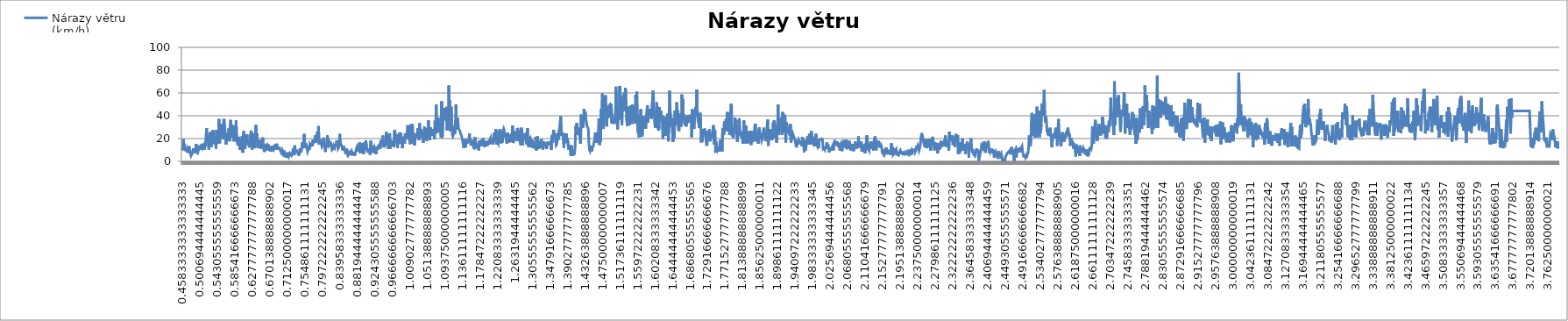
| Category | Nárazy větru (km/h) |
|---|---|
| 0.4583333333333333 | 9.4 |
| 0.4590277777777778 | 9 |
| 0.4597222222222222 | 9 |
| 0.4604166666666667 | 19.4 |
| 0.4611111111111111 | 19.4 |
| 0.4618055555555556 | 13 |
| 0.46249999999999997 | 13 |
| 0.46319444444444446 | 11.5 |
| 0.46388888888888885 | 11.5 |
| 0.46458333333333335 | 12.6 |
| 0.46527777777777773 | 12.6 |
| 0.46597222222222223 | 10.1 |
| 0.4666666666666666 | 10.1 |
| 0.4673611111111111 | 10.8 |
| 0.4680555555555555 | 10.8 |
| 0.46875 | 9.4 |
| 0.4694444444444445 | 9.4 |
| 0.4701388888888889 | 7.6 |
| 0.4708333333333334 | 7.6 |
| 0.47152777777777777 | 11.2 |
| 0.47222222222222227 | 11.2 |
| 0.47291666666666665 | 10.1 |
| 0.47361111111111115 | 10.1 |
| 0.47430555555555554 | 13.3 |
| 0.47500000000000003 | 13.3 |
| 0.4756944444444444 | 9.7 |
| 0.4763888888888889 | 9.7 |
| 0.4770833333333333 | 9.7 |
| 0.4777777777777778 | 7.9 |
| 0.4784722222222222 | 7.9 |
| 0.4791666666666667 | 5 |
| 0.4798611111111111 | 5 |
| 0.48055555555555557 | 5.4 |
| 0.48125 | 5.4 |
| 0.48194444444444445 | 6.8 |
| 0.4826388888888889 | 6.8 |
| 0.48333333333333334 | 6.8 |
| 0.4840277777777778 | 6.8 |
| 0.4847222222222222 | 11.5 |
| 0.48541666666666666 | 11.5 |
| 0.4861111111111111 | 7.2 |
| 0.48680555555555555 | 7.2 |
| 0.4875 | 7.2 |
| 0.48819444444444443 | 7.2 |
| 0.4888888888888889 | 11.2 |
| 0.4895833333333333 | 11.2 |
| 0.4902777777777778 | 8.6 |
| 0.4909722222222222 | 8.6 |
| 0.4916666666666667 | 15.1 |
| 0.4923611111111111 | 15.1 |
| 0.4930555555555556 | 12.2 |
| 0.49374999999999997 | 12.2 |
| 0.49444444444444446 | 6.1 |
| 0.49513888888888885 | 6.1 |
| 0.49583333333333335 | 8.3 |
| 0.49652777777777773 | 8.3 |
| 0.49722222222222223 | 10.1 |
| 0.4979166666666666 | 10.1 |
| 0.4986111111111111 | 14 |
| 0.499305555555556 | 12.6 |
| 0.5 | 12.6 |
| 0.500694444444445 | 11.2 |
| 0.501388888888889 | 11.2 |
| 0.502083333333334 | 11.5 |
| 0.502777777777778 | 11.5 |
| 0.503472222222223 | 11.2 |
| 0.504166666666667 | 11.2 |
| 0.504861111111112 | 15.5 |
| 0.505555555555556 | 15.5 |
| 0.506250000000001 | 15.8 |
| 0.506944444444445 | 15.8 |
| 0.50763888888889 | 11.5 |
| 0.508333333333334 | 11.5 |
| 0.509027777777779 | 10.8 |
| 0.509722222222223 | 10.8 |
| 0.510416666666668 | 13.3 |
| 0.511111111111112 | 13.3 |
| 0.511805555555557 | 10.1 |
| 0.512500000000001 | 10.1 |
| 0.513194444444446 | 16.6 |
| 0.51388888888889 | 16.6 |
| 0.514583333333335 | 13 |
| 0.515277777777779 | 13 |
| 0.515972222222224 | 13 |
| 0.516666666666668 | 29.2 |
| 0.517361111111113 | 29.2 |
| 0.518055555555557 | 19.4 |
| 0.518750000000002 | 19.4 |
| 0.519444444444446 | 20.9 |
| 0.520138888888891 | 20.9 |
| 0.520833333333335 | 16.9 |
| 0.52152777777778 | 16.9 |
| 0.522222222222224 | 10.4 |
| 0.522916666666669 | 10.4 |
| 0.523611111111113 | 20.2 |
| 0.524305555555558 | 20.2 |
| 0.525000000000002 | 24.1 |
| 0.525694444444447 | 24.1 |
| 0.526388888888891 | 25.6 |
| 0.527083333333336 | 25.6 |
| 0.52777777777778 | 12.6 |
| 0.528472222222225 | 12.6 |
| 0.529166666666669 | 12.2 |
| 0.529861111111114 | 12.2 |
| 0.530555555555558 | 25.9 |
| 0.531250000000003 | 25.9 |
| 0.531944444444447 | 27.4 |
| 0.532638888888892 | 27.4 |
| 0.533333333333336 | 24.5 |
| 0.534027777777781 | 24.5 |
| 0.534722222222225 | 20.5 |
| 0.53541666666667 | 20.5 |
| 0.536111111111114 | 15.1 |
| 0.536805555555559 | 15.1 |
| 0.537500000000003 | 15.5 |
| 0.538194444444448 | 22 |
| 0.538888888888892 | 22 |
| 0.539583333333337 | 11.2 |
| 0.540277777777781 | 11.2 |
| 0.540972222222226 | 27.7 |
| 0.54166666666667 | 27.7 |
| 0.542361111111115 | 15.8 |
| 0.543055555555559 | 15.8 |
| 0.543750000000004 | 20.2 |
| 0.544444444444448 | 20.2 |
| 0.545138888888893 | 17.3 |
| 0.545833333333337 | 17.3 |
| 0.546527777777781 | 37.1 |
| 0.547222222222226 | 37.1 |
| 0.54791666666667 | 15.8 |
| 0.548611111111115 | 15.8 |
| 0.549305555555559 | 18 |
| 0.550000000000004 | 18 |
| 0.550694444444448 | 33.1 |
| 0.551388888888893 | 33.1 |
| 0.552083333333337 | 32.4 |
| 0.552777777777782 | 32.4 |
| 0.553472222222227 | 21.6 |
| 0.554166666666671 | 21.6 |
| 0.554861111111116 | 22.7 |
| 0.55555555555556 | 22.7 |
| 0.556250000000005 | 22.7 |
| 0.556944444444449 | 19.4 |
| 0.557638888888894 | 19.4 |
| 0.558333333333338 | 37.1 |
| 0.559027777777783 | 37.1 |
| 0.559722222222227 | 36 |
| 0.560416666666672 | 36 |
| 0.561111111111116 | 28.4 |
| 0.561805555555561 | 28.4 |
| 0.562500000000005 | 20.5 |
| 0.56319444444445 | 20.5 |
| 0.563888888888894 | 14.8 |
| 0.564583333333339 | 14.8 |
| 0.565277777777783 | 20.9 |
| 0.565972222222227 | 20.9 |
| 0.566666666666672 | 18 |
| 0.567361111111116 | 18 |
| 0.568055555555561 | 25.2 |
| 0.568750000000005 | 25.2 |
| 0.56944444444445 | 22.7 |
| 0.570138888888894 | 22.7 |
| 0.570833333333339 | 29.2 |
| 0.571527777777783 | 29.2 |
| 0.572222222222228 | 17.6 |
| 0.572916666666672 | 17.6 |
| 0.573611111111117 | 29.2 |
| 0.574305555555561 | 29.2 |
| 0.575000000000006 | 36.4 |
| 0.57569444444445 | 21.2 |
| 0.576388888888895 | 21.2 |
| 0.577083333333339 | 32 |
| 0.577777777777784 | 32 |
| 0.578472222222228 | 24.1 |
| 0.579166666666673 | 24.1 |
| 0.579861111111117 | 24.1 |
| 0.580555555555562 | 24.1 |
| 0.581250000000006 | 31.7 |
| 0.581944444444451 | 31.7 |
| 0.582638888888895 | 17.6 |
| 0.58333333333334 | 17.6 |
| 0.584027777777784 | 20.9 |
| 0.584722222222229 | 20.9 |
| 0.585416666666673 | 17.6 |
| 0.586111111111118 | 17.6 |
| 0.586805555555562 | 24.8 |
| 0.587500000000007 | 24.8 |
| 0.588194444444451 | 36 |
| 0.588888888888896 | 36 |
| 0.58958333333334 | 19.1 |
| 0.590277777777785 | 19.1 |
| 0.590972222222229 | 19.4 |
| 0.591666666666674 | 19.4 |
| 0.592361111111118 | 14 |
| 0.593055555555563 | 14 |
| 0.593750000000007 | 14 |
| 0.594444444444452 | 21.6 |
| 0.595138888888896 | 21.6 |
| 0.595833333333341 | 16.2 |
| 0.596527777777786 | 16.2 |
| 0.59722222222223 | 10.1 |
| 0.597916666666675 | 10.1 |
| 0.598611111111119 | 13.7 |
| 0.599305555555564 | 13.7 |
| 0.600000000000008 | 12.2 |
| 0.600694444444453 | 12.2 |
| 0.601388888888897 | 11.5 |
| 0.602083333333342 | 11.5 |
| 0.602777777777786 | 22 |
| 0.603472222222231 | 22 |
| 0.604166666666675 | 7.6 |
| 0.60486111111112 | 7.6 |
| 0.605555555555564 | 23.4 |
| 0.606250000000009 | 23.4 |
| 0.606944444444453 | 26.6 |
| 0.607638888888898 | 26.6 |
| 0.608333333333342 | 14.4 |
| 0.609027777777787 | 14.4 |
| 0.609722222222231 | 10.8 |
| 0.610416666666676 | 10.8 |
| 0.61111111111112 | 17.3 |
| 0.611805555555565 | 17.3 |
| 0.612500000000009 | 22 |
| 0.613194444444454 | 23.8 |
| 0.613888888888898 | 23.8 |
| 0.614583333333343 | 14.8 |
| 0.615277777777787 | 14.8 |
| 0.615972222222232 | 16.6 |
| 0.616666666666676 | 16.6 |
| 0.617361111111121 | 15.5 |
| 0.618055555555565 | 15.5 |
| 0.61875000000001 | 14.4 |
| 0.619444444444454 | 14.4 |
| 0.620138888888899 | 12.2 |
| 0.620833333333343 | 12.2 |
| 0.621527777777788 | 23.4 |
| 0.622222222222232 | 23.4 |
| 0.622916666666677 | 22.3 |
| 0.623611111111121 | 22.3 |
| 0.624305555555566 | 27 |
| 0.62500000000001 | 27 |
| 0.625694444444455 | 24.5 |
| 0.626388888888899 | 24.5 |
| 0.627083333333344 | 10.4 |
| 0.627777777777788 | 10.4 |
| 0.628472222222233 | 16.2 |
| 0.629166666666677 | 16.2 |
| 0.629861111111122 | 24.5 |
| 0.630555555555566 | 24.5 |
| 0.631250000000011 | 24.5 |
| 0.631944444444455 | 11.5 |
| 0.6326388888889 | 11.5 |
| 0.633333333333344 | 12.2 |
| 0.634027777777789 | 12.2 |
| 0.634722222222233 | 23.4 |
| 0.635416666666677 | 23.4 |
| 0.636111111111122 | 32 |
| 0.636805555555566 | 32 |
| 0.637500000000011 | 19.1 |
| 0.638194444444455 | 19.1 |
| 0.6388888888889 | 24.5 |
| 0.639583333333344 | 24.5 |
| 0.640277777777789 | 11.9 |
| 0.640972222222233 | 11.9 |
| 0.641666666666678 | 15.5 |
| 0.642361111111122 | 15.5 |
| 0.643055555555567 | 18.7 |
| 0.643750000000011 | 18.7 |
| 0.644444444444456 | 13.7 |
| 0.6451388888889 | 13.7 |
| 0.645833333333345 | 16.6 |
| 0.646527777777789 | 16.6 |
| 0.647222222222234 | 11.2 |
| 0.647916666666678 | 11.2 |
| 0.648611111111123 | 16.2 |
| 0.649305555555567 | 16.2 |
| 0.650000000000012 | 16.6 |
| 0.650694444444456 | 16.6 |
| 0.651388888888901 | 14 |
| 0.652083333333345 | 14 |
| 0.65277777777779 | 20.9 |
| 0.653472222222234 | 13.3 |
| 0.654166666666679 | 13.3 |
| 0.654861111111123 | 13.7 |
| 0.655555555555568 | 13.7 |
| 0.656250000000012 | 8.3 |
| 0.656944444444457 | 8.3 |
| 0.657638888888901 | 8.3 |
| 0.658333333333346 | 8.3 |
| 0.65902777777779 | 14 |
| 0.659722222222235 | 14 |
| 0.660416666666679 | 15.5 |
| 0.661111111111124 | 15.5 |
| 0.661805555555568 | 12.2 |
| 0.662500000000013 | 12.2 |
| 0.663194444444457 | 13.3 |
| 0.663888888888902 | 13.3 |
| 0.664583333333346 | 9.7 |
| 0.665277777777791 | 9.7 |
| 0.665972222222235 | 14.8 |
| 0.66666666666668 | 14.8 |
| 0.667361111111124 | 13.3 |
| 0.668055555555569 | 13.3 |
| 0.668750000000013 | 11.2 |
| 0.669444444444458 | 11.2 |
| 0.670138888888902 | 9.7 |
| 0.670833333333347 | 9.7 |
| 0.671527777777791 | 9.7 |
| 0.672222222222236 | 9.7 |
| 0.67291666666668 | 9.7 |
| 0.673611111111125 | 9 |
| 0.674305555555569 | 9 |
| 0.675000000000014 | 13.7 |
| 0.675694444444458 | 13.7 |
| 0.676388888888903 | 9 |
| 0.677083333333347 | 9 |
| 0.677777777777792 | 12.2 |
| 0.678472222222236 | 12.2 |
| 0.679166666666681 | 10.8 |
| 0.679861111111125 | 10.8 |
| 0.68055555555557 | 11.5 |
| 0.681250000000014 | 11.5 |
| 0.681944444444459 | 13.7 |
| 0.682638888888903 | 13.7 |
| 0.683333333333348 | 15.1 |
| 0.684027777777792 | 15.1 |
| 0.684722222222237 | 10.4 |
| 0.685416666666681 | 10.4 |
| 0.686111111111126 | 15.5 |
| 0.68680555555557 | 15.5 |
| 0.687500000000015 | 13.3 |
| 0.688194444444459 | 13.3 |
| 0.688888888888904 | 11.5 |
| 0.689583333333348 | 11.5 |
| 0.690277777777793 | 10.8 |
| 0.690972222222237 | 10.8 |
| 0.691666666666682 | 11.2 |
| 0.692361111111126 | 12.6 |
| 0.693055555555571 | 12.6 |
| 0.693750000000015 | 11.2 |
| 0.69444444444446 | 11.2 |
| 0.695138888888904 | 9.4 |
| 0.695833333333349 | 9.4 |
| 0.696527777777793 | 9.7 |
| 0.697222222222238 | 9.7 |
| 0.697916666666682 | 7.6 |
| 0.698611111111127 | 7.6 |
| 0.699305555555571 | 5.8 |
| 0.700000000000016 | 5.8 |
| 0.70069444444446 | 9.4 |
| 0.701388888888905 | 9.4 |
| 0.702083333333349 | 8.3 |
| 0.702777777777794 | 8.3 |
| 0.703472222222238 | 4.3 |
| 0.704166666666683 | 4.3 |
| 0.704861111111127 | 9.4 |
| 0.705555555555572 | 9.4 |
| 0.706250000000016 | 5 |
| 0.706944444444461 | 5 |
| 0.707638888888905 | 5.4 |
| 0.70833333333335 | 5.4 |
| 0.709027777777794 | 5.4 |
| 0.709722222222239 | 3.2 |
| 0.710416666666683 | 3.2 |
| 0.711111111111128 | 5.4 |
| 0.711805555555572 | 5.4 |
| 0.712500000000017 | 7.9 |
| 0.713194444444461 | 7.9 |
| 0.713888888888906 | 8.3 |
| 0.71458333333335 | 8.3 |
| 0.715277777777795 | 4.3 |
| 0.715972222222239 | 4.3 |
| 0.716666666666684 | 5 |
| 0.717361111111128 | 5 |
| 0.718055555555573 | 7.2 |
| 0.718750000000017 | 7.2 |
| 0.719444444444462 | 7.6 |
| 0.720138888888906 | 7.6 |
| 0.720833333333351 | 5.8 |
| 0.721527777777795 | 5.8 |
| 0.72222222222224 | 5 |
| 0.722916666666684 | 5 |
| 0.723611111111129 | 5.8 |
| 0.724305555555573 | 5.8 |
| 0.725000000000018 | 8.6 |
| 0.725694444444462 | 8.6 |
| 0.726388888888907 | 11.2 |
| 0.727083333333351 | 11.2 |
| 0.727777777777796 | 7.6 |
| 0.72847222222224 | 7.6 |
| 0.729166666666685 | 5.4 |
| 0.729861111111129 | 14 |
| 0.730555555555574 | 14 |
| 0.731250000000018 | 10.4 |
| 0.731944444444463 | 10.4 |
| 0.732638888888907 | 7.9 |
| 0.733333333333352 | 7.9 |
| 0.734027777777796 | 10.1 |
| 0.734722222222241 | 10.1 |
| 0.735416666666685 | 8.3 |
| 0.73611111111113 | 8.3 |
| 0.736805555555574 | 7.6 |
| 0.737500000000019 | 7.6 |
| 0.738194444444463 | 7.2 |
| 0.738888888888908 | 7.2 |
| 0.739583333333352 | 5 |
| 0.740277777777797 | 5 |
| 0.740972222222241 | 7.2 |
| 0.741666666666686 | 7.2 |
| 0.74236111111113 | 11.5 |
| 0.743055555555575 | 11.5 |
| 0.743750000000019 | 9.7 |
| 0.744444444444464 | 9.7 |
| 0.745138888888908 | 7.6 |
| 0.745833333333353 | 7.6 |
| 0.746527777777797 | 11.5 |
| 0.747222222222242 | 11.5 |
| 0.747916666666686 | 11.5 |
| 0.748611111111131 | 16.9 |
| 0.749305555555575 | 16.9 |
| 0.75000000000002 | 11.5 |
| 0.750694444444464 | 11.5 |
| 0.751388888888909 | 15.1 |
| 0.752083333333353 | 15.1 |
| 0.752777777777798 | 24.1 |
| 0.753472222222242 | 24.1 |
| 0.754166666666687 | 13.3 |
| 0.754861111111131 | 13.3 |
| 0.755555555555576 | 13.3 |
| 0.75625000000002 | 13.3 |
| 0.756944444444465 | 12.6 |
| 0.757638888888909 | 12.6 |
| 0.758333333333354 | 13.7 |
| 0.759027777777798 | 13.7 |
| 0.759722222222243 | 13.7 |
| 0.760416666666687 | 13.7 |
| 0.761111111111132 | 8.6 |
| 0.761805555555576 | 8.6 |
| 0.762500000000021 | 8.6 |
| 0.763194444444465 | 8.6 |
| 0.76388888888891 | 11.5 |
| 0.764583333333354 | 11.5 |
| 0.765277777777799 | 10.1 |
| 0.765972222222243 | 10.1 |
| 0.766666666666688 | 15.1 |
| 0.767361111111132 | 15.1 |
| 0.768055555555577 | 15.5 |
| 0.768750000000021 | 13.7 |
| 0.769444444444466 | 13.7 |
| 0.77013888888891 | 14 |
| 0.770833333333355 | 14 |
| 0.771527777777799 | 15.5 |
| 0.772222222222244 | 15.5 |
| 0.772916666666688 | 13.3 |
| 0.773611111111132 | 13.3 |
| 0.774305555555577 | 19.1 |
| 0.775000000000021 | 19.1 |
| 0.775694444444466 | 16.6 |
| 0.77638888888891 | 16.6 |
| 0.777083333333355 | 16.6 |
| 0.777777777777799 | 16.6 |
| 0.778472222222244 | 17.3 |
| 0.779166666666688 | 17.3 |
| 0.779861111111133 | 23 |
| 0.780555555555577 | 23 |
| 0.781250000000022 | 16.6 |
| 0.781944444444466 | 16.6 |
| 0.782638888888911 | 18.4 |
| 0.783333333333355 | 18.4 |
| 0.7840277777778 | 24.8 |
| 0.784722222222244 | 24.8 |
| 0.785416666666689 | 24.5 |
| 0.786111111111133 | 24.5 |
| 0.786805555555578 | 24.5 |
| 0.787500000000022 | 31 |
| 0.788194444444467 | 31 |
| 0.788888888888911 | 14.8 |
| 0.789583333333356 | 14.8 |
| 0.7902777777778 | 17.3 |
| 0.790972222222245 | 17.3 |
| 0.791666666666689 | 19.4 |
| 0.792361111111134 | 19.4 |
| 0.793055555555578 | 18.7 |
| 0.793750000000023 | 18.7 |
| 0.794444444444467 | 15.8 |
| 0.795138888888912 | 15.8 |
| 0.795833333333356 | 13 |
| 0.796527777777801 | 13 |
| 0.797222222222245 | 14 |
| 0.79791666666669 | 14 |
| 0.798611111111134 | 16.6 |
| 0.799305555555579 | 16.6 |
| 0.800000000000023 | 20.9 |
| 0.800694444444468 | 20.9 |
| 0.801388888888912 | 16.6 |
| 0.802083333333357 | 16.6 |
| 0.802777777777801 | 17.3 |
| 0.803472222222246 | 17.3 |
| 0.80416666666669 | 8.3 |
| 0.804861111111135 | 8.3 |
| 0.805555555555579 | 13.7 |
| 0.806250000000024 | 13.7 |
| 0.806944444444468 | 15.5 |
| 0.807638888888913 | 12.6 |
| 0.808333333333357 | 12.6 |
| 0.809027777777802 | 22.7 |
| 0.809722222222246 | 22.7 |
| 0.810416666666691 | 14.8 |
| 0.811111111111135 | 14.8 |
| 0.81180555555558 | 19.4 |
| 0.812500000000024 | 19.4 |
| 0.813194444444469 | 14 |
| 0.813888888888913 | 14 |
| 0.814583333333358 | 14.8 |
| 0.815277777777802 | 14.8 |
| 0.815972222222247 | 15.1 |
| 0.816666666666691 | 15.1 |
| 0.817361111111136 | 15.8 |
| 0.81805555555558 | 15.8 |
| 0.818750000000025 | 13.7 |
| 0.819444444444469 | 13.7 |
| 0.820138888888914 | 10.1 |
| 0.820833333333358 | 10.1 |
| 0.821527777777803 | 9.7 |
| 0.822222222222247 | 9.7 |
| 0.822916666666692 | 11.2 |
| 0.823611111111136 | 11.2 |
| 0.824305555555581 | 13.7 |
| 0.825000000000025 | 13.7 |
| 0.82569444444447 | 13.7 |
| 0.826388888888914 | 12.2 |
| 0.827083333333359 | 12.2 |
| 0.827777777777803 | 15.5 |
| 0.828472222222248 | 15.5 |
| 0.829166666666692 | 13.3 |
| 0.829861111111137 | 13.3 |
| 0.830555555555581 | 13.7 |
| 0.831250000000026 | 13.7 |
| 0.83194444444447 | 18.4 |
| 0.832638888888915 | 18.4 |
| 0.833333333333359 | 18 |
| 0.834027777777804 | 18 |
| 0.834722222222248 | 11.2 |
| 0.835416666666693 | 11.2 |
| 0.836111111111137 | 12.2 |
| 0.836805555555582 | 12.2 |
| 0.837500000000026 | 13.3 |
| 0.838194444444471 | 13.3 |
| 0.838888888888915 | 24.1 |
| 0.83958333333336 | 24.1 |
| 0.840277777777804 | 13.7 |
| 0.840972222222249 | 13.7 |
| 0.841666666666693 | 15.5 |
| 0.842361111111138 | 15.5 |
| 0.843055555555582 | 16.2 |
| 0.843750000000027 | 16.2 |
| 0.844444444444471 | 12.6 |
| 0.845138888888916 | 12.6 |
| 0.84583333333336 | 9.7 |
| 0.846527777777805 | 12.2 |
| 0.847222222222249 | 12.2 |
| 0.847916666666694 | 12.2 |
| 0.848611111111138 | 12.2 |
| 0.849305555555583 | 12.6 |
| 0.850000000000027 | 12.6 |
| 0.850694444444472 | 13 |
| 0.851388888888916 | 13 |
| 0.852083333333361 | 8.3 |
| 0.852777777777805 | 8.3 |
| 0.85347222222225 | 6.5 |
| 0.854166666666694 | 6.5 |
| 0.854861111111139 | 11.2 |
| 0.855555555555583 | 11.2 |
| 0.856250000000028 | 7.6 |
| 0.856944444444472 | 7.6 |
| 0.857638888888917 | 6.1 |
| 0.858333333333361 | 6.1 |
| 0.859027777777806 | 7.6 |
| 0.85972222222225 | 7.6 |
| 0.860416666666695 | 6.1 |
| 0.861111111111139 | 6.1 |
| 0.861805555555584 | 7.2 |
| 0.862500000000028 | 7.2 |
| 0.863194444444473 | 7.2 |
| 0.863888888888917 | 8.3 |
| 0.864583333333362 | 8.3 |
| 0.865277777777806 | 5.4 |
| 0.865972222222251 | 5.4 |
| 0.866666666666695 | 6.1 |
| 0.86736111111114 | 6.1 |
| 0.868055555555584 | 8.3 |
| 0.868750000000029 | 8.3 |
| 0.869444444444473 | 6.1 |
| 0.870138888888918 | 6.1 |
| 0.870833333333362 | 6.5 |
| 0.871527777777807 | 6.5 |
| 0.872222222222251 | 6.5 |
| 0.872916666666696 | 6.5 |
| 0.87361111111114 | 8.3 |
| 0.874305555555585 | 8.3 |
| 0.875000000000029 | 5 |
| 0.875694444444474 | 5 |
| 0.876388888888918 | 7.2 |
| 0.877083333333363 | 7.2 |
| 0.877777777777807 | 9 |
| 0.878472222222252 | 9 |
| 0.879166666666696 | 9.7 |
| 0.879861111111141 | 9.7 |
| 0.880555555555585 | 12.6 |
| 0.88125000000003 | 12.6 |
| 0.881944444444474 | 11.2 |
| 0.882638888888919 | 11.2 |
| 0.883333333333363 | 8.6 |
| 0.884027777777808 | 10.1 |
| 0.884722222222252 | 10.1 |
| 0.885416666666697 | 13.7 |
| 0.886111111111141 | 13.7 |
| 0.886805555555586 | 16.6 |
| 0.88750000000003 | 16.6 |
| 0.888194444444475 | 7.2 |
| 0.888888888888919 | 7.2 |
| 0.889583333333364 | 10.4 |
| 0.890277777777808 | 10.4 |
| 0.890972222222253 | 9 |
| 0.891666666666697 | 9 |
| 0.892361111111142 | 7.2 |
| 0.893055555555586 | 7.2 |
| 0.893750000000031 | 16.2 |
| 0.894444444444475 | 16.2 |
| 0.89513888888892 | 14.8 |
| 0.895833333333364 | 14.8 |
| 0.896527777777809 | 6.5 |
| 0.897222222222253 | 6.5 |
| 0.897916666666698 | 10.4 |
| 0.898611111111142 | 10.4 |
| 0.899305555555587 | 13.3 |
| 0.900000000000031 | 13.3 |
| 0.900694444444476 | 12.2 |
| 0.90138888888892 | 12.2 |
| 0.902083333333365 | 18.4 |
| 0.902777777777809 | 18.4 |
| 0.903472222222254 | 18.4 |
| 0.904166666666698 | 11.2 |
| 0.904861111111143 | 11.2 |
| 0.905555555555587 | 9.4 |
| 0.906250000000032 | 9.4 |
| 0.906944444444476 | 7.6 |
| 0.907638888888921 | 7.6 |
| 0.908333333333365 | 9.7 |
| 0.90902777777781 | 9.7 |
| 0.909722222222254 | 11.2 |
| 0.910416666666699 | 11.2 |
| 0.911111111111143 | 8.6 |
| 0.911805555555587 | 8.6 |
| 0.912500000000032 | 5.8 |
| 0.913194444444476 | 5.8 |
| 0.913888888888921 | 18 |
| 0.914583333333365 | 18 |
| 0.91527777777781 | 14.4 |
| 0.915972222222254 | 14.4 |
| 0.916666666666699 | 11.2 |
| 0.917361111111143 | 11.2 |
| 0.918055555555588 | 13.3 |
| 0.918750000000032 | 13.3 |
| 0.919444444444477 | 7.6 |
| 0.920138888888921 | 7.6 |
| 0.920833333333366 | 10.8 |
| 0.92152777777781 | 10.8 |
| 0.922222222222255 | 12.2 |
| 0.922916666666699 | 12.2 |
| 0.923611111111144 | 12.6 |
| 0.924305555555588 | 12.6 |
| 0.925000000000033 | 6.8 |
| 0.925694444444477 | 12.2 |
| 0.926388888888922 | 12.2 |
| 0.927083333333366 | 6.5 |
| 0.927777777777811 | 6.5 |
| 0.928472222222255 | 11.9 |
| 0.9291666666667 | 11.9 |
| 0.929861111111144 | 11.5 |
| 0.930555555555589 | 11.5 |
| 0.931250000000033 | 11.5 |
| 0.931944444444478 | 11.5 |
| 0.932638888888922 | 14 |
| 0.933333333333367 | 14 |
| 0.934027777777811 | 13.3 |
| 0.934722222222256 | 13.3 |
| 0.9354166666667 | 14.8 |
| 0.936111111111145 | 14.8 |
| 0.936805555555589 | 10.8 |
| 0.937500000000034 | 10.8 |
| 0.938194444444478 | 18.7 |
| 0.938888888888923 | 18.7 |
| 0.939583333333367 | 17.6 |
| 0.940277777777812 | 17.6 |
| 0.940972222222256 | 17.6 |
| 0.941666666666701 | 17.6 |
| 0.942361111111145 | 17.6 |
| 0.94305555555559 | 22.7 |
| 0.943750000000034 | 22.7 |
| 0.944444444444479 | 12.6 |
| 0.945138888888923 | 12.6 |
| 0.945833333333368 | 15.1 |
| 0.946527777777812 | 15.1 |
| 0.947222222222257 | 12.2 |
| 0.947916666666701 | 12.2 |
| 0.948611111111146 | 15.5 |
| 0.94930555555559 | 15.5 |
| 0.950000000000035 | 18.7 |
| 0.950694444444479 | 18.7 |
| 0.951388888888924 | 25.9 |
| 0.952083333333368 | 25.9 |
| 0.952777777777813 | 14 |
| 0.953472222222257 | 14 |
| 0.954166666666702 | 15.5 |
| 0.954861111111146 | 15.5 |
| 0.955555555555591 | 23.4 |
| 0.956250000000035 | 23.4 |
| 0.95694444444448 | 10.8 |
| 0.957638888888924 | 10.8 |
| 0.958333333333369 | 22.7 |
| 0.959027777777813 | 22.7 |
| 0.959722222222258 | 24.5 |
| 0.960416666666702 | 24.5 |
| 0.961111111111147 | 11.2 |
| 0.961805555555591 | 18.7 |
| 0.962500000000036 | 18.7 |
| 0.96319444444448 | 15.1 |
| 0.963888888888925 | 15.1 |
| 0.964583333333369 | 14.4 |
| 0.965277777777814 | 14.4 |
| 0.965972222222258 | 18 |
| 0.966666666666703 | 18 |
| 0.967361111111147 | 13.3 |
| 0.968055555555592 | 13.3 |
| 0.968750000000036 | 16.6 |
| 0.969444444444481 | 16.6 |
| 0.970138888888925 | 12.6 |
| 0.97083333333337 | 12.6 |
| 0.971527777777814 | 27.7 |
| 0.972222222222259 | 27.7 |
| 0.972916666666703 | 25.2 |
| 0.973611111111148 | 25.2 |
| 0.974305555555592 | 20.5 |
| 0.975000000000037 | 20.5 |
| 0.975694444444481 | 16.2 |
| 0.976388888888926 | 16.2 |
| 0.97708333333337 | 23.8 |
| 0.977777777777815 | 23.8 |
| 0.978472222222259 | 11.9 |
| 0.979166666666704 | 11.9 |
| 0.979861111111148 | 11.9 |
| 0.980555555555593 | 19.1 |
| 0.981250000000037 | 19.1 |
| 0.981944444444482 | 23 |
| 0.982638888888926 | 23 |
| 0.983333333333371 | 25.2 |
| 0.984027777777815 | 25.2 |
| 0.98472222222226 | 15.5 |
| 0.985416666666704 | 15.5 |
| 0.986111111111149 | 25.2 |
| 0.986805555555593 | 25.2 |
| 0.987500000000038 | 25.2 |
| 0.988194444444482 | 25.2 |
| 0.988888888888927 | 18.7 |
| 0.989583333333371 | 18.7 |
| 0.990277777777816 | 11.5 |
| 0.99097222222226 | 11.5 |
| 0.991666666666705 | 16.2 |
| 0.992361111111149 | 16.2 |
| 0.993055555555594 | 18.7 |
| 0.993750000000038 | 18.7 |
| 0.994444444444483 | 21.2 |
| 0.995138888888927 | 21.2 |
| 0.995833333333372 | 15.5 |
| 0.996527777777816 | 15.5 |
| 0.997222222222261 | 24.5 |
| 0.997916666666705 | 24.5 |
| 0.99861111111115 | 23.8 |
| 0.999305555555594 | 23.8 |
| 1900-01-01 | 20.5 |
| 1900-01-01 00:01:00 | 22 |
| 1900-01-01 00:02:00 | 22 |
| 1900-01-01 00:03:00 | 22 |
| 1900-01-01 00:04:00 | 22 |
| 1900-01-01 00:05:00 | 31.7 |
| 1900-01-01 00:06:00 | 31.7 |
| 1900-01-01 00:07:00 | 19.4 |
| 1900-01-01 00:08:00 | 19.4 |
| 1900-01-01 00:09:00 | 22.7 |
| 1900-01-01 00:10:00 | 22.7 |
| 1900-01-01 00:11:00 | 18.7 |
| 1900-01-01 00:12:00 | 18.7 |
| 1900-01-01 00:13:00 | 15.1 |
| 1900-01-01 00:14:00 | 15.1 |
| 1900-01-01 00:15:00 | 32.4 |
| 1900-01-01 00:16:00 | 32.4 |
| 1900-01-01 00:17:00 | 15.8 |
| 1900-01-01 00:18:00 | 15.8 |
| 1900-01-01 00:19:00 | 18.7 |
| 1900-01-01 00:20:00 | 18.7 |
| 1900-01-01 00:21:00 | 32.8 |
| 1900-01-01 00:22:00 | 32.8 |
| 1900-01-01 00:23:00 | 20.5 |
| 1900-01-01 00:24:00 | 20.5 |
| 1900-01-01 00:25:00 | 20.5 |
| 1900-01-01 00:26:00 | 24.5 |
| 1900-01-01 00:27:00 | 24.5 |
| 1900-01-01 00:28:00 | 14 |
| 1900-01-01 00:29:00 | 14 |
| 1900-01-01 00:30:00 | 16.6 |
| 1900-01-01 00:31:00 | 16.6 |
| 1900-01-01 00:32:00 | 24.5 |
| 1900-01-01 00:33:00 | 24.5 |
| 1900-01-01 00:34:00 | 20.9 |
| 1900-01-01 00:35:00 | 20.9 |
| 1900-01-01 00:36:00 | 23 |
| 1900-01-01 00:37:00 | 23 |
| 1900-01-01 00:38:00 | 24.5 |
| 1900-01-01 00:39:00 | 24.5 |
| 1900-01-01 00:40:00 | 29.2 |
| 1900-01-01 00:41:00 | 29.2 |
| 1900-01-01 00:42:00 | 28.8 |
| 1900-01-01 00:43:00 | 28.8 |
| 1900-01-01 00:44:00 | 18.7 |
| 1900-01-01 00:45:00 | 18.7 |
| 1900-01-01 00:46:00 | 33.5 |
| 1900-01-01 00:47:00 | 33.5 |
| 1900-01-01 00:48:00 | 22.7 |
| 1900-01-01 00:49:00 | 22.7 |
| 1900-01-01 00:50:00 | 28.4 |
| 1900-01-01 00:51:00 | 28.4 |
| 1900-01-01 00:52:00 | 23 |
| 1900-01-01 00:53:00 | 23 |
| 1900-01-01 00:54:00 | 24.1 |
| 1900-01-01 00:55:00 | 24.1 |
| 1900-01-01 00:56:00 | 20.2 |
| 1900-01-01 00:57:00 | 22 |
| 1900-01-01 00:58:00 | 22 |
| 1900-01-01 00:59:00 | 16.2 |
| 1900-01-01 01:00:00 | 16.2 |
| 1900-01-01 01:01:00 | 25.2 |
| 1900-01-01 01:02:00 | 25.2 |
| 1900-01-01 01:03:00 | 29.5 |
| 1900-01-01 01:04:00 | 29.5 |
| 1900-01-01 01:05:00 | 29.2 |
| 1900-01-01 01:06:00 | 29.2 |
| 1900-01-01 01:07:00 | 28.8 |
| 1900-01-01 01:08:00 | 28.8 |
| 1900-01-01 01:09:00 | 22.7 |
| 1900-01-01 01:10:00 | 22.7 |
| 1900-01-01 01:11:00 | 18 |
| 1900-01-01 01:12:00 | 18 |
| 1900-01-01 01:13:00 | 27 |
| 1900-01-01 01:14:00 | 27 |
| 1900-01-01 01:15:00 | 25.2 |
| 1900-01-01 01:16:00 | 25.2 |
| 1900-01-01 01:17:00 | 36 |
| 1900-01-01 01:18:00 | 36 |
| 1900-01-01 01:19:00 | 23.4 |
| 1900-01-01 01:20:00 | 23.4 |
| 1900-01-01 01:21:00 | 23.4 |
| 1900-01-01 01:22:00 | 18.7 |
| 1900-01-01 01:23:00 | 18.7 |
| 1900-01-01 01:24:00 | 29.9 |
| 1900-01-01 01:25:00 | 29.9 |
| 1900-01-01 01:26:00 | 27 |
| 1900-01-01 01:27:00 | 27 |
| 1900-01-01 01:28:00 | 22.3 |
| 1900-01-01 01:29:00 | 22.3 |
| 1900-01-01 01:30:00 | 26.6 |
| 1900-01-01 01:31:00 | 26.6 |
| 1900-01-01 01:32:00 | 22.7 |
| 1900-01-01 01:33:00 | 22.7 |
| 1900-01-01 01:34:00 | 28.4 |
| 1900-01-01 01:35:00 | 28.4 |
| 1900-01-01 01:36:00 | 26.6 |
| 1900-01-01 01:37:00 | 26.6 |
| 1900-01-01 01:38:00 | 19.4 |
| 1900-01-01 01:39:00 | 19.4 |
| 1900-01-01 01:40:00 | 35.6 |
| 1900-01-01 01:41:00 | 35.6 |
| 1900-01-01 01:42:00 | 24.5 |
| 1900-01-01 01:43:00 | 24.5 |
| 1900-01-01 01:44:00 | 50 |
| 1900-01-01 01:45:00 | 50 |
| 1900-01-01 01:46:00 | 25.2 |
| 1900-01-01 01:47:00 | 25.2 |
| 1900-01-01 01:48:00 | 27.7 |
| 1900-01-01 01:49:00 | 27.7 |
| 1900-01-01 01:50:00 | 36.4 |
| 1900-01-01 01:51:00 | 38.5 |
| 1900-01-01 01:52:00 | 38.5 |
| 1900-01-01 01:53:00 | 32.4 |
| 1900-01-01 01:54:00 | 32.4 |
| 1900-01-01 01:55:00 | 25.6 |
| 1900-01-01 01:56:00 | 25.6 |
| 1900-01-01 01:57:00 | 27.7 |
| 1900-01-01 01:58:00 | 27.7 |
| 1900-01-01 01:59:00 | 33.1 |
| 1900-01-01 02:00:00 | 33.1 |
| 1900-01-01 02:01:00 | 21.2 |
| 1900-01-01 02:02:00 | 21.2 |
| 1900-01-01 02:03:00 | 52.6 |
| 1900-01-01 02:04:00 | 52.6 |
| 1900-01-01 02:05:00 | 20.5 |
| 1900-01-01 02:06:00 | 20.5 |
| 1900-01-01 02:07:00 | 29.9 |
| 1900-01-01 02:08:00 | 29.9 |
| 1900-01-01 02:09:00 | 37.8 |
| 1900-01-01 02:10:00 | 37.8 |
| 1900-01-01 02:11:00 | 36 |
| 1900-01-01 02:12:00 | 36 |
| 1900-01-01 02:13:00 | 46.8 |
| 1900-01-01 02:14:00 | 46.8 |
| 1900-01-01 02:15:00 | 45 |
| 1900-01-01 02:16:00 | 45 |
| 1900-01-01 02:17:00 | 45 |
| 1900-01-01 02:18:00 | 45 |
| 1900-01-01 02:19:00 | 45 |
| 1900-01-01 02:20:00 | 47.9 |
| 1900-01-01 02:21:00 | 47.9 |
| 1900-01-01 02:22:00 | 27.4 |
| 1900-01-01 02:23:00 | 27.4 |
| 1900-01-01 02:24:00 | 29.9 |
| 1900-01-01 02:25:00 | 29.9 |
| 1900-01-01 02:26:00 | 32 |
| 1900-01-01 02:27:00 | 32 |
| 1900-01-01 02:28:00 | 66.6 |
| 1900-01-01 02:29:00 | 66.6 |
| 1900-01-01 02:30:00 | 36 |
| 1900-01-01 02:31:00 | 36 |
| 1900-01-01 02:32:00 | 53.3 |
| 1900-01-01 02:33:00 | 53.3 |
| 1900-01-01 02:34:00 | 26.6 |
| 1900-01-01 02:35:00 | 26.6 |
| 1900-01-01 02:36:00 | 47.9 |
| 1900-01-01 02:37:00 | 47.9 |
| 1900-01-01 02:38:00 | 38.5 |
| 1900-01-01 02:39:00 | 38.5 |
| 1900-01-01 02:40:00 | 23.4 |
| 1900-01-01 02:41:00 | 23.4 |
| 1900-01-01 02:42:00 | 22 |
| 1900-01-01 02:43:00 | 22 |
| 1900-01-01 02:44:00 | 23.4 |
| 1900-01-01 02:45:00 | 23.4 |
| 1900-01-01 02:46:00 | 29.5 |
| 1900-01-01 02:47:00 | 31 |
| 1900-01-01 02:48:00 | 31 |
| 1900-01-01 02:49:00 | 24.1 |
| 1900-01-01 02:50:00 | 24.1 |
| 1900-01-01 02:51:00 | 36 |
| 1900-01-01 02:52:00 | 36 |
| 1900-01-01 02:53:00 | 50 |
| 1900-01-01 02:54:00 | 50 |
| 1900-01-01 02:55:00 | 28.1 |
| 1900-01-01 02:56:00 | 28.1 |
| 1900-01-01 02:57:00 | 29.5 |
| 1900-01-01 02:58:00 | 29.5 |
| 1900-01-01 02:59:00 | 38.5 |
| 1900-01-01 03:00:00 | 38.5 |
| 1900-01-01 03:01:00 | 29.5 |
| 1900-01-01 03:02:00 | 29.5 |
| 1900-01-01 03:03:00 | 28.4 |
| 1900-01-01 03:04:00 | 28.4 |
| 1900-01-01 03:05:00 | 28.1 |
| 1900-01-01 03:06:00 | 28.1 |
| 1900-01-01 03:07:00 | 26.3 |
| 1900-01-01 03:08:00 | 26.3 |
| 1900-01-01 03:09:00 | 24.1 |
| 1900-01-01 03:10:00 | 24.1 |
| 1900-01-01 03:11:00 | 24.1 |
| 1900-01-01 03:12:00 | 22.7 |
| 1900-01-01 03:13:00 | 22.7 |
| 1900-01-01 03:14:00 | 22.7 |
| 1900-01-01 03:15:00 | 22.7 |
| 1900-01-01 03:16:00 | 18 |
| 1900-01-01 03:17:00 | 18 |
| 1900-01-01 03:18:00 | 17.6 |
| 1900-01-01 03:19:00 | 17.6 |
| 1900-01-01 03:20:00 | 11.9 |
| 1900-01-01 03:21:00 | 11.9 |
| 1900-01-01 03:22:00 | 15.5 |
| 1900-01-01 03:23:00 | 15.5 |
| 1900-01-01 03:24:00 | 19.4 |
| 1900-01-01 03:25:00 | 19.4 |
| 1900-01-01 03:26:00 | 12.2 |
| 1900-01-01 03:27:00 | 12.2 |
| 1900-01-01 03:28:00 | 19.4 |
| 1900-01-01 03:29:00 | 19.4 |
| 1900-01-01 03:30:00 | 16.2 |
| 1900-01-01 03:31:00 | 16.2 |
| 1900-01-01 03:32:00 | 15.5 |
| 1900-01-01 03:33:00 | 15.5 |
| 1900-01-01 03:34:00 | 16.6 |
| 1900-01-01 03:35:00 | 16.6 |
| 1900-01-01 03:36:00 | 16.6 |
| 1900-01-01 03:37:00 | 16.6 |
| 1900-01-01 03:38:00 | 18.7 |
| 1900-01-01 03:39:00 | 18.7 |
| 1900-01-01 03:40:00 | 24.5 |
| 1900-01-01 03:41:00 | 19.1 |
| 1900-01-01 03:42:00 | 19.1 |
| 1900-01-01 03:43:00 | 17.3 |
| 1900-01-01 03:44:00 | 17.3 |
| 1900-01-01 03:45:00 | 14 |
| 1900-01-01 03:46:00 | 14 |
| 1900-01-01 03:47:00 | 18.7 |
| 1900-01-01 03:48:00 | 18.7 |
| 1900-01-01 03:49:00 | 18 |
| 1900-01-01 03:50:00 | 18 |
| 1900-01-01 03:51:00 | 15.1 |
| 1900-01-01 03:52:00 | 15.1 |
| 1900-01-01 03:53:00 | 16.9 |
| 1900-01-01 03:54:00 | 16.9 |
| 1900-01-01 03:55:00 | 12.2 |
| 1900-01-01 03:56:00 | 12.2 |
| 1900-01-01 03:57:00 | 10.8 |
| 1900-01-01 03:58:00 | 10.8 |
| 1900-01-01 03:59:00 | 21.2 |
| 1900-01-01 04:00:00 | 21.2 |
| 1900-01-01 04:01:00 | 13.3 |
| 1900-01-01 04:02:00 | 13.3 |
| 1900-01-01 04:03:00 | 13.3 |
| 1900-01-01 04:04:00 | 14.8 |
| 1900-01-01 04:05:00 | 14.8 |
| 1900-01-01 04:06:00 | 15.5 |
| 1900-01-01 04:07:00 | 15.5 |
| 1900-01-01 04:08:00 | 11.5 |
| 1900-01-01 04:09:00 | 11.5 |
| 1900-01-01 04:10:00 | 15.1 |
| 1900-01-01 04:11:00 | 15.1 |
| 1900-01-01 04:12:00 | 9.7 |
| 1900-01-01 04:13:00 | 9.7 |
| 1900-01-01 04:14:00 | 18 |
| 1900-01-01 04:15:00 | 18 |
| 1900-01-01 04:16:00 | 18 |
| 1900-01-01 04:17:00 | 18 |
| 1900-01-01 04:18:00 | 13.3 |
| 1900-01-01 04:19:00 | 13.3 |
| 1900-01-01 04:20:00 | 13 |
| 1900-01-01 04:21:00 | 13 |
| 1900-01-01 04:22:00 | 18.7 |
| 1900-01-01 04:23:00 | 18.7 |
| 1900-01-01 04:24:00 | 16.9 |
| 1900-01-01 04:25:00 | 16.9 |
| 1900-01-01 04:26:00 | 13.7 |
| 1900-01-01 04:27:00 | 13.7 |
| 1900-01-01 04:28:00 | 20.5 |
| 1900-01-01 04:29:00 | 20.5 |
| 1900-01-01 04:30:00 | 20.2 |
| 1900-01-01 04:31:00 | 20.2 |
| 1900-01-01 04:32:00 | 12.6 |
| 1900-01-01 04:33:00 | 12.6 |
| 1900-01-01 04:34:00 | 13.3 |
| 1900-01-01 04:35:00 | 13.3 |
| 1900-01-01 04:36:00 | 17.6 |
| 1900-01-01 04:37:00 | 17.6 |
| 1900-01-01 04:38:00 | 18 |
| 1900-01-01 04:39:00 | 18 |
| 1900-01-01 04:40:00 | 13.3 |
| 1900-01-01 04:41:00 | 13.3 |
| 1900-01-01 04:42:00 | 18 |
| 1900-01-01 04:43:00 | 18 |
| 1900-01-01 04:44:00 | 14 |
| 1900-01-01 04:45:00 | 14 |
| 1900-01-01 04:46:00 | 18 |
| 1900-01-01 04:47:00 | 18 |
| 1900-01-01 04:48:00 | 18.4 |
| 1900-01-01 04:49:00 | 18.4 |
| 1900-01-01 04:50:00 | 15.1 |
| 1900-01-01 04:51:00 | 15.1 |
| 1900-01-01 04:52:00 | 19.8 |
| 1900-01-01 04:53:00 | 19.8 |
| 1900-01-01 04:54:00 | 20.9 |
| 1900-01-01 04:55:00 | 20.9 |
| 1900-01-01 04:56:00 | 20.9 |
| 1900-01-01 04:57:00 | 15.5 |
| 1900-01-01 04:58:00 | 15.5 |
| 1900-01-01 04:59:00 | 18 |
| 1900-01-01 05:00:00 | 18 |
| 1900-01-01 05:01:00 | 18 |
| 1900-01-01 05:02:00 | 14.8 |
| 1900-01-01 05:03:00 | 14.8 |
| 1900-01-01 05:04:00 | 19.4 |
| 1900-01-01 05:05:00 | 19.4 |
| 1900-01-01 05:06:00 | 25.2 |
| 1900-01-01 05:07:00 | 25.2 |
| 1900-01-01 05:08:00 | 25.9 |
| 1900-01-01 05:09:00 | 25.9 |
| 1900-01-01 05:10:00 | 18 |
| 1900-01-01 05:11:00 | 18 |
| 1900-01-01 05:12:00 | 28.1 |
| 1900-01-01 05:13:00 | 28.1 |
| 1900-01-01 05:14:00 | 14.8 |
| 1900-01-01 05:15:00 | 14.8 |
| 1900-01-01 05:16:00 | 17.3 |
| 1900-01-01 05:17:00 | 17.3 |
| 1900-01-01 05:18:00 | 17.3 |
| 1900-01-01 05:19:00 | 17.3 |
| 1900-01-01 05:20:00 | 15.5 |
| 1900-01-01 05:21:00 | 15.5 |
| 1900-01-01 05:22:00 | 27 |
| 1900-01-01 05:23:00 | 27 |
| 1900-01-01 05:24:00 | 19.1 |
| 1900-01-01 05:25:00 | 19.1 |
| 1900-01-01 05:26:00 | 28.1 |
| 1900-01-01 05:27:00 | 28.1 |
| 1900-01-01 05:28:00 | 21.6 |
| 1900-01-01 05:29:00 | 21.6 |
| 1900-01-01 05:30:00 | 15.8 |
| 1900-01-01 05:31:00 | 15.8 |
| 1900-01-01 05:32:00 | 18 |
| 1900-01-01 05:33:00 | 25.9 |
| 1900-01-01 05:34:00 | 25.9 |
| 1900-01-01 05:35:00 | 16.6 |
| 1900-01-01 05:36:00 | 16.6 |
| 1900-01-01 05:37:00 | 27.4 |
| 1900-01-01 05:38:00 | 27.4 |
| 1900-01-01 05:39:00 | 28.8 |
| 1900-01-01 05:40:00 | 28.8 |
| 1900-01-01 05:41:00 | 27.4 |
| 1900-01-01 05:42:00 | 27.4 |
| 1900-01-01 05:43:00 | 21.2 |
| 1900-01-01 05:44:00 | 21.2 |
| 1900-01-01 05:45:00 | 24.5 |
| 1900-01-01 05:46:00 | 24.5 |
| 1900-01-01 05:47:00 | 22 |
| 1900-01-01 05:48:00 | 22 |
| 1900-01-01 05:49:00 | 16.6 |
| 1900-01-01 05:50:00 | 16.6 |
| 1900-01-01 05:51:00 | 15.5 |
| 1900-01-01 05:52:00 | 15.5 |
| 1900-01-01 05:53:00 | 25.2 |
| 1900-01-01 05:54:00 | 25.2 |
| 1900-01-01 05:55:00 | 18.4 |
| 1900-01-01 05:56:00 | 18.4 |
| 1900-01-01 05:57:00 | 18.4 |
| 1900-01-01 05:58:00 | 16.6 |
| 1900-01-01 05:59:00 | 16.6 |
| 1900-01-01 06:00:00 | 20.9 |
| 1900-01-01 06:01:00 | 20.9 |
| 1900-01-01 06:02:00 | 22 |
| 1900-01-01 06:03:00 | 22 |
| 1900-01-01 06:04:00 | 22 |
| 1900-01-01 06:05:00 | 22 |
| 1900-01-01 06:06:00 | 18.7 |
| 1900-01-01 06:07:00 | 18.7 |
| 1900-01-01 06:08:00 | 16.9 |
| 1900-01-01 06:09:00 | 16.9 |
| 1900-01-01 06:10:00 | 31.3 |
| 1900-01-01 06:11:00 | 31.3 |
| 1900-01-01 06:12:00 | 16.2 |
| 1900-01-01 06:13:00 | 16.2 |
| 1900-01-01 06:14:00 | 17.3 |
| 1900-01-01 06:15:00 | 17.3 |
| 1900-01-01 06:16:00 | 26.3 |
| 1900-01-01 06:17:00 | 26.3 |
| 1900-01-01 06:18:00 | 24.1 |
| 1900-01-01 06:19:00 | 24.1 |
| 1900-01-01 06:20:00 | 25.6 |
| 1900-01-01 06:21:00 | 25.6 |
| 1900-01-01 06:22:00 | 21.2 |
| 1900-01-01 06:23:00 | 21.2 |
| 1900-01-01 06:24:00 | 18 |
| 1900-01-01 06:25:00 | 18 |
| 1900-01-01 06:26:00 | 18.7 |
| 1900-01-01 06:27:00 | 29.2 |
| 1900-01-01 06:28:00 | 29.2 |
| 1900-01-01 06:29:00 | 28.1 |
| 1900-01-01 06:30:00 | 28.1 |
| 1900-01-01 06:31:00 | 25.6 |
| 1900-01-01 06:32:00 | 25.6 |
| 1900-01-01 06:33:00 | 17.6 |
| 1900-01-01 06:34:00 | 17.6 |
| 1900-01-01 06:35:00 | 26.6 |
| 1900-01-01 06:36:00 | 26.6 |
| 1900-01-01 06:37:00 | 16.2 |
| 1900-01-01 06:38:00 | 16.2 |
| 1900-01-01 06:39:00 | 14 |
| 1900-01-01 06:40:00 | 14 |
| 1900-01-01 06:41:00 | 29.5 |
| 1900-01-01 06:42:00 | 29.5 |
| 1900-01-01 06:43:00 | 21.6 |
| 1900-01-01 06:44:00 | 21.6 |
| 1900-01-01 06:45:00 | 14 |
| 1900-01-01 06:46:00 | 14 |
| 1900-01-01 06:47:00 | 24.1 |
| 1900-01-01 06:48:00 | 24.1 |
| 1900-01-01 06:49:00 | 21.2 |
| 1900-01-01 06:50:00 | 21.2 |
| 1900-01-01 06:51:00 | 21.2 |
| 1900-01-01 06:52:00 | 20.5 |
| 1900-01-01 06:53:00 | 20.5 |
| 1900-01-01 06:54:00 | 19.1 |
| 1900-01-01 06:55:00 | 19.1 |
| 1900-01-01 06:56:00 | 24.8 |
| 1900-01-01 06:57:00 | 24.8 |
| 1900-01-01 06:58:00 | 15.1 |
| 1900-01-01 06:59:00 | 15.1 |
| 1900-01-01 07:00:00 | 19.1 |
| 1900-01-01 07:01:00 | 19.1 |
| 1900-01-01 07:02:00 | 29.2 |
| 1900-01-01 07:03:00 | 29.2 |
| 1900-01-01 07:04:00 | 15.5 |
| 1900-01-01 07:05:00 | 15.5 |
| 1900-01-01 07:06:00 | 12.6 |
| 1900-01-01 07:07:00 | 12.6 |
| 1900-01-01 07:08:00 | 18.7 |
| 1900-01-01 07:09:00 | 18.7 |
| 1900-01-01 07:10:00 | 19.4 |
| 1900-01-01 07:11:00 | 19.4 |
| 1900-01-01 07:12:00 | 20.5 |
| 1900-01-01 07:13:00 | 20.5 |
| 1900-01-01 07:14:00 | 18.4 |
| 1900-01-01 07:15:00 | 18.4 |
| 1900-01-01 07:16:00 | 12.2 |
| 1900-01-01 07:17:00 | 12.2 |
| 1900-01-01 07:18:00 | 15.1 |
| 1900-01-01 07:19:00 | 19.1 |
| 1900-01-01 07:20:00 | 19.1 |
| 1900-01-01 07:21:00 | 14.8 |
| 1900-01-01 07:22:00 | 14.8 |
| 1900-01-01 07:23:00 | 11.5 |
| 1900-01-01 07:24:00 | 11.5 |
| 1900-01-01 07:25:00 | 14 |
| 1900-01-01 07:26:00 | 14 |
| 1900-01-01 07:27:00 | 13 |
| 1900-01-01 07:28:00 | 13 |
| 1900-01-01 07:29:00 | 14 |
| 1900-01-01 07:30:00 | 14 |
| 1900-01-01 07:31:00 | 21.6 |
| 1900-01-01 07:32:00 | 21.6 |
| 1900-01-01 07:33:00 | 9.7 |
| 1900-01-01 07:34:00 | 9.7 |
| 1900-01-01 07:35:00 | 17.6 |
| 1900-01-01 07:36:00 | 17.6 |
| 1900-01-01 07:37:00 | 22 |
| 1900-01-01 07:38:00 | 22 |
| 1900-01-01 07:39:00 | 16.2 |
| 1900-01-01 07:40:00 | 16.2 |
| 1900-01-01 07:41:00 | 10.8 |
| 1900-01-01 07:42:00 | 10.8 |
| 1900-01-01 07:43:00 | 17.3 |
| 1900-01-01 07:44:00 | 17.3 |
| 1900-01-01 07:45:00 | 17.3 |
| 1900-01-01 07:46:00 | 11.5 |
| 1900-01-01 07:47:00 | 11.5 |
| 1900-01-01 07:48:00 | 16.9 |
| 1900-01-01 07:49:00 | 16.9 |
| 1900-01-01 07:50:00 | 19.4 |
| 1900-01-01 07:51:00 | 19.4 |
| 1900-01-01 07:52:00 | 17.6 |
| 1900-01-01 07:53:00 | 17.6 |
| 1900-01-01 07:54:00 | 13.3 |
| 1900-01-01 07:55:00 | 13.3 |
| 1900-01-01 07:56:00 | 10.4 |
| 1900-01-01 07:57:00 | 10.4 |
| 1900-01-01 07:58:00 | 17.6 |
| 1900-01-01 07:59:00 | 17.6 |
| 1900-01-01 08:00:00 | 13.3 |
| 1900-01-01 08:01:00 | 13.3 |
| 1900-01-01 08:02:00 | 16.2 |
| 1900-01-01 08:03:00 | 16.2 |
| 1900-01-01 08:04:00 | 14.8 |
| 1900-01-01 08:05:00 | 14.8 |
| 1900-01-01 08:06:00 | 14 |
| 1900-01-01 08:07:00 | 14 |
| 1900-01-01 08:08:00 | 10.8 |
| 1900-01-01 08:09:00 | 10.8 |
| 1900-01-01 08:10:00 | 13.3 |
| 1900-01-01 08:11:00 | 13.3 |
| 1900-01-01 08:12:00 | 17.3 |
| 1900-01-01 08:13:00 | 17.3 |
| 1900-01-01 08:14:00 | 15.1 |
| 1900-01-01 08:15:00 | 15.1 |
| 1900-01-01 08:16:00 | 14.8 |
| 1900-01-01 08:17:00 | 15.1 |
| 1900-01-01 08:18:00 | 15.1 |
| 1900-01-01 08:19:00 | 16.2 |
| 1900-01-01 08:20:00 | 16.2 |
| 1900-01-01 08:21:00 | 16.6 |
| 1900-01-01 08:22:00 | 16.6 |
| 1900-01-01 08:23:00 | 17.3 |
| 1900-01-01 08:24:00 | 17.3 |
| 1900-01-01 08:25:00 | 10.1 |
| 1900-01-01 08:26:00 | 10.1 |
| 1900-01-01 08:27:00 | 22.7 |
| 1900-01-01 08:28:00 | 22.7 |
| 1900-01-01 08:29:00 | 16.2 |
| 1900-01-01 08:30:00 | 16.2 |
| 1900-01-01 08:31:00 | 23.4 |
| 1900-01-01 08:32:00 | 23.4 |
| 1900-01-01 08:33:00 | 27.7 |
| 1900-01-01 08:34:00 | 27.7 |
| 1900-01-01 08:35:00 | 23.4 |
| 1900-01-01 08:36:00 | 23.4 |
| 1900-01-01 08:37:00 | 24.8 |
| 1900-01-01 08:38:00 | 24.8 |
| 1900-01-01 08:39:00 | 19.4 |
| 1900-01-01 08:40:00 | 19.4 |
| 1900-01-01 08:41:00 | 19.4 |
| 1900-01-01 08:42:00 | 14 |
| 1900-01-01 08:43:00 | 14 |
| 1900-01-01 08:44:00 | 14.8 |
| 1900-01-01 08:45:00 | 14.8 |
| 1900-01-01 08:46:00 | 18.7 |
| 1900-01-01 08:47:00 | 18.7 |
| 1900-01-01 08:48:00 | 24.5 |
| 1900-01-01 08:49:00 | 24.5 |
| 1900-01-01 08:50:00 | 19.1 |
| 1900-01-01 08:51:00 | 19.1 |
| 1900-01-01 08:52:00 | 27 |
| 1900-01-01 08:53:00 | 27 |
| 1900-01-01 08:54:00 | 29.9 |
| 1900-01-01 08:55:00 | 29.9 |
| 1900-01-01 08:56:00 | 35.3 |
| 1900-01-01 08:57:00 | 35.3 |
| 1900-01-01 08:58:00 | 39.6 |
| 1900-01-01 08:59:00 | 39.6 |
| 1900-01-01 09:00:00 | 23 |
| 1900-01-01 09:01:00 | 23 |
| 1900-01-01 09:02:00 | 23.4 |
| 1900-01-01 09:03:00 | 23.4 |
| 1900-01-01 09:04:00 | 23 |
| 1900-01-01 09:05:00 | 23 |
| 1900-01-01 09:06:00 | 25.2 |
| 1900-01-01 09:07:00 | 25.2 |
| 1900-01-01 09:08:00 | 15.1 |
| 1900-01-01 09:09:00 | 11.9 |
| 1900-01-01 09:10:00 | 11.9 |
| 1900-01-01 09:11:00 | 22.7 |
| 1900-01-01 09:12:00 | 22.7 |
| 1900-01-01 09:13:00 | 20.5 |
| 1900-01-01 09:14:00 | 20.5 |
| 1900-01-01 09:15:00 | 18 |
| 1900-01-01 09:16:00 | 18 |
| 1900-01-01 09:17:00 | 24.5 |
| 1900-01-01 09:18:00 | 24.5 |
| 1900-01-01 09:19:00 | 16.6 |
| 1900-01-01 09:20:00 | 16.6 |
| 1900-01-01 09:21:00 | 20.5 |
| 1900-01-01 09:22:00 | 20.5 |
| 1900-01-01 09:23:00 | 20.2 |
| 1900-01-01 09:24:00 | 20.2 |
| 1900-01-01 09:25:00 | 11.5 |
| 1900-01-01 09:26:00 | 11.5 |
| 1900-01-01 09:27:00 | 12.2 |
| 1900-01-01 09:28:00 | 12.2 |
| 1900-01-01 09:29:00 | 12.2 |
| 1900-01-01 09:30:00 | 12.2 |
| 1900-01-01 09:31:00 | 14 |
| 1900-01-01 09:32:00 | 14 |
| 1900-01-01 09:33:00 | 5 |
| 1900-01-01 09:34:00 | 5 |
| 1900-01-01 09:35:00 | 5 |
| 1900-01-01 09:36:00 | 14 |
| 1900-01-01 09:37:00 | 14 |
| 1900-01-01 09:38:00 | 8.3 |
| 1900-01-01 09:39:00 | 8.3 |
| 1900-01-01 09:40:00 | 4.7 |
| 1900-01-01 09:41:00 | 4.7 |
| 1900-01-01 09:42:00 | 9.7 |
| 1900-01-01 09:43:00 | 9.7 |
| 1900-01-01 09:44:00 | 5.8 |
| 1900-01-01 09:45:00 | 5.8 |
| 1900-01-01 09:46:00 | 7.2 |
| 1900-01-01 09:47:00 | 7.2 |
| 1900-01-01 09:48:00 | 12.6 |
| 1900-01-01 09:49:00 | 12.6 |
| 1900-01-01 09:50:00 | 31 |
| 1900-01-01 09:51:00 | 31 |
| 1900-01-01 09:52:00 | 25.6 |
| 1900-01-01 09:53:00 | 25.6 |
| 1900-01-01 09:54:00 | 33.8 |
| 1900-01-01 09:55:00 | 33.8 |
| 1900-01-01 09:56:00 | 28.1 |
| 1900-01-01 09:57:00 | 28.1 |
| 1900-01-01 09:58:00 | 23.4 |
| 1900-01-01 09:59:00 | 23.4 |
| 1900-01-01 10:00:00 | 28.4 |
| 1900-01-01 10:01:00 | 28.4 |
| 1900-01-01 10:02:00 | 29.5 |
| 1900-01-01 10:03:00 | 29.5 |
| 1900-01-01 10:04:00 | 21.6 |
| 1900-01-01 10:05:00 | 22.7 |
| 1900-01-01 10:06:00 | 22.7 |
| 1900-01-01 10:07:00 | 15.5 |
| 1900-01-01 10:08:00 | 15.5 |
| 1900-01-01 10:09:00 | 41 |
| 1900-01-01 10:10:00 | 41 |
| 1900-01-01 10:11:00 | 35.6 |
| 1900-01-01 10:12:00 | 35.6 |
| 1900-01-01 10:13:00 | 32 |
| 1900-01-01 10:14:00 | 32 |
| 1900-01-01 10:15:00 | 29.5 |
| 1900-01-01 10:16:00 | 29.5 |
| 1900-01-01 10:17:00 | 32.8 |
| 1900-01-01 10:18:00 | 32.8 |
| 1900-01-01 10:19:00 | 46.1 |
| 1900-01-01 10:20:00 | 46.1 |
| 1900-01-01 10:21:00 | 36.7 |
| 1900-01-01 10:22:00 | 36.7 |
| 1900-01-01 10:23:00 | 43.6 |
| 1900-01-01 10:24:00 | 43.6 |
| 1900-01-01 10:25:00 | 38.9 |
| 1900-01-01 10:26:00 | 38.9 |
| 1900-01-01 10:27:00 | 38.9 |
| 1900-01-01 10:28:00 | 38.9 |
| 1900-01-01 10:29:00 | 31.3 |
| 1900-01-01 10:30:00 | 31.3 |
| 1900-01-01 10:31:00 | 31.3 |
| 1900-01-01 10:32:00 | 29.5 |
| 1900-01-01 10:33:00 | 29.5 |
| 1900-01-01 10:34:00 | 28.4 |
| 1900-01-01 10:35:00 | 28.4 |
| 1900-01-01 10:36:00 | 16.2 |
| 1900-01-01 10:37:00 | 16.2 |
| 1900-01-01 10:38:00 | 10.1 |
| 1900-01-01 10:39:00 | 10.1 |
| 1900-01-01 10:40:00 | 9 |
| 1900-01-01 10:41:00 | 9 |
| 1900-01-01 10:42:00 | 9.7 |
| 1900-01-01 10:43:00 | 9.7 |
| 1900-01-01 10:44:00 | 13.7 |
| 1900-01-01 10:45:00 | 13.7 |
| 1900-01-01 10:46:00 | 9 |
| 1900-01-01 10:47:00 | 9 |
| 1900-01-01 10:48:00 | 11.5 |
| 1900-01-01 10:49:00 | 11.5 |
| 1900-01-01 10:50:00 | 10.8 |
| 1900-01-01 10:51:00 | 10.8 |
| 1900-01-01 10:52:00 | 14 |
| 1900-01-01 10:53:00 | 14 |
| 1900-01-01 10:54:00 | 17.6 |
| 1900-01-01 10:55:00 | 17.6 |
| 1900-01-01 10:56:00 | 19.1 |
| 1900-01-01 10:57:00 | 19.1 |
| 1900-01-01 10:58:00 | 25.2 |
| 1900-01-01 10:59:00 | 25.2 |
| 1900-01-01 11:00:00 | 22 |
| 1900-01-01 11:01:00 | 16.6 |
| 1900-01-01 11:02:00 | 16.6 |
| 1900-01-01 11:03:00 | 18.7 |
| 1900-01-01 11:04:00 | 18.7 |
| 1900-01-01 11:05:00 | 16.2 |
| 1900-01-01 11:06:00 | 16.2 |
| 1900-01-01 11:07:00 | 25.6 |
| 1900-01-01 11:08:00 | 25.6 |
| 1900-01-01 11:09:00 | 19.1 |
| 1900-01-01 11:10:00 | 19.1 |
| 1900-01-01 11:11:00 | 37.4 |
| 1900-01-01 11:12:00 | 37.4 |
| 1900-01-01 11:13:00 | 14.4 |
| 1900-01-01 11:14:00 | 14.4 |
| 1900-01-01 11:15:00 | 18.4 |
| 1900-01-01 11:16:00 | 18.4 |
| 1900-01-01 11:17:00 | 17.3 |
| 1900-01-01 11:18:00 | 17.3 |
| 1900-01-01 11:19:00 | 46.1 |
| 1900-01-01 11:20:00 | 46.1 |
| 1900-01-01 11:21:00 | 37.4 |
| 1900-01-01 11:22:00 | 37.4 |
| 1900-01-01 11:23:00 | 59.4 |
| 1900-01-01 11:24:00 | 59.4 |
| 1900-01-01 11:25:00 | 59.4 |
| 1900-01-01 11:26:00 | 28.4 |
| 1900-01-01 11:27:00 | 28.4 |
| 1900-01-01 11:28:00 | 34.9 |
| 1900-01-01 11:29:00 | 34.9 |
| 1900-01-01 11:30:00 | 41.8 |
| 1900-01-01 11:31:00 | 41.8 |
| 1900-01-01 11:32:00 | 51.5 |
| 1900-01-01 11:33:00 | 51.5 |
| 1900-01-01 11:34:00 | 58 |
| 1900-01-01 11:35:00 | 58 |
| 1900-01-01 11:36:00 | 40.3 |
| 1900-01-01 11:37:00 | 40.3 |
| 1900-01-01 11:38:00 | 30.6 |
| 1900-01-01 11:39:00 | 30.6 |
| 1900-01-01 11:40:00 | 46.8 |
| 1900-01-01 11:41:00 | 46.8 |
| 1900-01-01 11:42:00 | 38.2 |
| 1900-01-01 11:43:00 | 38.2 |
| 1900-01-01 11:44:00 | 47.9 |
| 1900-01-01 11:45:00 | 47.9 |
| 1900-01-01 11:46:00 | 48.2 |
| 1900-01-01 11:47:00 | 48.2 |
| 1900-01-01 11:48:00 | 49.3 |
| 1900-01-01 11:49:00 | 49.3 |
| 1900-01-01 11:50:00 | 40 |
| 1900-01-01 11:51:00 | 40 |
| 1900-01-01 11:52:00 | 38.5 |
| 1900-01-01 11:53:00 | 38.5 |
| 1900-01-01 11:54:00 | 50.4 |
| 1900-01-01 11:55:00 | 50.4 |
| 1900-01-01 11:56:00 | 33.5 |
| 1900-01-01 11:57:00 | 41.4 |
| 1900-01-01 11:58:00 | 41.4 |
| 1900-01-01 11:59:00 | 33.8 |
| 1900-01-01 12:00:00 | 33.8 |
| 1900-01-01 12:01:00 | 33.8 |
| 1900-01-01 12:02:00 | 33.8 |
| 1900-01-01 12:03:00 | 33.8 |
| 1900-01-01 12:04:00 | 33.8 |
| 1900-01-01 12:05:00 | 33.8 |
| 1900-01-01 12:06:00 | 33.8 |
| 1900-01-01 12:07:00 | 33.8 |
| 1900-01-01 12:08:00 | 33.8 |
| 1900-01-01 12:09:00 | 47.2 |
| 1900-01-01 12:10:00 | 65.5 |
| 1900-01-01 12:11:00 | 65.5 |
| 1900-01-01 12:12:00 | 55.4 |
| 1900-01-01 12:13:00 | 55.4 |
| 1900-01-01 12:14:00 | 41 |
| 1900-01-01 12:15:00 | 41 |
| 1900-01-01 12:16:00 | 28.1 |
| 1900-01-01 12:17:00 | 28.1 |
| 1900-01-01 12:18:00 | 44.6 |
| 1900-01-01 12:19:00 | 44.6 |
| 1900-01-01 12:20:00 | 46.4 |
| 1900-01-01 12:21:00 | 46.4 |
| 1900-01-01 12:22:00 | 36.7 |
| 1900-01-01 12:23:00 | 66.2 |
| 1900-01-01 12:24:00 | 66.2 |
| 1900-01-01 12:25:00 | 62.3 |
| 1900-01-01 12:26:00 | 62.3 |
| 1900-01-01 12:27:00 | 47.2 |
| 1900-01-01 12:28:00 | 47.2 |
| 1900-01-01 12:29:00 | 48.2 |
| 1900-01-01 12:30:00 | 48.2 |
| 1900-01-01 12:31:00 | 31.7 |
| 1900-01-01 12:32:00 | 31.7 |
| 1900-01-01 12:33:00 | 56.2 |
| 1900-01-01 12:34:00 | 56.2 |
| 1900-01-01 12:35:00 | 57.2 |
| 1900-01-01 12:36:00 | 57.2 |
| 1900-01-01 12:37:00 | 49 |
| 1900-01-01 12:38:00 | 49 |
| 1900-01-01 12:39:00 | 46.8 |
| 1900-01-01 12:40:00 | 46.8 |
| 1900-01-01 12:41:00 | 43.9 |
| 1900-01-01 12:42:00 | 43.9 |
| 1900-01-01 12:43:00 | 64.4 |
| 1900-01-01 12:44:00 | 64.4 |
| 1900-01-01 12:45:00 | 60.8 |
| 1900-01-01 12:46:00 | 60.8 |
| 1900-01-01 12:47:00 | 36.7 |
| 1900-01-01 12:48:00 | 36.7 |
| 1900-01-01 12:49:00 | 36.7 |
| 1900-01-01 12:50:00 | 31 |
| 1900-01-01 12:51:00 | 31 |
| 1900-01-01 12:52:00 | 47.9 |
| 1900-01-01 12:53:00 | 47.9 |
| 1900-01-01 12:54:00 | 39.6 |
| 1900-01-01 12:55:00 | 39.6 |
| 1900-01-01 12:56:00 | 31.7 |
| 1900-01-01 12:57:00 | 31.7 |
| 1900-01-01 12:58:00 | 35.3 |
| 1900-01-01 12:59:00 | 35.3 |
| 1900-01-01 13:00:00 | 35.6 |
| 1900-01-01 13:01:00 | 35.6 |
| 1900-01-01 13:02:00 | 49 |
| 1900-01-01 13:03:00 | 49 |
| 1900-01-01 13:04:00 | 34.9 |
| 1900-01-01 13:05:00 | 34.9 |
| 1900-01-01 13:06:00 | 32.8 |
| 1900-01-01 13:07:00 | 32.8 |
| 1900-01-01 13:08:00 | 49.7 |
| 1900-01-01 13:09:00 | 49.7 |
| 1900-01-01 13:10:00 | 50 |
| 1900-01-01 13:11:00 | 50 |
| 1900-01-01 13:12:00 | 36 |
| 1900-01-01 13:13:00 | 36 |
| 1900-01-01 13:14:00 | 47.2 |
| 1900-01-01 13:15:00 | 47.2 |
| 1900-01-01 13:16:00 | 42.1 |
| 1900-01-01 13:17:00 | 42.1 |
| 1900-01-01 13:18:00 | 33.1 |
| 1900-01-01 13:19:00 | 58.3 |
| 1900-01-01 13:20:00 | 58.3 |
| 1900-01-01 13:21:00 | 38.5 |
| 1900-01-01 13:22:00 | 38.5 |
| 1900-01-01 13:23:00 | 61.2 |
| 1900-01-01 13:24:00 | 61.2 |
| 1900-01-01 13:25:00 | 33.1 |
| 1900-01-01 13:26:00 | 33.1 |
| 1900-01-01 13:27:00 | 25.2 |
| 1900-01-01 13:28:00 | 25.2 |
| 1900-01-01 13:29:00 | 40.7 |
| 1900-01-01 13:30:00 | 40.7 |
| 1900-01-01 13:31:00 | 21.2 |
| 1900-01-01 13:32:00 | 21.2 |
| 1900-01-01 13:33:00 | 36 |
| 1900-01-01 13:34:00 | 36 |
| 1900-01-01 13:35:00 | 34.6 |
| 1900-01-01 13:36:00 | 34.6 |
| 1900-01-01 13:37:00 | 45.7 |
| 1900-01-01 13:38:00 | 45.7 |
| 1900-01-01 13:39:00 | 27.7 |
| 1900-01-01 13:40:00 | 27.7 |
| 1900-01-01 13:41:00 | 21.6 |
| 1900-01-01 13:42:00 | 21.6 |
| 1900-01-01 13:43:00 | 24.8 |
| 1900-01-01 13:44:00 | 24.8 |
| 1900-01-01 13:45:00 | 24.8 |
| 1900-01-01 13:46:00 | 39.6 |
| 1900-01-01 13:47:00 | 39.6 |
| 1900-01-01 13:48:00 | 31.7 |
| 1900-01-01 13:49:00 | 31.7 |
| 1900-01-01 13:50:00 | 29.2 |
| 1900-01-01 13:51:00 | 29.2 |
| 1900-01-01 13:52:00 | 35.6 |
| 1900-01-01 13:53:00 | 35.6 |
| 1900-01-01 13:54:00 | 28.8 |
| 1900-01-01 13:55:00 | 28.8 |
| 1900-01-01 13:56:00 | 39.6 |
| 1900-01-01 13:57:00 | 39.6 |
| 1900-01-01 13:58:00 | 44.6 |
| 1900-01-01 13:59:00 | 44.6 |
| 1900-01-01 14:00:00 | 49.3 |
| 1900-01-01 14:01:00 | 49.3 |
| 1900-01-01 14:02:00 | 33.8 |
| 1900-01-01 14:03:00 | 33.8 |
| 1900-01-01 14:04:00 | 45 |
| 1900-01-01 14:05:00 | 45 |
| 1900-01-01 14:06:00 | 41 |
| 1900-01-01 14:07:00 | 41 |
| 1900-01-01 14:08:00 | 46.1 |
| 1900-01-01 14:09:00 | 46.1 |
| 1900-01-01 14:10:00 | 40 |
| 1900-01-01 14:11:00 | 40 |
| 1900-01-01 14:12:00 | 44.3 |
| 1900-01-01 14:13:00 | 44.3 |
| 1900-01-01 14:14:00 | 37.4 |
| 1900-01-01 14:15:00 | 37.4 |
| 1900-01-01 14:16:00 | 37.4 |
| 1900-01-01 14:17:00 | 51.5 |
| 1900-01-01 14:18:00 | 51.5 |
| 1900-01-01 14:19:00 | 61.9 |
| 1900-01-01 14:20:00 | 61.9 |
| 1900-01-01 14:21:00 | 57.6 |
| 1900-01-01 14:22:00 | 57.6 |
| 1900-01-01 14:23:00 | 58 |
| 1900-01-01 14:24:00 | 58 |
| 1900-01-01 14:25:00 | 33.8 |
| 1900-01-01 14:26:00 | 33.8 |
| 1900-01-01 14:27:00 | 29.5 |
| 1900-01-01 14:28:00 | 29.5 |
| 1900-01-01 14:29:00 | 40.3 |
| 1900-01-01 14:30:00 | 40.3 |
| 1900-01-01 14:31:00 | 42.8 |
| 1900-01-01 14:32:00 | 42.8 |
| 1900-01-01 14:33:00 | 51.8 |
| 1900-01-01 14:34:00 | 51.8 |
| 1900-01-01 14:35:00 | 31.3 |
| 1900-01-01 14:36:00 | 31.3 |
| 1900-01-01 14:37:00 | 28.4 |
| 1900-01-01 14:38:00 | 28.4 |
| 1900-01-01 14:39:00 | 28.4 |
| 1900-01-01 14:40:00 | 27 |
| 1900-01-01 14:41:00 | 27 |
| 1900-01-01 14:42:00 | 47.5 |
| 1900-01-01 14:43:00 | 47.5 |
| 1900-01-01 14:44:00 | 37.1 |
| 1900-01-01 14:45:00 | 37.1 |
| 1900-01-01 14:46:00 | 44.3 |
| 1900-01-01 14:47:00 | 44.3 |
| 1900-01-01 14:48:00 | 43.2 |
| 1900-01-01 14:49:00 | 43.2 |
| 1900-01-01 14:50:00 | 34.9 |
| 1900-01-01 14:51:00 | 34.9 |
| 1900-01-01 14:52:00 | 40.3 |
| 1900-01-01 14:53:00 | 40.3 |
| 1900-01-01 14:54:00 | 19.8 |
| 1900-01-01 14:55:00 | 19.8 |
| 1900-01-01 14:56:00 | 26.6 |
| 1900-01-01 14:57:00 | 26.6 |
| 1900-01-01 14:58:00 | 33.5 |
| 1900-01-01 14:59:00 | 33.5 |
| 1900-01-01 15:00:00 | 38.9 |
| 1900-01-01 15:01:00 | 38.9 |
| 1900-01-01 15:02:00 | 22.3 |
| 1900-01-01 15:03:00 | 22.3 |
| 1900-01-01 15:04:00 | 25.9 |
| 1900-01-01 15:05:00 | 25.9 |
| 1900-01-01 15:06:00 | 38.9 |
| 1900-01-01 15:07:00 | 38.9 |
| 1900-01-01 15:08:00 | 29.5 |
| 1900-01-01 15:09:00 | 29.5 |
| 1900-01-01 15:10:00 | 41.8 |
| 1900-01-01 15:11:00 | 36 |
| 1900-01-01 15:12:00 | 36 |
| 1900-01-01 15:13:00 | 17.6 |
| 1900-01-01 15:14:00 | 17.6 |
| 1900-01-01 15:15:00 | 33.8 |
| 1900-01-01 15:16:00 | 33.8 |
| 1900-01-01 15:17:00 | 61.9 |
| 1900-01-01 15:18:00 | 61.9 |
| 1900-01-01 15:19:00 | 46.4 |
| 1900-01-01 15:20:00 | 46.4 |
| 1900-01-01 15:21:00 | 40.3 |
| 1900-01-01 15:22:00 | 40.3 |
| 1900-01-01 15:23:00 | 31 |
| 1900-01-01 15:24:00 | 31 |
| 1900-01-01 15:25:00 | 38.5 |
| 1900-01-01 15:26:00 | 38.5 |
| 1900-01-01 15:27:00 | 37.8 |
| 1900-01-01 15:28:00 | 37.8 |
| 1900-01-01 15:29:00 | 16.9 |
| 1900-01-01 15:30:00 | 16.9 |
| 1900-01-01 15:31:00 | 32 |
| 1900-01-01 15:32:00 | 32 |
| 1900-01-01 15:33:00 | 20.2 |
| 1900-01-01 15:34:00 | 20.2 |
| 1900-01-01 15:35:00 | 20.2 |
| 1900-01-01 15:36:00 | 44.6 |
| 1900-01-01 15:37:00 | 44.6 |
| 1900-01-01 15:38:00 | 31.7 |
| 1900-01-01 15:39:00 | 31.7 |
| 1900-01-01 15:40:00 | 38.9 |
| 1900-01-01 15:41:00 | 38.9 |
| 1900-01-01 15:42:00 | 51.8 |
| 1900-01-01 15:43:00 | 51.8 |
| 1900-01-01 15:44:00 | 38.9 |
| 1900-01-01 15:45:00 | 38.9 |
| 1900-01-01 15:46:00 | 45 |
| 1900-01-01 15:47:00 | 45 |
| 1900-01-01 15:48:00 | 28.1 |
| 1900-01-01 15:49:00 | 28.1 |
| 1900-01-01 15:50:00 | 26.6 |
| 1900-01-01 15:51:00 | 26.6 |
| 1900-01-01 15:52:00 | 41.8 |
| 1900-01-01 15:53:00 | 41.8 |
| 1900-01-01 15:54:00 | 36.4 |
| 1900-01-01 15:55:00 | 36.4 |
| 1900-01-01 15:56:00 | 30.2 |
| 1900-01-01 15:57:00 | 30.2 |
| 1900-01-01 15:58:00 | 32 |
| 1900-01-01 15:59:00 | 32 |
| 1900-01-01 16:00:00 | 58.7 |
| 1900-01-01 16:01:00 | 58.7 |
| 1900-01-01 16:02:00 | 37.1 |
| 1900-01-01 16:03:00 | 37.1 |
| 1900-01-01 16:04:00 | 54.7 |
| 1900-01-01 16:05:00 | 37.1 |
| 1900-01-01 16:06:00 | 37.1 |
| 1900-01-01 16:07:00 | 41.4 |
| 1900-01-01 16:08:00 | 41.4 |
| 1900-01-01 16:09:00 | 33.5 |
| 1900-01-01 16:10:00 | 33.5 |
| 1900-01-01 16:11:00 | 31.7 |
| 1900-01-01 16:12:00 | 31.7 |
| 1900-01-01 16:13:00 | 34.9 |
| 1900-01-01 16:14:00 | 34.9 |
| 1900-01-01 16:15:00 | 30.6 |
| 1900-01-01 16:16:00 | 30.6 |
| 1900-01-01 16:17:00 | 30.6 |
| 1900-01-01 16:18:00 | 30.6 |
| 1900-01-01 16:19:00 | 40.7 |
| 1900-01-01 16:20:00 | 40.7 |
| 1900-01-01 16:21:00 | 40 |
| 1900-01-01 16:22:00 | 40 |
| 1900-01-01 16:23:00 | 34.9 |
| 1900-01-01 16:24:00 | 34.9 |
| 1900-01-01 16:25:00 | 34.2 |
| 1900-01-01 16:26:00 | 34.2 |
| 1900-01-01 16:27:00 | 35.6 |
| 1900-01-01 16:28:00 | 35.6 |
| 1900-01-01 16:29:00 | 35.6 |
| 1900-01-01 16:30:00 | 41 |
| 1900-01-01 16:31:00 | 41 |
| 1900-01-01 16:32:00 | 37.8 |
| 1900-01-01 16:33:00 | 37.8 |
| 1900-01-01 16:34:00 | 21.2 |
| 1900-01-01 16:35:00 | 21.2 |
| 1900-01-01 16:36:00 | 45.7 |
| 1900-01-01 16:37:00 | 45.7 |
| 1900-01-01 16:38:00 | 41.4 |
| 1900-01-01 16:39:00 | 41.4 |
| 1900-01-01 16:40:00 | 38.9 |
| 1900-01-01 16:41:00 | 38.9 |
| 1900-01-01 16:42:00 | 28.4 |
| 1900-01-01 16:43:00 | 28.4 |
| 1900-01-01 16:44:00 | 28.4 |
| 1900-01-01 16:45:00 | 28.4 |
| 1900-01-01 16:46:00 | 44.3 |
| 1900-01-01 16:47:00 | 44.3 |
| 1900-01-01 16:48:00 | 47.5 |
| 1900-01-01 16:49:00 | 47.5 |
| 1900-01-01 16:50:00 | 40.3 |
| 1900-01-01 16:51:00 | 40.3 |
| 1900-01-01 16:52:00 | 63 |
| 1900-01-01 16:53:00 | 63 |
| 1900-01-01 16:54:00 | 42.5 |
| 1900-01-01 16:55:00 | 42.5 |
| 1900-01-01 16:56:00 | 35.6 |
| 1900-01-01 16:57:00 | 35.6 |
| 1900-01-01 16:58:00 | 33.8 |
| 1900-01-01 16:59:00 | 33.8 |
| 1900-01-01 17:00:00 | 31 |
| 1900-01-01 17:01:00 | 29.2 |
| 1900-01-01 17:02:00 | 29.2 |
| 1900-01-01 17:03:00 | 42.5 |
| 1900-01-01 17:04:00 | 42.5 |
| 1900-01-01 17:05:00 | 40.7 |
| 1900-01-01 17:06:00 | 40.7 |
| 1900-01-01 17:07:00 | 16.6 |
| 1900-01-01 17:08:00 | 16.6 |
| 1900-01-01 17:09:00 | 23 |
| 1900-01-01 17:10:00 | 23 |
| 1900-01-01 17:11:00 | 16.9 |
| 1900-01-01 17:12:00 | 16.9 |
| 1900-01-01 17:13:00 | 28.4 |
| 1900-01-01 17:14:00 | 28.4 |
| 1900-01-01 17:15:00 | 23 |
| 1900-01-01 17:16:00 | 23 |
| 1900-01-01 17:17:00 | 25.2 |
| 1900-01-01 17:18:00 | 25.2 |
| 1900-01-01 17:19:00 | 28.8 |
| 1900-01-01 17:20:00 | 28.8 |
| 1900-01-01 17:21:00 | 28.1 |
| 1900-01-01 17:22:00 | 28.1 |
| 1900-01-01 17:23:00 | 21.2 |
| 1900-01-01 17:24:00 | 21.2 |
| 1900-01-01 17:25:00 | 21.2 |
| 1900-01-01 17:26:00 | 13.7 |
| 1900-01-01 17:27:00 | 13.7 |
| 1900-01-01 17:28:00 | 15.1 |
| 1900-01-01 17:29:00 | 15.1 |
| 1900-01-01 17:30:00 | 26.6 |
| 1900-01-01 17:31:00 | 26.6 |
| 1900-01-01 17:32:00 | 22.3 |
| 1900-01-01 17:33:00 | 22.3 |
| 1900-01-01 17:34:00 | 25.9 |
| 1900-01-01 17:35:00 | 25.9 |
| 1900-01-01 17:36:00 | 28.4 |
| 1900-01-01 17:37:00 | 28.4 |
| 1900-01-01 17:38:00 | 17.6 |
| 1900-01-01 17:39:00 | 17.6 |
| 1900-01-01 17:40:00 | 17.6 |
| 1900-01-01 17:41:00 | 17.6 |
| 1900-01-01 17:42:00 | 21.6 |
| 1900-01-01 17:43:00 | 21.6 |
| 1900-01-01 17:44:00 | 23.4 |
| 1900-01-01 17:45:00 | 23.4 |
| 1900-01-01 17:46:00 | 24.5 |
| 1900-01-01 17:47:00 | 24.5 |
| 1900-01-01 17:48:00 | 25.2 |
| 1900-01-01 17:49:00 | 25.2 |
| 1900-01-01 17:50:00 | 31.7 |
| 1900-01-01 17:51:00 | 31.7 |
| 1900-01-01 17:52:00 | 15.1 |
| 1900-01-01 17:53:00 | 15.1 |
| 1900-01-01 17:54:00 | 27.7 |
| 1900-01-01 17:55:00 | 27.7 |
| 1900-01-01 17:56:00 | 25.9 |
| 1900-01-01 17:57:00 | 7.6 |
| 1900-01-01 17:58:00 | 7.6 |
| 1900-01-01 17:59:00 | 17.6 |
| 1900-01-01 18:00:00 | 17.6 |
| 1900-01-01 18:01:00 | 11.9 |
| 1900-01-01 18:02:00 | 11.9 |
| 1900-01-01 18:03:00 | 10.4 |
| 1900-01-01 18:04:00 | 10.4 |
| 1900-01-01 18:05:00 | 12.6 |
| 1900-01-01 18:06:00 | 12.6 |
| 1900-01-01 18:07:00 | 9.4 |
| 1900-01-01 18:08:00 | 9.4 |
| 1900-01-01 18:09:00 | 12.6 |
| 1900-01-01 18:10:00 | 12.6 |
| 1900-01-01 18:11:00 | 8.6 |
| 1900-01-01 18:12:00 | 8.6 |
| 1900-01-01 18:13:00 | 18.7 |
| 1900-01-01 18:14:00 | 18.7 |
| 1900-01-01 18:15:00 | 16.2 |
| 1900-01-01 18:16:00 | 16.2 |
| 1900-01-01 18:17:00 | 15.5 |
| 1900-01-01 18:18:00 | 15.5 |
| 1900-01-01 18:19:00 | 15.5 |
| 1900-01-01 18:20:00 | 8.6 |
| 1900-01-01 18:21:00 | 8.6 |
| 1900-01-01 18:22:00 | 29.2 |
| 1900-01-01 18:23:00 | 29.2 |
| 1900-01-01 18:24:00 | 27.7 |
| 1900-01-01 18:25:00 | 27.7 |
| 1900-01-01 18:26:00 | 23 |
| 1900-01-01 18:27:00 | 23 |
| 1900-01-01 18:28:00 | 35.3 |
| 1900-01-01 18:29:00 | 35.3 |
| 1900-01-01 18:30:00 | 30.6 |
| 1900-01-01 18:31:00 | 30.6 |
| 1900-01-01 18:32:00 | 31 |
| 1900-01-01 18:33:00 | 31 |
| 1900-01-01 18:34:00 | 37.1 |
| 1900-01-01 18:35:00 | 37.1 |
| 1900-01-01 18:36:00 | 26.6 |
| 1900-01-01 18:37:00 | 26.6 |
| 1900-01-01 18:38:00 | 43.2 |
| 1900-01-01 18:39:00 | 43.2 |
| 1900-01-01 18:40:00 | 32.4 |
| 1900-01-01 18:41:00 | 32.4 |
| 1900-01-01 18:42:00 | 35.3 |
| 1900-01-01 18:43:00 | 35.3 |
| 1900-01-01 18:44:00 | 42.5 |
| 1900-01-01 18:45:00 | 42.5 |
| 1900-01-01 18:46:00 | 23 |
| 1900-01-01 18:47:00 | 23 |
| 1900-01-01 18:48:00 | 38.5 |
| 1900-01-01 18:49:00 | 38.5 |
| 1900-01-01 18:50:00 | 37.4 |
| 1900-01-01 18:51:00 | 50.4 |
| 1900-01-01 18:52:00 | 50.4 |
| 1900-01-01 18:53:00 | 49 |
| 1900-01-01 18:54:00 | 49 |
| 1900-01-01 18:55:00 | 22 |
| 1900-01-01 18:56:00 | 22 |
| 1900-01-01 18:57:00 | 28.8 |
| 1900-01-01 18:58:00 | 28.8 |
| 1900-01-01 18:59:00 | 20.5 |
| 1900-01-01 19:00:00 | 20.5 |
| 1900-01-01 19:01:00 | 27 |
| 1900-01-01 19:02:00 | 27 |
| 1900-01-01 19:03:00 | 28.4 |
| 1900-01-01 19:04:00 | 28.4 |
| 1900-01-01 19:05:00 | 38.5 |
| 1900-01-01 19:06:00 | 38.5 |
| 1900-01-01 19:07:00 | 31.7 |
| 1900-01-01 19:08:00 | 31.7 |
| 1900-01-01 19:09:00 | 36.4 |
| 1900-01-01 19:10:00 | 36.4 |
| 1900-01-01 19:11:00 | 24.1 |
| 1900-01-01 19:12:00 | 24.1 |
| 1900-01-01 19:13:00 | 17.3 |
| 1900-01-01 19:14:00 | 17.3 |
| 1900-01-01 19:15:00 | 17.3 |
| 1900-01-01 19:16:00 | 24.8 |
| 1900-01-01 19:17:00 | 24.8 |
| 1900-01-01 19:18:00 | 27.4 |
| 1900-01-01 19:19:00 | 27.4 |
| 1900-01-01 19:20:00 | 37.8 |
| 1900-01-01 19:21:00 | 37.8 |
| 1900-01-01 19:22:00 | 24.5 |
| 1900-01-01 19:23:00 | 24.5 |
| 1900-01-01 19:24:00 | 23.4 |
| 1900-01-01 19:25:00 | 23.4 |
| 1900-01-01 19:26:00 | 25.2 |
| 1900-01-01 19:27:00 | 25.2 |
| 1900-01-01 19:28:00 | 24.8 |
| 1900-01-01 19:29:00 | 24.8 |
| 1900-01-01 19:30:00 | 25.2 |
| 1900-01-01 19:31:00 | 25.2 |
| 1900-01-01 19:32:00 | 15.5 |
| 1900-01-01 19:33:00 | 15.5 |
| 1900-01-01 19:34:00 | 20.5 |
| 1900-01-01 19:35:00 | 20.5 |
| 1900-01-01 19:36:00 | 36 |
| 1900-01-01 19:37:00 | 36 |
| 1900-01-01 19:38:00 | 24.1 |
| 1900-01-01 19:39:00 | 24.1 |
| 1900-01-01 19:40:00 | 17.3 |
| 1900-01-01 19:41:00 | 17.3 |
| 1900-01-01 19:42:00 | 15.8 |
| 1900-01-01 19:43:00 | 15.8 |
| 1900-01-01 19:44:00 | 31.3 |
| 1900-01-01 19:45:00 | 23.4 |
| 1900-01-01 19:46:00 | 23.4 |
| 1900-01-01 19:47:00 | 18.7 |
| 1900-01-01 19:48:00 | 18.7 |
| 1900-01-01 19:49:00 | 15.8 |
| 1900-01-01 19:50:00 | 15.8 |
| 1900-01-01 19:51:00 | 21.2 |
| 1900-01-01 19:52:00 | 21.2 |
| 1900-01-01 19:53:00 | 18.4 |
| 1900-01-01 19:54:00 | 18.4 |
| 1900-01-01 19:55:00 | 26.6 |
| 1900-01-01 19:56:00 | 26.6 |
| 1900-01-01 19:57:00 | 22 |
| 1900-01-01 19:58:00 | 22 |
| 1900-01-01 19:59:00 | 24.1 |
| 1900-01-01 20:00:00 | 24.1 |
| 1900-01-01 20:01:00 | 14.4 |
| 1900-01-01 20:02:00 | 14.4 |
| 1900-01-01 20:03:00 | 25.6 |
| 1900-01-01 20:04:00 | 25.6 |
| 1900-01-01 20:05:00 | 26.6 |
| 1900-01-01 20:06:00 | 26.6 |
| 1900-01-01 20:07:00 | 17.3 |
| 1900-01-01 20:08:00 | 17.3 |
| 1900-01-01 20:09:00 | 22.3 |
| 1900-01-01 20:10:00 | 22.3 |
| 1900-01-01 20:11:00 | 22.3 |
| 1900-01-01 20:12:00 | 25.6 |
| 1900-01-01 20:13:00 | 25.6 |
| 1900-01-01 20:14:00 | 31 |
| 1900-01-01 20:15:00 | 31 |
| 1900-01-01 20:16:00 | 33.1 |
| 1900-01-01 20:17:00 | 33.1 |
| 1900-01-01 20:18:00 | 17.6 |
| 1900-01-01 20:19:00 | 17.6 |
| 1900-01-01 20:20:00 | 22.7 |
| 1900-01-01 20:21:00 | 22.7 |
| 1900-01-01 20:22:00 | 24.5 |
| 1900-01-01 20:23:00 | 24.5 |
| 1900-01-01 20:24:00 | 23.8 |
| 1900-01-01 20:25:00 | 23.8 |
| 1900-01-01 20:26:00 | 15.5 |
| 1900-01-01 20:27:00 | 15.5 |
| 1900-01-01 20:28:00 | 28.1 |
| 1900-01-01 20:29:00 | 28.1 |
| 1900-01-01 20:30:00 | 29.9 |
| 1900-01-01 20:31:00 | 29.9 |
| 1900-01-01 20:32:00 | 22 |
| 1900-01-01 20:33:00 | 22 |
| 1900-01-01 20:34:00 | 22.3 |
| 1900-01-01 20:35:00 | 22.3 |
| 1900-01-01 20:36:00 | 23 |
| 1900-01-01 20:37:00 | 23 |
| 1900-01-01 20:38:00 | 18 |
| 1900-01-01 20:39:00 | 18 |
| 1900-01-01 20:40:00 | 19.1 |
| 1900-01-01 20:41:00 | 20.5 |
| 1900-01-01 20:42:00 | 20.5 |
| 1900-01-01 20:43:00 | 20.2 |
| 1900-01-01 20:44:00 | 20.2 |
| 1900-01-01 20:45:00 | 29.5 |
| 1900-01-01 20:46:00 | 29.5 |
| 1900-01-01 20:47:00 | 24.1 |
| 1900-01-01 20:48:00 | 24.1 |
| 1900-01-01 20:49:00 | 23.4 |
| 1900-01-01 20:50:00 | 23.4 |
| 1900-01-01 20:51:00 | 20.5 |
| 1900-01-01 20:52:00 | 20.5 |
| 1900-01-01 20:53:00 | 17.6 |
| 1900-01-01 20:54:00 | 17.6 |
| 1900-01-01 20:55:00 | 27 |
| 1900-01-01 20:56:00 | 27 |
| 1900-01-01 20:57:00 | 31 |
| 1900-01-01 20:58:00 | 31 |
| 1900-01-01 20:59:00 | 36.7 |
| 1900-01-01 21:00:00 | 36.7 |
| 1900-01-01 21:01:00 | 13.7 |
| 1900-01-01 21:02:00 | 13.7 |
| 1900-01-01 21:03:00 | 24.1 |
| 1900-01-01 21:04:00 | 24.1 |
| 1900-01-01 21:05:00 | 23 |
| 1900-01-01 21:06:00 | 23 |
| 1900-01-01 21:07:00 | 23 |
| 1900-01-01 21:08:00 | 28.1 |
| 1900-01-01 21:09:00 | 28.1 |
| 1900-01-01 21:10:00 | 21.6 |
| 1900-01-01 21:11:00 | 21.6 |
| 1900-01-01 21:12:00 | 18.7 |
| 1900-01-01 21:13:00 | 18.7 |
| 1900-01-01 21:14:00 | 25.9 |
| 1900-01-01 21:15:00 | 25.9 |
| 1900-01-01 21:16:00 | 19.1 |
| 1900-01-01 21:17:00 | 19.1 |
| 1900-01-01 21:18:00 | 33.8 |
| 1900-01-01 21:19:00 | 33.8 |
| 1900-01-01 21:20:00 | 34.6 |
| 1900-01-01 21:21:00 | 34.6 |
| 1900-01-01 21:22:00 | 36 |
| 1900-01-01 21:23:00 | 36 |
| 1900-01-01 21:24:00 | 25.6 |
| 1900-01-01 21:25:00 | 25.6 |
| 1900-01-01 21:26:00 | 20.9 |
| 1900-01-01 21:27:00 | 20.9 |
| 1900-01-01 21:28:00 | 31 |
| 1900-01-01 21:29:00 | 31 |
| 1900-01-01 21:30:00 | 16.6 |
| 1900-01-01 21:31:00 | 16.6 |
| 1900-01-01 21:32:00 | 30.6 |
| 1900-01-01 21:33:00 | 30.6 |
| 1900-01-01 21:34:00 | 37.1 |
| 1900-01-01 21:35:00 | 50 |
| 1900-01-01 21:36:00 | 50 |
| 1900-01-01 21:37:00 | 23.4 |
| 1900-01-01 21:38:00 | 23.4 |
| 1900-01-01 21:39:00 | 24.1 |
| 1900-01-01 21:40:00 | 24.1 |
| 1900-01-01 21:41:00 | 38.2 |
| 1900-01-01 21:42:00 | 38.2 |
| 1900-01-01 21:43:00 | 29.2 |
| 1900-01-01 21:44:00 | 29.2 |
| 1900-01-01 21:45:00 | 27.4 |
| 1900-01-01 21:46:00 | 27.4 |
| 1900-01-01 21:47:00 | 30.6 |
| 1900-01-01 21:48:00 | 30.6 |
| 1900-01-01 21:49:00 | 23.4 |
| 1900-01-01 21:50:00 | 23.4 |
| 1900-01-01 21:51:00 | 43.2 |
| 1900-01-01 21:52:00 | 43.2 |
| 1900-01-01 21:53:00 | 25.6 |
| 1900-01-01 21:54:00 | 25.6 |
| 1900-01-01 21:55:00 | 25.2 |
| 1900-01-01 21:56:00 | 25.2 |
| 1900-01-01 21:57:00 | 36.4 |
| 1900-01-01 21:58:00 | 36.4 |
| 1900-01-01 21:59:00 | 41 |
| 1900-01-01 22:00:00 | 41 |
| 1900-01-01 22:01:00 | 41 |
| 1900-01-01 22:02:00 | 16.6 |
| 1900-01-01 22:03:00 | 16.6 |
| 1900-01-01 22:04:00 | 34.2 |
| 1900-01-01 22:05:00 | 34.2 |
| 1900-01-01 22:06:00 | 33.5 |
| 1900-01-01 22:07:00 | 33.5 |
| 1900-01-01 22:08:00 | 28.4 |
| 1900-01-01 22:09:00 | 28.4 |
| 1900-01-01 22:10:00 | 24.5 |
| 1900-01-01 22:11:00 | 24.5 |
| 1900-01-01 22:12:00 | 24.1 |
| 1900-01-01 22:13:00 | 24.1 |
| 1900-01-01 22:14:00 | 27.7 |
| 1900-01-01 22:15:00 | 27.7 |
| 1900-01-01 22:16:00 | 22.7 |
| 1900-01-01 22:17:00 | 22.7 |
| 1900-01-01 22:18:00 | 32.8 |
| 1900-01-01 22:19:00 | 32.8 |
| 1900-01-01 22:20:00 | 16.6 |
| 1900-01-01 22:21:00 | 16.6 |
| 1900-01-01 22:22:00 | 17.3 |
| 1900-01-01 22:23:00 | 17.3 |
| 1900-01-01 22:24:00 | 22 |
| 1900-01-01 22:25:00 | 22 |
| 1900-01-01 22:26:00 | 24.5 |
| 1900-01-01 22:27:00 | 24.5 |
| 1900-01-01 22:28:00 | 24.8 |
| 1900-01-01 22:29:00 | 24.8 |
| 1900-01-01 22:30:00 | 21.6 |
| 1900-01-01 22:31:00 | 20.9 |
| 1900-01-01 22:32:00 | 20.9 |
| 1900-01-01 22:33:00 | 19.8 |
| 1900-01-01 22:34:00 | 19.8 |
| 1900-01-01 22:35:00 | 17.6 |
| 1900-01-01 22:36:00 | 17.6 |
| 1900-01-01 22:37:00 | 14.8 |
| 1900-01-01 22:38:00 | 14.8 |
| 1900-01-01 22:39:00 | 12.2 |
| 1900-01-01 22:40:00 | 12.2 |
| 1900-01-01 22:41:00 | 12.2 |
| 1900-01-01 22:42:00 | 12.2 |
| 1900-01-01 22:43:00 | 18.7 |
| 1900-01-01 22:44:00 | 18.7 |
| 1900-01-01 22:45:00 | 15.1 |
| 1900-01-01 22:46:00 | 15.1 |
| 1900-01-01 22:47:00 | 18.7 |
| 1900-01-01 22:48:00 | 18.7 |
| 1900-01-01 22:49:00 | 17.6 |
| 1900-01-01 22:50:00 | 17.6 |
| 1900-01-01 22:51:00 | 18 |
| 1900-01-01 22:52:00 | 18 |
| 1900-01-01 22:53:00 | 16.2 |
| 1900-01-01 22:54:00 | 16.2 |
| 1900-01-01 22:55:00 | 16.2 |
| 1900-01-01 22:56:00 | 15.5 |
| 1900-01-01 22:57:00 | 15.5 |
| 1900-01-01 22:58:00 | 13.3 |
| 1900-01-01 22:59:00 | 13.3 |
| 1900-01-01 23:00:00 | 21.2 |
| 1900-01-01 23:01:00 | 21.2 |
| 1900-01-01 23:02:00 | 21.2 |
| 1900-01-01 23:03:00 | 21.2 |
| 1900-01-01 23:04:00 | 15.5 |
| 1900-01-01 23:05:00 | 15.5 |
| 1900-01-01 23:06:00 | 7.9 |
| 1900-01-01 23:07:00 | 7.9 |
| 1900-01-01 23:08:00 | 18.7 |
| 1900-01-01 23:09:00 | 18.7 |
| 1900-01-01 23:10:00 | 9.7 |
| 1900-01-01 23:11:00 | 9.7 |
| 1900-01-01 23:12:00 | 11.5 |
| 1900-01-01 23:13:00 | 11.5 |
| 1900-01-01 23:14:00 | 15.5 |
| 1900-01-01 23:15:00 | 15.5 |
| 1900-01-01 23:16:00 | 17.6 |
| 1900-01-01 23:17:00 | 17.6 |
| 1900-01-01 23:18:00 | 22.3 |
| 1900-01-01 23:19:00 | 22.3 |
| 1900-01-01 23:20:00 | 16.2 |
| 1900-01-01 23:21:00 | 16.2 |
| 1900-01-01 23:22:00 | 15.1 |
| 1900-01-01 23:23:00 | 15.1 |
| 1900-01-01 23:24:00 | 24.1 |
| 1900-01-01 23:25:00 | 24.1 |
| 1900-01-01 23:26:00 | 14.8 |
| 1900-01-01 23:27:00 | 16.6 |
| 1900-01-01 23:28:00 | 16.6 |
| 1900-01-01 23:29:00 | 17.3 |
| 1900-01-01 23:30:00 | 17.3 |
| 1900-01-01 23:31:00 | 26.6 |
| 1900-01-01 23:32:00 | 26.6 |
| 1900-01-01 23:33:00 | 20.2 |
| 1900-01-01 23:34:00 | 20.2 |
| 1900-01-01 23:35:00 | 21.6 |
| 1900-01-01 23:36:00 | 21.6 |
| 1900-01-01 23:37:00 | 15.1 |
| 1900-01-01 23:38:00 | 15.1 |
| 1900-01-01 23:39:00 | 18 |
| 1900-01-01 23:40:00 | 18 |
| 1900-01-01 23:41:00 | 13.3 |
| 1900-01-01 23:42:00 | 13.3 |
| 1900-01-01 23:43:00 | 20.2 |
| 1900-01-01 23:44:00 | 20.2 |
| 1900-01-01 23:45:00 | 15.5 |
| 1900-01-01 23:46:00 | 15.5 |
| 1900-01-01 23:47:00 | 24.1 |
| 1900-01-01 23:48:00 | 24.1 |
| 1900-01-01 23:49:00 | 15.1 |
| 1900-01-01 23:50:00 | 15.1 |
| 1900-01-01 23:51:00 | 15.1 |
| 1900-01-01 23:52:00 | 13.3 |
| 1900-01-01 23:53:00 | 13.3 |
| 1900-01-01 23:54:00 | 16.2 |
| 1900-01-01 23:55:00 | 16.2 |
| 1900-01-01 23:56:00 | 11.5 |
| 1900-01-01 23:57:00 | 11.5 |
| 1900-01-01 23:58:00 | 18.7 |
| 1900-01-01 23:59:00 | 18.7 |
| 1900-01-02 | 18.7 |
| 1900-01-02 00:01:00 | 18.7 |
| 1900-01-02 00:02:00 | 19.1 |
| 1900-01-02 00:03:00 | 19.1 |
| 1900-01-02 00:04:00 | 19.1 |
| 1900-01-02 00:05:00 | 19.1 |
| 1900-01-02 00:06:00 | 19.1 |
| 1900-01-02 00:07:00 | 19.1 |
| 1900-01-02 00:08:00 | 20.5 |
| 1900-01-02 00:09:00 | 20.5 |
| 1900-01-02 00:10:00 | 17.6 |
| 1900-01-02 00:11:00 | 17.6 |
| 1900-01-02 00:12:00 | 10.8 |
| 1900-01-02 00:13:00 | 10.8 |
| 1900-01-02 00:14:00 | 10.8 |
| 1900-01-02 00:15:00 | 10.8 |
| 1900-01-02 00:16:00 | 11.5 |
| 1900-01-02 00:17:00 | 11.5 |
| 1900-01-02 00:18:00 | 10.4 |
| 1900-01-02 00:19:00 | 10.4 |
| 1900-01-02 00:20:00 | 12.6 |
| 1900-01-02 00:21:00 | 12.6 |
| 1900-01-02 00:22:00 | 10.8 |
| 1900-01-02 00:23:00 | 13.3 |
| 1900-01-02 00:24:00 | 13.3 |
| 1900-01-02 00:25:00 | 16.6 |
| 1900-01-02 00:26:00 | 16.6 |
| 1900-01-02 00:27:00 | 13.3 |
| 1900-01-02 00:28:00 | 13.3 |
| 1900-01-02 00:29:00 | 14.8 |
| 1900-01-02 00:30:00 | 14.8 |
| 1900-01-02 00:31:00 | 11.2 |
| 1900-01-02 00:32:00 | 11.2 |
| 1900-01-02 00:33:00 | 7.9 |
| 1900-01-02 00:34:00 | 7.9 |
| 1900-01-02 00:35:00 | 10.8 |
| 1900-01-02 00:36:00 | 10.8 |
| 1900-01-02 00:37:00 | 12.2 |
| 1900-01-02 00:38:00 | 12.2 |
| 1900-01-02 00:39:00 | 9.4 |
| 1900-01-02 00:40:00 | 9.4 |
| 1900-01-02 00:41:00 | 11.5 |
| 1900-01-02 00:42:00 | 11.5 |
| 1900-01-02 00:43:00 | 12.2 |
| 1900-01-02 00:44:00 | 12.2 |
| 1900-01-02 00:45:00 | 13.7 |
| 1900-01-02 00:46:00 | 13.7 |
| 1900-01-02 00:47:00 | 13.7 |
| 1900-01-02 00:48:00 | 9.7 |
| 1900-01-02 00:49:00 | 9.7 |
| 1900-01-02 00:50:00 | 15.1 |
| 1900-01-02 00:51:00 | 15.1 |
| 1900-01-02 00:52:00 | 18.7 |
| 1900-01-02 00:53:00 | 18.7 |
| 1900-01-02 00:54:00 | 17.3 |
| 1900-01-02 00:55:00 | 17.3 |
| 1900-01-02 00:56:00 | 15.5 |
| 1900-01-02 00:57:00 | 15.5 |
| 1900-01-02 00:58:00 | 13.7 |
| 1900-01-02 00:59:00 | 13.7 |
| 1900-01-02 01:00:00 | 17.6 |
| 1900-01-02 01:01:00 | 17.6 |
| 1900-01-02 01:02:00 | 15.5 |
| 1900-01-02 01:03:00 | 15.5 |
| 1900-01-02 01:04:00 | 14 |
| 1900-01-02 01:05:00 | 14 |
| 1900-01-02 01:06:00 | 14 |
| 1900-01-02 01:07:00 | 14 |
| 1900-01-02 01:08:00 | 14.8 |
| 1900-01-02 01:09:00 | 14.8 |
| 1900-01-02 01:10:00 | 9.7 |
| 1900-01-02 01:11:00 | 9.7 |
| 1900-01-02 01:12:00 | 13.3 |
| 1900-01-02 01:13:00 | 13.3 |
| 1900-01-02 01:14:00 | 14.8 |
| 1900-01-02 01:15:00 | 14.8 |
| 1900-01-02 01:16:00 | 12.6 |
| 1900-01-02 01:17:00 | 12.6 |
| 1900-01-02 01:18:00 | 9 |
| 1900-01-02 01:19:00 | 8.6 |
| 1900-01-02 01:20:00 | 8.6 |
| 1900-01-02 01:21:00 | 15.8 |
| 1900-01-02 01:22:00 | 15.8 |
| 1900-01-02 01:23:00 | 14.8 |
| 1900-01-02 01:24:00 | 14.8 |
| 1900-01-02 01:25:00 | 18.7 |
| 1900-01-02 01:26:00 | 18.7 |
| 1900-01-02 01:27:00 | 14 |
| 1900-01-02 01:28:00 | 14 |
| 1900-01-02 01:29:00 | 14 |
| 1900-01-02 01:30:00 | 14 |
| 1900-01-02 01:31:00 | 12.6 |
| 1900-01-02 01:32:00 | 12.6 |
| 1900-01-02 01:33:00 | 19.1 |
| 1900-01-02 01:34:00 | 19.1 |
| 1900-01-02 01:35:00 | 13.3 |
| 1900-01-02 01:36:00 | 13.3 |
| 1900-01-02 01:37:00 | 14 |
| 1900-01-02 01:38:00 | 14 |
| 1900-01-02 01:39:00 | 10.8 |
| 1900-01-02 01:40:00 | 10.8 |
| 1900-01-02 01:41:00 | 15.5 |
| 1900-01-02 01:42:00 | 15.5 |
| 1900-01-02 01:43:00 | 15.5 |
| 1900-01-02 01:44:00 | 18 |
| 1900-01-02 01:45:00 | 18 |
| 1900-01-02 01:46:00 | 18.4 |
| 1900-01-02 01:47:00 | 18.4 |
| 1900-01-02 01:48:00 | 9.7 |
| 1900-01-02 01:49:00 | 9.7 |
| 1900-01-02 01:50:00 | 15.1 |
| 1900-01-02 01:51:00 | 15.1 |
| 1900-01-02 01:52:00 | 13.3 |
| 1900-01-02 01:53:00 | 13.3 |
| 1900-01-02 01:54:00 | 12.2 |
| 1900-01-02 01:55:00 | 12.2 |
| 1900-01-02 01:56:00 | 15.1 |
| 1900-01-02 01:57:00 | 15.1 |
| 1900-01-02 01:58:00 | 9 |
| 1900-01-02 01:59:00 | 9 |
| 1900-01-02 02:00:00 | 14 |
| 1900-01-02 02:01:00 | 14 |
| 1900-01-02 02:02:00 | 12.2 |
| 1900-01-02 02:03:00 | 12.2 |
| 1900-01-02 02:04:00 | 17.3 |
| 1900-01-02 02:05:00 | 17.3 |
| 1900-01-02 02:06:00 | 17.6 |
| 1900-01-02 02:07:00 | 17.6 |
| 1900-01-02 02:08:00 | 11.2 |
| 1900-01-02 02:09:00 | 11.2 |
| 1900-01-02 02:10:00 | 14 |
| 1900-01-02 02:11:00 | 14 |
| 1900-01-02 02:12:00 | 13.7 |
| 1900-01-02 02:13:00 | 13.3 |
| 1900-01-02 02:14:00 | 13.3 |
| 1900-01-02 02:15:00 | 22 |
| 1900-01-02 02:16:00 | 22 |
| 1900-01-02 02:17:00 | 12.6 |
| 1900-01-02 02:18:00 | 12.6 |
| 1900-01-02 02:19:00 | 14.8 |
| 1900-01-02 02:20:00 | 14.8 |
| 1900-01-02 02:21:00 | 14 |
| 1900-01-02 02:22:00 | 14 |
| 1900-01-02 02:23:00 | 12.2 |
| 1900-01-02 02:24:00 | 12.2 |
| 1900-01-02 02:25:00 | 17.3 |
| 1900-01-02 02:26:00 | 17.3 |
| 1900-01-02 02:27:00 | 8.6 |
| 1900-01-02 02:28:00 | 8.6 |
| 1900-01-02 02:29:00 | 12.2 |
| 1900-01-02 02:30:00 | 12.2 |
| 1900-01-02 02:31:00 | 14.8 |
| 1900-01-02 02:32:00 | 14.8 |
| 1900-01-02 02:33:00 | 11.5 |
| 1900-01-02 02:34:00 | 11.5 |
| 1900-01-02 02:35:00 | 12.6 |
| 1900-01-02 02:36:00 | 12.6 |
| 1900-01-02 02:37:00 | 12.6 |
| 1900-01-02 02:38:00 | 7.2 |
| 1900-01-02 02:39:00 | 7.2 |
| 1900-01-02 02:40:00 | 14 |
| 1900-01-02 02:41:00 | 14 |
| 1900-01-02 02:42:00 | 10.1 |
| 1900-01-02 02:43:00 | 10.1 |
| 1900-01-02 02:44:00 | 22.7 |
| 1900-01-02 02:45:00 | 22.7 |
| 1900-01-02 02:46:00 | 19.1 |
| 1900-01-02 02:47:00 | 19.1 |
| 1900-01-02 02:48:00 | 11.5 |
| 1900-01-02 02:49:00 | 11.5 |
| 1900-01-02 02:50:00 | 11.5 |
| 1900-01-02 02:51:00 | 11.5 |
| 1900-01-02 02:52:00 | 9.4 |
| 1900-01-02 02:53:00 | 9.4 |
| 1900-01-02 02:54:00 | 13.7 |
| 1900-01-02 02:55:00 | 13.7 |
| 1900-01-02 02:56:00 | 14 |
| 1900-01-02 02:57:00 | 14 |
| 1900-01-02 02:58:00 | 17.3 |
| 1900-01-02 02:59:00 | 17.3 |
| 1900-01-02 03:00:00 | 18 |
| 1900-01-02 03:01:00 | 18 |
| 1900-01-02 03:02:00 | 10.8 |
| 1900-01-02 03:03:00 | 10.8 |
| 1900-01-02 03:04:00 | 10.8 |
| 1900-01-02 03:05:00 | 10.8 |
| 1900-01-02 03:06:00 | 16.6 |
| 1900-01-02 03:07:00 | 9.7 |
| 1900-01-02 03:08:00 | 9.7 |
| 1900-01-02 03:09:00 | 17.6 |
| 1900-01-02 03:10:00 | 17.6 |
| 1900-01-02 03:11:00 | 18 |
| 1900-01-02 03:12:00 | 18 |
| 1900-01-02 03:13:00 | 22 |
| 1900-01-02 03:14:00 | 22 |
| 1900-01-02 03:15:00 | 17.6 |
| 1900-01-02 03:16:00 | 17.6 |
| 1900-01-02 03:17:00 | 9.7 |
| 1900-01-02 03:18:00 | 9.7 |
| 1900-01-02 03:19:00 | 16.2 |
| 1900-01-02 03:20:00 | 16.2 |
| 1900-01-02 03:21:00 | 16.2 |
| 1900-01-02 03:22:00 | 16.2 |
| 1900-01-02 03:23:00 | 14.8 |
| 1900-01-02 03:24:00 | 14.8 |
| 1900-01-02 03:25:00 | 18 |
| 1900-01-02 03:26:00 | 18 |
| 1900-01-02 03:27:00 | 14.8 |
| 1900-01-02 03:28:00 | 14.8 |
| 1900-01-02 03:29:00 | 14.4 |
| 1900-01-02 03:30:00 | 14.4 |
| 1900-01-02 03:31:00 | 14.4 |
| 1900-01-02 03:32:00 | 11.9 |
| 1900-01-02 03:33:00 | 11.9 |
| 1900-01-02 03:34:00 | 14 |
| 1900-01-02 03:35:00 | 14 |
| 1900-01-02 03:36:00 | 12.6 |
| 1900-01-02 03:37:00 | 12.6 |
| 1900-01-02 03:38:00 | 6.8 |
| 1900-01-02 03:39:00 | 6.8 |
| 1900-01-02 03:40:00 | 9.4 |
| 1900-01-02 03:41:00 | 9.4 |
| 1900-01-02 03:42:00 | 7.2 |
| 1900-01-02 03:43:00 | 7.2 |
| 1900-01-02 03:44:00 | 8.3 |
| 1900-01-02 03:45:00 | 8.3 |
| 1900-01-02 03:46:00 | 6.1 |
| 1900-01-02 03:47:00 | 6.1 |
| 1900-01-02 03:48:00 | 7.2 |
| 1900-01-02 03:49:00 | 7.2 |
| 1900-01-02 03:50:00 | 9.7 |
| 1900-01-02 03:51:00 | 9.7 |
| 1900-01-02 03:52:00 | 12.2 |
| 1900-01-02 03:53:00 | 12.2 |
| 1900-01-02 03:54:00 | 6.1 |
| 1900-01-02 03:55:00 | 6.1 |
| 1900-01-02 03:56:00 | 10.4 |
| 1900-01-02 03:57:00 | 10.4 |
| 1900-01-02 03:58:00 | 9 |
| 1900-01-02 03:59:00 | 9 |
| 1900-01-02 04:00:00 | 9.4 |
| 1900-01-02 04:01:00 | 9.4 |
| 1900-01-02 04:02:00 | 8.6 |
| 1900-01-02 04:03:00 | 8.6 |
| 1900-01-02 04:04:00 | 6.1 |
| 1900-01-02 04:05:00 | 6.1 |
| 1900-01-02 04:06:00 | 8.3 |
| 1900-01-02 04:07:00 | 8.3 |
| 1900-01-02 04:08:00 | 5.8 |
| 1900-01-02 04:09:00 | 5.8 |
| 1900-01-02 04:10:00 | 15.8 |
| 1900-01-02 04:11:00 | 15.8 |
| 1900-01-02 04:12:00 | 8.3 |
| 1900-01-02 04:13:00 | 8.3 |
| 1900-01-02 04:14:00 | 13 |
| 1900-01-02 04:15:00 | 13 |
| 1900-01-02 04:16:00 | 5.8 |
| 1900-01-02 04:17:00 | 5.8 |
| 1900-01-02 04:18:00 | 6.5 |
| 1900-01-02 04:19:00 | 6.5 |
| 1900-01-02 04:20:00 | 7.2 |
| 1900-01-02 04:21:00 | 7.2 |
| 1900-01-02 04:22:00 | 11.5 |
| 1900-01-02 04:23:00 | 11.5 |
| 1900-01-02 04:24:00 | 11.5 |
| 1900-01-02 04:25:00 | 8.6 |
| 1900-01-02 04:26:00 | 8.6 |
| 1900-01-02 04:27:00 | 10.1 |
| 1900-01-02 04:28:00 | 10.1 |
| 1900-01-02 04:29:00 | 10.4 |
| 1900-01-02 04:30:00 | 10.4 |
| 1900-01-02 04:31:00 | 5.8 |
| 1900-01-02 04:32:00 | 5.8 |
| 1900-01-02 04:33:00 | 6.5 |
| 1900-01-02 04:34:00 | 6.5 |
| 1900-01-02 04:35:00 | 5.4 |
| 1900-01-02 04:36:00 | 5.4 |
| 1900-01-02 04:37:00 | 7.2 |
| 1900-01-02 04:38:00 | 7.2 |
| 1900-01-02 04:39:00 | 8.6 |
| 1900-01-02 04:40:00 | 8.6 |
| 1900-01-02 04:41:00 | 9.7 |
| 1900-01-02 04:42:00 | 9.7 |
| 1900-01-02 04:43:00 | 8.3 |
| 1900-01-02 04:44:00 | 8.3 |
| 1900-01-02 04:45:00 | 6.5 |
| 1900-01-02 04:46:00 | 6.5 |
| 1900-01-02 04:47:00 | 8.6 |
| 1900-01-02 04:48:00 | 8.6 |
| 1900-01-02 04:49:00 | 6.8 |
| 1900-01-02 04:50:00 | 6.8 |
| 1900-01-02 04:51:00 | 7.2 |
| 1900-01-02 04:52:00 | 7.2 |
| 1900-01-02 04:53:00 | 7.6 |
| 1900-01-02 04:54:00 | 7.6 |
| 1900-01-02 04:55:00 | 6.1 |
| 1900-01-02 04:56:00 | 5.8 |
| 1900-01-02 04:57:00 | 5.8 |
| 1900-01-02 04:58:00 | 5.8 |
| 1900-01-02 04:59:00 | 6.1 |
| 1900-01-02 05:00:00 | 6.1 |
| 1900-01-02 05:01:00 | 8.3 |
| 1900-01-02 05:02:00 | 8.3 |
| 1900-01-02 05:03:00 | 7.6 |
| 1900-01-02 05:04:00 | 7.6 |
| 1900-01-02 05:05:00 | 7.2 |
| 1900-01-02 05:06:00 | 7.2 |
| 1900-01-02 05:07:00 | 8.3 |
| 1900-01-02 05:08:00 | 8.3 |
| 1900-01-02 05:09:00 | 6.8 |
| 1900-01-02 05:10:00 | 6.8 |
| 1900-01-02 05:11:00 | 7.9 |
| 1900-01-02 05:12:00 | 7.9 |
| 1900-01-02 05:13:00 | 6.8 |
| 1900-01-02 05:14:00 | 6.8 |
| 1900-01-02 05:15:00 | 6.1 |
| 1900-01-02 05:16:00 | 6.1 |
| 1900-01-02 05:17:00 | 10.4 |
| 1900-01-02 05:18:00 | 10.4 |
| 1900-01-02 05:19:00 | 10.4 |
| 1900-01-02 05:20:00 | 5.8 |
| 1900-01-02 05:21:00 | 5.8 |
| 1900-01-02 05:22:00 | 10.4 |
| 1900-01-02 05:23:00 | 10.4 |
| 1900-01-02 05:24:00 | 10.8 |
| 1900-01-02 05:25:00 | 10.8 |
| 1900-01-02 05:26:00 | 9.4 |
| 1900-01-02 05:27:00 | 9.4 |
| 1900-01-02 05:28:00 | 9.7 |
| 1900-01-02 05:29:00 | 9.7 |
| 1900-01-02 05:30:00 | 10.1 |
| 1900-01-02 05:31:00 | 10.1 |
| 1900-01-02 05:32:00 | 7.9 |
| 1900-01-02 05:33:00 | 7.9 |
| 1900-01-02 05:34:00 | 8.6 |
| 1900-01-02 05:35:00 | 8.6 |
| 1900-01-02 05:36:00 | 10.1 |
| 1900-01-02 05:37:00 | 10.1 |
| 1900-01-02 05:38:00 | 14 |
| 1900-01-02 05:39:00 | 14 |
| 1900-01-02 05:40:00 | 11.5 |
| 1900-01-02 05:41:00 | 11.5 |
| 1900-01-02 05:42:00 | 13.3 |
| 1900-01-02 05:43:00 | 13.3 |
| 1900-01-02 05:44:00 | 14 |
| 1900-01-02 05:45:00 | 14 |
| 1900-01-02 05:46:00 | 9.4 |
| 1900-01-02 05:47:00 | 9.4 |
| 1900-01-02 05:48:00 | 11.2 |
| 1900-01-02 05:49:00 | 11.2 |
| 1900-01-02 05:50:00 | 13.3 |
| 1900-01-02 05:51:00 | 16.2 |
| 1900-01-02 05:52:00 | 16.2 |
| 1900-01-02 05:53:00 | 15.5 |
| 1900-01-02 05:54:00 | 15.5 |
| 1900-01-02 05:55:00 | 24.8 |
| 1900-01-02 05:56:00 | 24.8 |
| 1900-01-02 05:57:00 | 25.2 |
| 1900-01-02 05:58:00 | 25.2 |
| 1900-01-02 05:59:00 | 21.2 |
| 1900-01-02 06:00:00 | 21.2 |
| 1900-01-02 06:01:00 | 18.4 |
| 1900-01-02 06:02:00 | 18.4 |
| 1900-01-02 06:03:00 | 15.5 |
| 1900-01-02 06:04:00 | 15.5 |
| 1900-01-02 06:05:00 | 13.7 |
| 1900-01-02 06:06:00 | 13.7 |
| 1900-01-02 06:07:00 | 12.6 |
| 1900-01-02 06:08:00 | 12.6 |
| 1900-01-02 06:09:00 | 19.4 |
| 1900-01-02 06:10:00 | 19.4 |
| 1900-01-02 06:11:00 | 12.6 |
| 1900-01-02 06:12:00 | 12.6 |
| 1900-01-02 06:13:00 | 13 |
| 1900-01-02 06:14:00 | 13 |
| 1900-01-02 06:15:00 | 12.6 |
| 1900-01-02 06:16:00 | 12.6 |
| 1900-01-02 06:17:00 | 12.6 |
| 1900-01-02 06:18:00 | 13.7 |
| 1900-01-02 06:19:00 | 13.7 |
| 1900-01-02 06:20:00 | 19.8 |
| 1900-01-02 06:21:00 | 19.8 |
| 1900-01-02 06:22:00 | 17.3 |
| 1900-01-02 06:23:00 | 17.3 |
| 1900-01-02 06:24:00 | 15.5 |
| 1900-01-02 06:25:00 | 15.5 |
| 1900-01-02 06:26:00 | 9.4 |
| 1900-01-02 06:27:00 | 9.4 |
| 1900-01-02 06:28:00 | 12.2 |
| 1900-01-02 06:29:00 | 12.2 |
| 1900-01-02 06:30:00 | 19.8 |
| 1900-01-02 06:31:00 | 19.8 |
| 1900-01-02 06:32:00 | 14.4 |
| 1900-01-02 06:33:00 | 14.4 |
| 1900-01-02 06:34:00 | 21.6 |
| 1900-01-02 06:35:00 | 21.6 |
| 1900-01-02 06:36:00 | 16.2 |
| 1900-01-02 06:37:00 | 16.2 |
| 1900-01-02 06:38:00 | 15.1 |
| 1900-01-02 06:39:00 | 15.1 |
| 1900-01-02 06:40:00 | 9.7 |
| 1900-01-02 06:41:00 | 9.7 |
| 1900-01-02 06:42:00 | 16.6 |
| 1900-01-02 06:43:00 | 16.6 |
| 1900-01-02 06:44:00 | 10.8 |
| 1900-01-02 06:45:00 | 10.8 |
| 1900-01-02 06:46:00 | 14 |
| 1900-01-02 06:47:00 | 14 |
| 1900-01-02 06:48:00 | 12.2 |
| 1900-01-02 06:49:00 | 16.2 |
| 1900-01-02 06:50:00 | 16.2 |
| 1900-01-02 06:51:00 | 7.2 |
| 1900-01-02 06:52:00 | 7.2 |
| 1900-01-02 06:53:00 | 12.2 |
| 1900-01-02 06:54:00 | 12.2 |
| 1900-01-02 06:55:00 | 10.1 |
| 1900-01-02 06:56:00 | 10.1 |
| 1900-01-02 06:57:00 | 12.6 |
| 1900-01-02 06:58:00 | 12.6 |
| 1900-01-02 06:59:00 | 13 |
| 1900-01-02 07:00:00 | 13 |
| 1900-01-02 07:01:00 | 16.6 |
| 1900-01-02 07:02:00 | 16.6 |
| 1900-01-02 07:03:00 | 18 |
| 1900-01-02 07:04:00 | 18 |
| 1900-01-02 07:05:00 | 14 |
| 1900-01-02 07:06:00 | 14 |
| 1900-01-02 07:07:00 | 15.1 |
| 1900-01-02 07:08:00 | 15.1 |
| 1900-01-02 07:09:00 | 15.5 |
| 1900-01-02 07:10:00 | 15.5 |
| 1900-01-02 07:11:00 | 16.6 |
| 1900-01-02 07:12:00 | 16.6 |
| 1900-01-02 07:13:00 | 16.6 |
| 1900-01-02 07:14:00 | 13 |
| 1900-01-02 07:15:00 | 13 |
| 1900-01-02 07:16:00 | 18.7 |
| 1900-01-02 07:17:00 | 18.7 |
| 1900-01-02 07:18:00 | 22.7 |
| 1900-01-02 07:19:00 | 22.7 |
| 1900-01-02 07:20:00 | 13.3 |
| 1900-01-02 07:21:00 | 13.3 |
| 1900-01-02 07:22:00 | 14.8 |
| 1900-01-02 07:23:00 | 14.8 |
| 1900-01-02 07:24:00 | 12.6 |
| 1900-01-02 07:25:00 | 12.6 |
| 1900-01-02 07:26:00 | 13.3 |
| 1900-01-02 07:27:00 | 13.3 |
| 1900-01-02 07:28:00 | 17.6 |
| 1900-01-02 07:29:00 | 17.6 |
| 1900-01-02 07:30:00 | 9.4 |
| 1900-01-02 07:31:00 | 9.4 |
| 1900-01-02 07:32:00 | 25.9 |
| 1900-01-02 07:33:00 | 25.9 |
| 1900-01-02 07:34:00 | 19.1 |
| 1900-01-02 07:35:00 | 19.1 |
| 1900-01-02 07:36:00 | 22 |
| 1900-01-02 07:37:00 | 22 |
| 1900-01-02 07:38:00 | 18 |
| 1900-01-02 07:39:00 | 18 |
| 1900-01-02 07:40:00 | 23 |
| 1900-01-02 07:41:00 | 23 |
| 1900-01-02 07:42:00 | 20.2 |
| 1900-01-02 07:43:00 | 20.2 |
| 1900-01-02 07:44:00 | 14.4 |
| 1900-01-02 07:45:00 | 13.7 |
| 1900-01-02 07:46:00 | 13.7 |
| 1900-01-02 07:47:00 | 20.9 |
| 1900-01-02 07:48:00 | 20.9 |
| 1900-01-02 07:49:00 | 15.8 |
| 1900-01-02 07:50:00 | 15.8 |
| 1900-01-02 07:51:00 | 12.6 |
| 1900-01-02 07:52:00 | 12.6 |
| 1900-01-02 07:53:00 | 22 |
| 1900-01-02 07:54:00 | 22 |
| 1900-01-02 07:55:00 | 24.1 |
| 1900-01-02 07:56:00 | 24.1 |
| 1900-01-02 07:57:00 | 17.6 |
| 1900-01-02 07:58:00 | 17.6 |
| 1900-01-02 07:59:00 | 18.7 |
| 1900-01-02 08:00:00 | 18.7 |
| 1900-01-02 08:01:00 | 23 |
| 1900-01-02 08:02:00 | 23 |
| 1900-01-02 08:03:00 | 6.5 |
| 1900-01-02 08:04:00 | 6.5 |
| 1900-01-02 08:05:00 | 13.3 |
| 1900-01-02 08:06:00 | 13.3 |
| 1900-01-02 08:07:00 | 16.6 |
| 1900-01-02 08:08:00 | 16.6 |
| 1900-01-02 08:09:00 | 16.6 |
| 1900-01-02 08:10:00 | 13 |
| 1900-01-02 08:11:00 | 13 |
| 1900-01-02 08:12:00 | 9.7 |
| 1900-01-02 08:13:00 | 9.7 |
| 1900-01-02 08:14:00 | 10.8 |
| 1900-01-02 08:15:00 | 10.8 |
| 1900-01-02 08:16:00 | 17.3 |
| 1900-01-02 08:17:00 | 17.3 |
| 1900-01-02 08:18:00 | 20.2 |
| 1900-01-02 08:19:00 | 20.2 |
| 1900-01-02 08:20:00 | 9.7 |
| 1900-01-02 08:21:00 | 9.7 |
| 1900-01-02 08:22:00 | 14.8 |
| 1900-01-02 08:23:00 | 14.8 |
| 1900-01-02 08:24:00 | 13.3 |
| 1900-01-02 08:25:00 | 13.3 |
| 1900-01-02 08:26:00 | 10.8 |
| 1900-01-02 08:27:00 | 10.8 |
| 1900-01-02 08:28:00 | 6.5 |
| 1900-01-02 08:29:00 | 6.5 |
| 1900-01-02 08:30:00 | 15.5 |
| 1900-01-02 08:31:00 | 15.5 |
| 1900-01-02 08:32:00 | 12.2 |
| 1900-01-02 08:33:00 | 12.2 |
| 1900-01-02 08:34:00 | 17.3 |
| 1900-01-02 08:35:00 | 17.3 |
| 1900-01-02 08:36:00 | 14.8 |
| 1900-01-02 08:37:00 | 14.8 |
| 1900-01-02 08:38:00 | 10.1 |
| 1900-01-02 08:39:00 | 10.1 |
| 1900-01-02 08:40:00 | 3.2 |
| 1900-01-02 08:41:00 | 15.5 |
| 1900-01-02 08:42:00 | 15.5 |
| 1900-01-02 08:43:00 | 14.8 |
| 1900-01-02 08:44:00 | 14.8 |
| 1900-01-02 08:45:00 | 13.3 |
| 1900-01-02 08:46:00 | 13.3 |
| 1900-01-02 08:47:00 | 20.2 |
| 1900-01-02 08:48:00 | 20.2 |
| 1900-01-02 08:49:00 | 10.8 |
| 1900-01-02 08:50:00 | 10.8 |
| 1900-01-02 08:51:00 | 9.4 |
| 1900-01-02 08:52:00 | 9.4 |
| 1900-01-02 08:53:00 | 10.8 |
| 1900-01-02 08:54:00 | 10.8 |
| 1900-01-02 08:55:00 | 7.9 |
| 1900-01-02 08:56:00 | 7.9 |
| 1900-01-02 08:57:00 | 5.8 |
| 1900-01-02 08:58:00 | 5.8 |
| 1900-01-02 08:59:00 | 6.1 |
| 1900-01-02 09:00:00 | 6.1 |
| 1900-01-02 09:01:00 | 4.7 |
| 1900-01-02 09:02:00 | 4.7 |
| 1900-01-02 09:03:00 | 4.7 |
| 1900-01-02 09:04:00 | 8.3 |
| 1900-01-02 09:05:00 | 8.3 |
| 1900-01-02 09:06:00 | 11.2 |
| 1900-01-02 09:07:00 | 11.2 |
| 1900-01-02 09:08:00 | 9.4 |
| 1900-01-02 09:09:00 | 9.4 |
| 1900-01-02 09:10:00 | 9 |
| 1900-01-02 09:11:00 | 9 |
| 1900-01-02 09:12:00 | 9.4 |
| 1900-01-02 09:13:00 | 9.4 |
| 1900-01-02 09:14:00 | 0 |
| 1900-01-02 09:15:00 | 0 |
| 1900-01-02 09:16:00 | 0 |
| 1900-01-02 09:17:00 | 0 |
| 1900-01-02 09:18:00 | 9 |
| 1900-01-02 09:19:00 | 9 |
| 1900-01-02 09:20:00 | 7.6 |
| 1900-01-02 09:21:00 | 7.6 |
| 1900-01-02 09:22:00 | 10.1 |
| 1900-01-02 09:23:00 | 10.1 |
| 1900-01-02 09:24:00 | 14 |
| 1900-01-02 09:25:00 | 14 |
| 1900-01-02 09:26:00 | 13.7 |
| 1900-01-02 09:27:00 | 13.7 |
| 1900-01-02 09:28:00 | 12.2 |
| 1900-01-02 09:29:00 | 12.2 |
| 1900-01-02 09:30:00 | 12.6 |
| 1900-01-02 09:31:00 | 12.6 |
| 1900-01-02 09:32:00 | 17.3 |
| 1900-01-02 09:33:00 | 17.3 |
| 1900-01-02 09:34:00 | 9.4 |
| 1900-01-02 09:35:00 | 17.3 |
| 1900-01-02 09:36:00 | 17.3 |
| 1900-01-02 09:37:00 | 7.6 |
| 1900-01-02 09:38:00 | 7.6 |
| 1900-01-02 09:39:00 | 10.4 |
| 1900-01-02 09:40:00 | 10.4 |
| 1900-01-02 09:41:00 | 12.6 |
| 1900-01-02 09:42:00 | 12.6 |
| 1900-01-02 09:43:00 | 13.7 |
| 1900-01-02 09:44:00 | 13.7 |
| 1900-01-02 09:45:00 | 16.2 |
| 1900-01-02 09:46:00 | 16.2 |
| 1900-01-02 09:47:00 | 18 |
| 1900-01-02 09:48:00 | 18 |
| 1900-01-02 09:49:00 | 13.3 |
| 1900-01-02 09:50:00 | 13.3 |
| 1900-01-02 09:51:00 | 7.2 |
| 1900-01-02 09:52:00 | 7.2 |
| 1900-01-02 09:53:00 | 11.2 |
| 1900-01-02 09:54:00 | 11.2 |
| 1900-01-02 09:55:00 | 8.3 |
| 1900-01-02 09:56:00 | 8.3 |
| 1900-01-02 09:57:00 | 9.4 |
| 1900-01-02 09:58:00 | 9.4 |
| 1900-01-02 09:59:00 | 9.4 |
| 1900-01-02 10:00:00 | 8.6 |
| 1900-01-02 10:01:00 | 8.6 |
| 1900-01-02 10:02:00 | 10.1 |
| 1900-01-02 10:03:00 | 10.1 |
| 1900-01-02 10:04:00 | 9.4 |
| 1900-01-02 10:05:00 | 9.4 |
| 1900-01-02 10:06:00 | 9.4 |
| 1900-01-02 10:07:00 | 9.4 |
| 1900-01-02 10:08:00 | 3.2 |
| 1900-01-02 10:09:00 | 3.2 |
| 1900-01-02 10:10:00 | 5.8 |
| 1900-01-02 10:11:00 | 5.8 |
| 1900-01-02 10:12:00 | 6.8 |
| 1900-01-02 10:13:00 | 6.8 |
| 1900-01-02 10:14:00 | 8.3 |
| 1900-01-02 10:15:00 | 8.3 |
| 1900-01-02 10:16:00 | 6.8 |
| 1900-01-02 10:17:00 | 6.8 |
| 1900-01-02 10:18:00 | 4.7 |
| 1900-01-02 10:19:00 | 4.7 |
| 1900-01-02 10:20:00 | 5 |
| 1900-01-02 10:21:00 | 5 |
| 1900-01-02 10:22:00 | 2.2 |
| 1900-01-02 10:23:00 | 2.2 |
| 1900-01-02 10:24:00 | 9 |
| 1900-01-02 10:25:00 | 9 |
| 1900-01-02 10:26:00 | 5.4 |
| 1900-01-02 10:27:00 | 5.4 |
| 1900-01-02 10:28:00 | 7.6 |
| 1900-01-02 10:29:00 | 6.5 |
| 1900-01-02 10:30:00 | 6.5 |
| 1900-01-02 10:31:00 | 5 |
| 1900-01-02 10:32:00 | 5 |
| 1900-01-02 10:33:00 | 6.5 |
| 1900-01-02 10:34:00 | 6.5 |
| 1900-01-02 10:35:00 | 4.3 |
| 1900-01-02 10:36:00 | 4.3 |
| 1900-01-02 10:37:00 | 0 |
| 1900-01-02 10:38:00 | 0 |
| 1900-01-02 10:39:00 | 2.2 |
| 1900-01-02 10:40:00 | 2.2 |
| 1900-01-02 10:41:00 | 0 |
| 1900-01-02 10:42:00 | 0 |
| 1900-01-02 10:43:00 | 0 |
| 1900-01-02 10:44:00 | 0 |
| 1900-01-02 10:45:00 | 0 |
| 1900-01-02 10:46:00 | 0 |
| 1900-01-02 10:47:00 | 3.6 |
| 1900-01-02 10:48:00 | 3.6 |
| 1900-01-02 10:49:00 | 4.3 |
| 1900-01-02 10:50:00 | 4.3 |
| 1900-01-02 10:51:00 | 5.8 |
| 1900-01-02 10:52:00 | 5.8 |
| 1900-01-02 10:53:00 | 5.8 |
| 1900-01-02 10:54:00 | 7.6 |
| 1900-01-02 10:55:00 | 7.6 |
| 1900-01-02 10:56:00 | 8.3 |
| 1900-01-02 10:57:00 | 8.3 |
| 1900-01-02 10:58:00 | 8.3 |
| 1900-01-02 10:59:00 | 8.3 |
| 1900-01-02 11:00:00 | 8.6 |
| 1900-01-02 11:01:00 | 8.6 |
| 1900-01-02 11:02:00 | 9.4 |
| 1900-01-02 11:03:00 | 9.4 |
| 1900-01-02 11:04:00 | 6.1 |
| 1900-01-02 11:05:00 | 6.1 |
| 1900-01-02 11:06:00 | 7.9 |
| 1900-01-02 11:07:00 | 7.9 |
| 1900-01-02 11:08:00 | 12.6 |
| 1900-01-02 11:09:00 | 12.6 |
| 1900-01-02 11:10:00 | 10.4 |
| 1900-01-02 11:11:00 | 10.4 |
| 1900-01-02 11:12:00 | 9 |
| 1900-01-02 11:13:00 | 9 |
| 1900-01-02 11:14:00 | 10.1 |
| 1900-01-02 11:15:00 | 10.1 |
| 1900-01-02 11:16:00 | 2.9 |
| 1900-01-02 11:17:00 | 2.9 |
| 1900-01-02 11:18:00 | 0 |
| 1900-01-02 11:19:00 | 0 |
| 1900-01-02 11:20:00 | 5.8 |
| 1900-01-02 11:21:00 | 10.4 |
| 1900-01-02 11:22:00 | 10.4 |
| 1900-01-02 11:23:00 | 11.2 |
| 1900-01-02 11:24:00 | 11.2 |
| 1900-01-02 11:25:00 | 3.6 |
| 1900-01-02 11:26:00 | 3.6 |
| 1900-01-02 11:27:00 | 8.3 |
| 1900-01-02 11:28:00 | 8.3 |
| 1900-01-02 11:29:00 | 8.3 |
| 1900-01-02 11:30:00 | 8.3 |
| 1900-01-02 11:31:00 | 10.8 |
| 1900-01-02 11:32:00 | 10.8 |
| 1900-01-02 11:33:00 | 11.5 |
| 1900-01-02 11:34:00 | 11.5 |
| 1900-01-02 11:35:00 | 11.2 |
| 1900-01-02 11:36:00 | 11.2 |
| 1900-01-02 11:37:00 | 7.9 |
| 1900-01-02 11:38:00 | 7.9 |
| 1900-01-02 11:39:00 | 10.4 |
| 1900-01-02 11:40:00 | 10.4 |
| 1900-01-02 11:41:00 | 11.2 |
| 1900-01-02 11:42:00 | 11.2 |
| 1900-01-02 11:43:00 | 12.2 |
| 1900-01-02 11:44:00 | 12.2 |
| 1900-01-02 11:45:00 | 13.3 |
| 1900-01-02 11:46:00 | 13.3 |
| 1900-01-02 11:47:00 | 13.3 |
| 1900-01-02 11:48:00 | 6.8 |
| 1900-01-02 11:49:00 | 6.8 |
| 1900-01-02 11:50:00 | 4.7 |
| 1900-01-02 11:51:00 | 4.7 |
| 1900-01-02 11:52:00 | 4.3 |
| 1900-01-02 11:53:00 | 4.3 |
| 1900-01-02 11:54:00 | 5 |
| 1900-01-02 11:55:00 | 5 |
| 1900-01-02 11:56:00 | 3.6 |
| 1900-01-02 11:57:00 | 3.6 |
| 1900-01-02 11:58:00 | 5 |
| 1900-01-02 11:59:00 | 5 |
| 1900-01-02 12:00:00 | 5.8 |
| 1900-01-02 12:01:00 | 5.8 |
| 1900-01-02 12:02:00 | 4.7 |
| 1900-01-02 12:03:00 | 4.7 |
| 1900-01-02 12:04:00 | 4.3 |
| 1900-01-02 12:05:00 | 4.3 |
| 1900-01-02 12:06:00 | 7.6 |
| 1900-01-02 12:07:00 | 7.6 |
| 1900-01-02 12:08:00 | 13 |
| 1900-01-02 12:09:00 | 13 |
| 1900-01-02 12:10:00 | 22.7 |
| 1900-01-02 12:11:00 | 22.7 |
| 1900-01-02 12:12:00 | 17.3 |
| 1900-01-02 12:13:00 | 17.3 |
| 1900-01-02 12:14:00 | 13.3 |
| 1900-01-02 12:15:00 | 13.3 |
| 1900-01-02 12:16:00 | 19.1 |
| 1900-01-02 12:17:00 | 34.2 |
| 1900-01-02 12:18:00 | 34.2 |
| 1900-01-02 12:19:00 | 42.5 |
| 1900-01-02 12:20:00 | 42.5 |
| 1900-01-02 12:21:00 | 40.7 |
| 1900-01-02 12:22:00 | 40.7 |
| 1900-01-02 12:23:00 | 22.7 |
| 1900-01-02 12:24:00 | 22.7 |
| 1900-01-02 12:25:00 | 38.5 |
| 1900-01-02 12:26:00 | 38.5 |
| 1900-01-02 12:27:00 | 38.9 |
| 1900-01-02 12:28:00 | 38.9 |
| 1900-01-02 12:29:00 | 21.2 |
| 1900-01-02 12:30:00 | 21.2 |
| 1900-01-02 12:31:00 | 41.4 |
| 1900-01-02 12:32:00 | 41.4 |
| 1900-01-02 12:33:00 | 36 |
| 1900-01-02 12:34:00 | 36 |
| 1900-01-02 12:35:00 | 21.2 |
| 1900-01-02 12:36:00 | 21.2 |
| 1900-01-02 12:37:00 | 47.9 |
| 1900-01-02 12:38:00 | 47.9 |
| 1900-01-02 12:39:00 | 39.2 |
| 1900-01-02 12:40:00 | 39.2 |
| 1900-01-02 12:41:00 | 30.6 |
| 1900-01-02 12:42:00 | 30.6 |
| 1900-01-02 12:43:00 | 30.6 |
| 1900-01-02 12:44:00 | 27.4 |
| 1900-01-02 12:45:00 | 27.4 |
| 1900-01-02 12:46:00 | 21.2 |
| 1900-01-02 12:47:00 | 21.2 |
| 1900-01-02 12:48:00 | 44.3 |
| 1900-01-02 12:49:00 | 44.3 |
| 1900-01-02 12:50:00 | 25.2 |
| 1900-01-02 12:51:00 | 25.2 |
| 1900-01-02 12:52:00 | 32.8 |
| 1900-01-02 12:53:00 | 32.8 |
| 1900-01-02 12:54:00 | 50.8 |
| 1900-01-02 12:55:00 | 50.8 |
| 1900-01-02 12:56:00 | 46.1 |
| 1900-01-02 12:57:00 | 46.1 |
| 1900-01-02 12:58:00 | 40.3 |
| 1900-01-02 12:59:00 | 40.3 |
| 1900-01-02 13:00:00 | 51.1 |
| 1900-01-02 13:01:00 | 51.1 |
| 1900-01-02 13:02:00 | 62.6 |
| 1900-01-02 13:03:00 | 62.6 |
| 1900-01-02 13:04:00 | 41.4 |
| 1900-01-02 13:05:00 | 41.4 |
| 1900-01-02 13:06:00 | 34.2 |
| 1900-01-02 13:07:00 | 34.2 |
| 1900-01-02 13:08:00 | 39.6 |
| 1900-01-02 13:09:00 | 39.6 |
| 1900-01-02 13:10:00 | 36 |
| 1900-01-02 13:11:00 | 36 |
| 1900-01-02 13:12:00 | 25.6 |
| 1900-01-02 13:13:00 | 25.6 |
| 1900-01-02 13:14:00 | 28.1 |
| 1900-01-02 13:15:00 | 28.1 |
| 1900-01-02 13:16:00 | 23 |
| 1900-01-02 13:17:00 | 24.5 |
| 1900-01-02 13:18:00 | 24.5 |
| 1900-01-02 13:19:00 | 22.3 |
| 1900-01-02 13:20:00 | 22.3 |
| 1900-01-02 13:21:00 | 28.1 |
| 1900-01-02 13:22:00 | 28.1 |
| 1900-01-02 13:23:00 | 29.5 |
| 1900-01-02 13:24:00 | 29.5 |
| 1900-01-02 13:25:00 | 21.6 |
| 1900-01-02 13:26:00 | 21.6 |
| 1900-01-02 13:27:00 | 24.5 |
| 1900-01-02 13:28:00 | 24.5 |
| 1900-01-02 13:29:00 | 12.6 |
| 1900-01-02 13:30:00 | 12.6 |
| 1900-01-02 13:31:00 | 19.4 |
| 1900-01-02 13:32:00 | 19.4 |
| 1900-01-02 13:33:00 | 21.6 |
| 1900-01-02 13:34:00 | 21.6 |
| 1900-01-02 13:35:00 | 22.7 |
| 1900-01-02 13:36:00 | 22.7 |
| 1900-01-02 13:37:00 | 20.5 |
| 1900-01-02 13:38:00 | 20.5 |
| 1900-01-02 13:39:00 | 20.5 |
| 1900-01-02 13:40:00 | 24.5 |
| 1900-01-02 13:41:00 | 24.5 |
| 1900-01-02 13:42:00 | 29.5 |
| 1900-01-02 13:43:00 | 29.5 |
| 1900-01-02 13:44:00 | 27.7 |
| 1900-01-02 13:45:00 | 27.7 |
| 1900-01-02 13:46:00 | 29.2 |
| 1900-01-02 13:47:00 | 29.2 |
| 1900-01-02 13:48:00 | 13.7 |
| 1900-01-02 13:49:00 | 13.7 |
| 1900-01-02 13:50:00 | 27.7 |
| 1900-01-02 13:51:00 | 27.7 |
| 1900-01-02 13:52:00 | 37.1 |
| 1900-01-02 13:53:00 | 37.1 |
| 1900-01-02 13:54:00 | 22.7 |
| 1900-01-02 13:55:00 | 22.7 |
| 1900-01-02 13:56:00 | 24.1 |
| 1900-01-02 13:57:00 | 24.1 |
| 1900-01-02 13:58:00 | 19.1 |
| 1900-01-02 13:59:00 | 19.1 |
| 1900-01-02 14:00:00 | 13.3 |
| 1900-01-02 14:01:00 | 13.3 |
| 1900-01-02 14:02:00 | 15.1 |
| 1900-01-02 14:03:00 | 15.1 |
| 1900-01-02 14:04:00 | 22.7 |
| 1900-01-02 14:05:00 | 22.7 |
| 1900-01-02 14:06:00 | 25.6 |
| 1900-01-02 14:07:00 | 25.6 |
| 1900-01-02 14:08:00 | 18.4 |
| 1900-01-02 14:09:00 | 19.4 |
| 1900-01-02 14:10:00 | 19.4 |
| 1900-01-02 14:11:00 | 17.3 |
| 1900-01-02 14:12:00 | 17.3 |
| 1900-01-02 14:13:00 | 19.1 |
| 1900-01-02 14:14:00 | 19.1 |
| 1900-01-02 14:15:00 | 23 |
| 1900-01-02 14:16:00 | 23 |
| 1900-01-02 14:17:00 | 24.1 |
| 1900-01-02 14:18:00 | 24.1 |
| 1900-01-02 14:19:00 | 21.2 |
| 1900-01-02 14:20:00 | 21.2 |
| 1900-01-02 14:21:00 | 20.9 |
| 1900-01-02 14:22:00 | 20.9 |
| 1900-01-02 14:23:00 | 27.4 |
| 1900-01-02 14:24:00 | 27.4 |
| 1900-01-02 14:25:00 | 29.5 |
| 1900-01-02 14:26:00 | 29.5 |
| 1900-01-02 14:27:00 | 24.1 |
| 1900-01-02 14:28:00 | 24.1 |
| 1900-01-02 14:29:00 | 23.8 |
| 1900-01-02 14:30:00 | 23.8 |
| 1900-01-02 14:31:00 | 23.4 |
| 1900-01-02 14:32:00 | 23.4 |
| 1900-01-02 14:33:00 | 13.7 |
| 1900-01-02 14:34:00 | 13.7 |
| 1900-01-02 14:35:00 | 13.7 |
| 1900-01-02 14:36:00 | 20.5 |
| 1900-01-02 14:37:00 | 20.5 |
| 1900-01-02 14:38:00 | 17.3 |
| 1900-01-02 14:39:00 | 17.3 |
| 1900-01-02 14:40:00 | 17.3 |
| 1900-01-02 14:41:00 | 17.3 |
| 1900-01-02 14:42:00 | 16.9 |
| 1900-01-02 14:43:00 | 16.9 |
| 1900-01-02 14:44:00 | 11.2 |
| 1900-01-02 14:45:00 | 11.2 |
| 1900-01-02 14:46:00 | 15.8 |
| 1900-01-02 14:47:00 | 15.8 |
| 1900-01-02 14:48:00 | 12.6 |
| 1900-01-02 14:49:00 | 12.6 |
| 1900-01-02 14:50:00 | 10.1 |
| 1900-01-02 14:51:00 | 10.1 |
| 1900-01-02 14:52:00 | 4.3 |
| 1900-01-02 14:53:00 | 4.3 |
| 1900-01-02 14:54:00 | 14.8 |
| 1900-01-02 14:55:00 | 14.8 |
| 1900-01-02 14:56:00 | 14.8 |
| 1900-01-02 14:57:00 | 14.8 |
| 1900-01-02 14:58:00 | 11.2 |
| 1900-01-02 14:59:00 | 11.2 |
| 1900-01-02 15:00:00 | 9.7 |
| 1900-01-02 15:01:00 | 9.7 |
| 1900-01-02 15:02:00 | 6.8 |
| 1900-01-02 15:03:00 | 6.8 |
| 1900-01-02 15:04:00 | 11.9 |
| 1900-01-02 15:05:00 | 11.9 |
| 1900-01-02 15:06:00 | 4.7 |
| 1900-01-02 15:07:00 | 14 |
| 1900-01-02 15:08:00 | 14 |
| 1900-01-02 15:09:00 | 7.6 |
| 1900-01-02 15:10:00 | 7.6 |
| 1900-01-02 15:11:00 | 7.6 |
| 1900-01-02 15:12:00 | 7.6 |
| 1900-01-02 15:13:00 | 10.8 |
| 1900-01-02 15:14:00 | 10.8 |
| 1900-01-02 15:15:00 | 10.1 |
| 1900-01-02 15:16:00 | 10.1 |
| 1900-01-02 15:17:00 | 9.4 |
| 1900-01-02 15:18:00 | 9.4 |
| 1900-01-02 15:19:00 | 11.5 |
| 1900-01-02 15:20:00 | 11.5 |
| 1900-01-02 15:21:00 | 10.8 |
| 1900-01-02 15:22:00 | 10.8 |
| 1900-01-02 15:23:00 | 8.6 |
| 1900-01-02 15:24:00 | 8.6 |
| 1900-01-02 15:25:00 | 6.1 |
| 1900-01-02 15:26:00 | 6.1 |
| 1900-01-02 15:27:00 | 10.8 |
| 1900-01-02 15:28:00 | 10.8 |
| 1900-01-02 15:29:00 | 6.1 |
| 1900-01-02 15:30:00 | 6.1 |
| 1900-01-02 15:31:00 | 6.1 |
| 1900-01-02 15:32:00 | 5.4 |
| 1900-01-02 15:33:00 | 5.4 |
| 1900-01-02 15:34:00 | 9.4 |
| 1900-01-02 15:35:00 | 9.4 |
| 1900-01-02 15:36:00 | 5 |
| 1900-01-02 15:37:00 | 5 |
| 1900-01-02 15:38:00 | 4.3 |
| 1900-01-02 15:39:00 | 4.3 |
| 1900-01-02 15:40:00 | 11.2 |
| 1900-01-02 15:41:00 | 11.2 |
| 1900-01-02 15:42:00 | 11.2 |
| 1900-01-02 15:43:00 | 11.2 |
| 1900-01-02 15:44:00 | 12.2 |
| 1900-01-02 15:45:00 | 12.2 |
| 1900-01-02 15:46:00 | 11.2 |
| 1900-01-02 15:47:00 | 11.2 |
| 1900-01-02 15:48:00 | 14 |
| 1900-01-02 15:49:00 | 14 |
| 1900-01-02 15:50:00 | 30.6 |
| 1900-01-02 15:51:00 | 30.6 |
| 1900-01-02 15:52:00 | 25.2 |
| 1900-01-02 15:53:00 | 25.2 |
| 1900-01-02 15:54:00 | 15.5 |
| 1900-01-02 15:55:00 | 15.5 |
| 1900-01-02 15:56:00 | 22 |
| 1900-01-02 15:57:00 | 22 |
| 1900-01-02 15:58:00 | 22.7 |
| 1900-01-02 15:59:00 | 22.7 |
| 1900-01-02 16:00:00 | 36.4 |
| 1900-01-02 16:01:00 | 36.4 |
| 1900-01-02 16:02:00 | 33.1 |
| 1900-01-02 16:03:00 | 23.4 |
| 1900-01-02 16:04:00 | 23.4 |
| 1900-01-02 16:05:00 | 21.2 |
| 1900-01-02 16:06:00 | 21.2 |
| 1900-01-02 16:07:00 | 18 |
| 1900-01-02 16:08:00 | 18 |
| 1900-01-02 16:09:00 | 18.7 |
| 1900-01-02 16:10:00 | 18.7 |
| 1900-01-02 16:11:00 | 25.9 |
| 1900-01-02 16:12:00 | 25.9 |
| 1900-01-02 16:13:00 | 32.8 |
| 1900-01-02 16:14:00 | 32.8 |
| 1900-01-02 16:15:00 | 28.4 |
| 1900-01-02 16:16:00 | 28.4 |
| 1900-01-02 16:17:00 | 27 |
| 1900-01-02 16:18:00 | 27 |
| 1900-01-02 16:19:00 | 22.7 |
| 1900-01-02 16:20:00 | 22.7 |
| 1900-01-02 16:21:00 | 25.9 |
| 1900-01-02 16:22:00 | 25.9 |
| 1900-01-02 16:23:00 | 24.5 |
| 1900-01-02 16:24:00 | 24.5 |
| 1900-01-02 16:25:00 | 39.2 |
| 1900-01-02 16:26:00 | 39.2 |
| 1900-01-02 16:27:00 | 39.2 |
| 1900-01-02 16:28:00 | 33.8 |
| 1900-01-02 16:29:00 | 33.8 |
| 1900-01-02 16:30:00 | 24.5 |
| 1900-01-02 16:31:00 | 24.5 |
| 1900-01-02 16:32:00 | 30.6 |
| 1900-01-02 16:33:00 | 30.6 |
| 1900-01-02 16:34:00 | 31.7 |
| 1900-01-02 16:35:00 | 31.7 |
| 1900-01-02 16:36:00 | 20.2 |
| 1900-01-02 16:37:00 | 20.2 |
| 1900-01-02 16:38:00 | 31 |
| 1900-01-02 16:39:00 | 31 |
| 1900-01-02 16:40:00 | 19.8 |
| 1900-01-02 16:41:00 | 19.8 |
| 1900-01-02 16:42:00 | 29.5 |
| 1900-01-02 16:43:00 | 29.5 |
| 1900-01-02 16:44:00 | 27.7 |
| 1900-01-02 16:45:00 | 27.7 |
| 1900-01-02 16:46:00 | 25.6 |
| 1900-01-02 16:47:00 | 25.6 |
| 1900-01-02 16:48:00 | 35.6 |
| 1900-01-02 16:49:00 | 35.6 |
| 1900-01-02 16:50:00 | 31 |
| 1900-01-02 16:51:00 | 31 |
| 1900-01-02 16:52:00 | 38.5 |
| 1900-01-02 16:53:00 | 38.5 |
| 1900-01-02 16:54:00 | 55.8 |
| 1900-01-02 16:55:00 | 55.8 |
| 1900-01-02 16:56:00 | 40 |
| 1900-01-02 16:57:00 | 40 |
| 1900-01-02 16:58:00 | 37.1 |
| 1900-01-02 16:59:00 | 39.6 |
| 1900-01-02 17:00:00 | 39.6 |
| 1900-01-02 17:01:00 | 42.8 |
| 1900-01-02 17:02:00 | 42.8 |
| 1900-01-02 17:03:00 | 29.5 |
| 1900-01-02 17:04:00 | 29.5 |
| 1900-01-02 17:05:00 | 23 |
| 1900-01-02 17:06:00 | 23 |
| 1900-01-02 17:07:00 | 70.2 |
| 1900-01-02 17:08:00 | 70.2 |
| 1900-01-02 17:09:00 | 31.7 |
| 1900-01-02 17:10:00 | 31.7 |
| 1900-01-02 17:11:00 | 50 |
| 1900-01-02 17:12:00 | 50 |
| 1900-01-02 17:13:00 | 55.1 |
| 1900-01-02 17:14:00 | 55.1 |
| 1900-01-02 17:15:00 | 38.5 |
| 1900-01-02 17:16:00 | 38.5 |
| 1900-01-02 17:17:00 | 50.8 |
| 1900-01-02 17:18:00 | 50.8 |
| 1900-01-02 17:19:00 | 47.5 |
| 1900-01-02 17:20:00 | 47.5 |
| 1900-01-02 17:21:00 | 58 |
| 1900-01-02 17:22:00 | 58 |
| 1900-01-02 17:23:00 | 58 |
| 1900-01-02 17:24:00 | 41.8 |
| 1900-01-02 17:25:00 | 41.8 |
| 1900-01-02 17:26:00 | 42.8 |
| 1900-01-02 17:27:00 | 42.8 |
| 1900-01-02 17:28:00 | 25.9 |
| 1900-01-02 17:29:00 | 25.9 |
| 1900-01-02 17:30:00 | 36 |
| 1900-01-02 17:31:00 | 36 |
| 1900-01-02 17:32:00 | 45.4 |
| 1900-01-02 17:33:00 | 45.4 |
| 1900-01-02 17:34:00 | 45 |
| 1900-01-02 17:35:00 | 45 |
| 1900-01-02 17:36:00 | 39.6 |
| 1900-01-02 17:37:00 | 39.6 |
| 1900-01-02 17:38:00 | 46.1 |
| 1900-01-02 17:39:00 | 46.1 |
| 1900-01-02 17:40:00 | 60.5 |
| 1900-01-02 17:41:00 | 60.5 |
| 1900-01-02 17:42:00 | 57.2 |
| 1900-01-02 17:43:00 | 57.2 |
| 1900-01-02 17:44:00 | 24.5 |
| 1900-01-02 17:45:00 | 24.5 |
| 1900-01-02 17:46:00 | 37.8 |
| 1900-01-02 17:47:00 | 37.8 |
| 1900-01-02 17:48:00 | 38.2 |
| 1900-01-02 17:49:00 | 38.2 |
| 1900-01-02 17:50:00 | 50.4 |
| 1900-01-02 17:51:00 | 50.4 |
| 1900-01-02 17:52:00 | 29.2 |
| 1900-01-02 17:53:00 | 29.2 |
| 1900-01-02 17:54:00 | 42.1 |
| 1900-01-02 17:55:00 | 42.1 |
| 1900-01-02 17:56:00 | 41 |
| 1900-01-02 17:57:00 | 39.2 |
| 1900-01-02 17:58:00 | 39.2 |
| 1900-01-02 17:59:00 | 28.4 |
| 1900-01-02 18:00:00 | 28.4 |
| 1900-01-02 18:01:00 | 23.4 |
| 1900-01-02 18:02:00 | 23.4 |
| 1900-01-02 18:03:00 | 29.2 |
| 1900-01-02 18:04:00 | 29.2 |
| 1900-01-02 18:05:00 | 28.1 |
| 1900-01-02 18:06:00 | 28.1 |
| 1900-01-02 18:07:00 | 28.8 |
| 1900-01-02 18:08:00 | 28.8 |
| 1900-01-02 18:09:00 | 43.2 |
| 1900-01-02 18:10:00 | 43.2 |
| 1900-01-02 18:11:00 | 32.4 |
| 1900-01-02 18:12:00 | 32.4 |
| 1900-01-02 18:13:00 | 41.4 |
| 1900-01-02 18:14:00 | 41.4 |
| 1900-01-02 18:15:00 | 30.2 |
| 1900-01-02 18:16:00 | 30.2 |
| 1900-01-02 18:17:00 | 23.4 |
| 1900-01-02 18:18:00 | 23.4 |
| 1900-01-02 18:19:00 | 28.1 |
| 1900-01-02 18:20:00 | 28.1 |
| 1900-01-02 18:21:00 | 28.1 |
| 1900-01-02 18:22:00 | 15.5 |
| 1900-01-02 18:23:00 | 15.5 |
| 1900-01-02 18:24:00 | 38.5 |
| 1900-01-02 18:25:00 | 38.5 |
| 1900-01-02 18:26:00 | 18.4 |
| 1900-01-02 18:27:00 | 18.4 |
| 1900-01-02 18:28:00 | 21.2 |
| 1900-01-02 18:29:00 | 21.2 |
| 1900-01-02 18:30:00 | 31 |
| 1900-01-02 18:31:00 | 31 |
| 1900-01-02 18:32:00 | 29.5 |
| 1900-01-02 18:33:00 | 29.5 |
| 1900-01-02 18:34:00 | 25.2 |
| 1900-01-02 18:35:00 | 25.2 |
| 1900-01-02 18:36:00 | 46.4 |
| 1900-01-02 18:37:00 | 46.4 |
| 1900-01-02 18:38:00 | 33.8 |
| 1900-01-02 18:39:00 | 33.8 |
| 1900-01-02 18:40:00 | 37.4 |
| 1900-01-02 18:41:00 | 37.4 |
| 1900-01-02 18:42:00 | 28.8 |
| 1900-01-02 18:43:00 | 28.8 |
| 1900-01-02 18:44:00 | 38.9 |
| 1900-01-02 18:45:00 | 38.9 |
| 1900-01-02 18:46:00 | 48.2 |
| 1900-01-02 18:47:00 | 48.2 |
| 1900-01-02 18:48:00 | 33.8 |
| 1900-01-02 18:49:00 | 33.8 |
| 1900-01-02 18:50:00 | 31.7 |
| 1900-01-02 18:51:00 | 38.9 |
| 1900-01-02 18:52:00 | 38.9 |
| 1900-01-02 18:53:00 | 66.6 |
| 1900-01-02 18:54:00 | 66.6 |
| 1900-01-02 18:55:00 | 43.6 |
| 1900-01-02 18:56:00 | 43.6 |
| 1900-01-02 18:57:00 | 55.4 |
| 1900-01-02 18:58:00 | 55.4 |
| 1900-01-02 18:59:00 | 58.3 |
| 1900-01-02 19:00:00 | 58.3 |
| 1900-01-02 19:01:00 | 49.3 |
| 1900-01-02 19:02:00 | 49.3 |
| 1900-01-02 19:03:00 | 35.3 |
| 1900-01-02 19:04:00 | 35.3 |
| 1900-01-02 19:05:00 | 29.2 |
| 1900-01-02 19:06:00 | 29.2 |
| 1900-01-02 19:07:00 | 44.3 |
| 1900-01-02 19:08:00 | 44.3 |
| 1900-01-02 19:09:00 | 38.2 |
| 1900-01-02 19:10:00 | 38.2 |
| 1900-01-02 19:11:00 | 34.6 |
| 1900-01-02 19:12:00 | 34.6 |
| 1900-01-02 19:13:00 | 37.1 |
| 1900-01-02 19:14:00 | 37.1 |
| 1900-01-02 19:15:00 | 32 |
| 1900-01-02 19:16:00 | 32 |
| 1900-01-02 19:17:00 | 32 |
| 1900-01-02 19:18:00 | 24.1 |
| 1900-01-02 19:19:00 | 24.1 |
| 1900-01-02 19:20:00 | 49 |
| 1900-01-02 19:21:00 | 49 |
| 1900-01-02 19:22:00 | 28.1 |
| 1900-01-02 19:23:00 | 28.1 |
| 1900-01-02 19:24:00 | 48.2 |
| 1900-01-02 19:25:00 | 48.2 |
| 1900-01-02 19:26:00 | 43.9 |
| 1900-01-02 19:27:00 | 43.9 |
| 1900-01-02 19:28:00 | 45 |
| 1900-01-02 19:29:00 | 45 |
| 1900-01-02 19:30:00 | 45 |
| 1900-01-02 19:31:00 | 45 |
| 1900-01-02 19:32:00 | 29.5 |
| 1900-01-02 19:33:00 | 29.5 |
| 1900-01-02 19:34:00 | 47.2 |
| 1900-01-02 19:35:00 | 47.2 |
| 1900-01-02 19:36:00 | 75.2 |
| 1900-01-02 19:37:00 | 75.2 |
| 1900-01-02 19:38:00 | 29.5 |
| 1900-01-02 19:39:00 | 29.5 |
| 1900-01-02 19:40:00 | 49.3 |
| 1900-01-02 19:41:00 | 49.3 |
| 1900-01-02 19:42:00 | 54.4 |
| 1900-01-02 19:43:00 | 54.4 |
| 1900-01-02 19:44:00 | 43.6 |
| 1900-01-02 19:45:00 | 43.6 |
| 1900-01-02 19:46:00 | 41.4 |
| 1900-01-02 19:47:00 | 41.4 |
| 1900-01-02 19:48:00 | 38.2 |
| 1900-01-02 19:49:00 | 53.3 |
| 1900-01-02 19:50:00 | 53.3 |
| 1900-01-02 19:51:00 | 42.5 |
| 1900-01-02 19:52:00 | 42.5 |
| 1900-01-02 19:53:00 | 42.5 |
| 1900-01-02 19:54:00 | 42.5 |
| 1900-01-02 19:55:00 | 52.2 |
| 1900-01-02 19:56:00 | 52.2 |
| 1900-01-02 19:57:00 | 42.5 |
| 1900-01-02 19:58:00 | 42.5 |
| 1900-01-02 19:59:00 | 41 |
| 1900-01-02 20:00:00 | 41 |
| 1900-01-02 20:01:00 | 40.7 |
| 1900-01-02 20:02:00 | 40.7 |
| 1900-01-02 20:03:00 | 47.9 |
| 1900-01-02 20:04:00 | 47.9 |
| 1900-01-02 20:05:00 | 56.5 |
| 1900-01-02 20:06:00 | 56.5 |
| 1900-01-02 20:07:00 | 37.8 |
| 1900-01-02 20:08:00 | 37.8 |
| 1900-01-02 20:09:00 | 37.4 |
| 1900-01-02 20:10:00 | 37.4 |
| 1900-01-02 20:11:00 | 37.4 |
| 1900-01-02 20:12:00 | 50.4 |
| 1900-01-02 20:13:00 | 50.4 |
| 1900-01-02 20:14:00 | 40 |
| 1900-01-02 20:15:00 | 40 |
| 1900-01-02 20:16:00 | 49 |
| 1900-01-02 20:17:00 | 49 |
| 1900-01-02 20:18:00 | 44.3 |
| 1900-01-02 20:19:00 | 44.3 |
| 1900-01-02 20:20:00 | 33.8 |
| 1900-01-02 20:21:00 | 33.8 |
| 1900-01-02 20:22:00 | 31 |
| 1900-01-02 20:23:00 | 31 |
| 1900-01-02 20:24:00 | 49.3 |
| 1900-01-02 20:25:00 | 49.3 |
| 1900-01-02 20:26:00 | 41.8 |
| 1900-01-02 20:27:00 | 41.8 |
| 1900-01-02 20:28:00 | 30.6 |
| 1900-01-02 20:29:00 | 30.6 |
| 1900-01-02 20:30:00 | 33.8 |
| 1900-01-02 20:31:00 | 33.8 |
| 1900-01-02 20:32:00 | 43.9 |
| 1900-01-02 20:33:00 | 43.9 |
| 1900-01-02 20:34:00 | 32.4 |
| 1900-01-02 20:35:00 | 32.4 |
| 1900-01-02 20:36:00 | 40.3 |
| 1900-01-02 20:37:00 | 40.3 |
| 1900-01-02 20:38:00 | 35.6 |
| 1900-01-02 20:39:00 | 35.6 |
| 1900-01-02 20:40:00 | 25.2 |
| 1900-01-02 20:41:00 | 25.2 |
| 1900-01-02 20:42:00 | 32.4 |
| 1900-01-02 20:43:00 | 25.9 |
| 1900-01-02 20:44:00 | 25.9 |
| 1900-01-02 20:45:00 | 39.6 |
| 1900-01-02 20:46:00 | 39.6 |
| 1900-01-02 20:47:00 | 36.4 |
| 1900-01-02 20:48:00 | 36.4 |
| 1900-01-02 20:49:00 | 25.2 |
| 1900-01-02 20:50:00 | 25.2 |
| 1900-01-02 20:51:00 | 33.5 |
| 1900-01-02 20:52:00 | 33.5 |
| 1900-01-02 20:53:00 | 22 |
| 1900-01-02 20:54:00 | 22 |
| 1900-01-02 20:55:00 | 27.7 |
| 1900-01-02 20:56:00 | 27.7 |
| 1900-01-02 20:57:00 | 21.2 |
| 1900-01-02 20:58:00 | 21.2 |
| 1900-01-02 20:59:00 | 37.4 |
| 1900-01-02 21:00:00 | 37.4 |
| 1900-01-02 21:01:00 | 30.6 |
| 1900-01-02 21:02:00 | 30.6 |
| 1900-01-02 21:03:00 | 38.2 |
| 1900-01-02 21:04:00 | 38.2 |
| 1900-01-02 21:05:00 | 22 |
| 1900-01-02 21:06:00 | 22 |
| 1900-01-02 21:07:00 | 22 |
| 1900-01-02 21:08:00 | 18 |
| 1900-01-02 21:09:00 | 18 |
| 1900-01-02 21:10:00 | 40.7 |
| 1900-01-02 21:11:00 | 40.7 |
| 1900-01-02 21:12:00 | 51.5 |
| 1900-01-02 21:13:00 | 51.5 |
| 1900-01-02 21:14:00 | 31 |
| 1900-01-02 21:15:00 | 31 |
| 1900-01-02 21:16:00 | 34.9 |
| 1900-01-02 21:17:00 | 34.9 |
| 1900-01-02 21:18:00 | 28.4 |
| 1900-01-02 21:19:00 | 28.4 |
| 1900-01-02 21:20:00 | 34.6 |
| 1900-01-02 21:21:00 | 34.6 |
| 1900-01-02 21:22:00 | 35.3 |
| 1900-01-02 21:23:00 | 35.3 |
| 1900-01-02 21:24:00 | 54.7 |
| 1900-01-02 21:25:00 | 54.7 |
| 1900-01-02 21:26:00 | 40.7 |
| 1900-01-02 21:27:00 | 40.7 |
| 1900-01-02 21:28:00 | 42.8 |
| 1900-01-02 21:29:00 | 42.8 |
| 1900-01-02 21:30:00 | 33.8 |
| 1900-01-02 21:31:00 | 33.8 |
| 1900-01-02 21:32:00 | 54 |
| 1900-01-02 21:33:00 | 54 |
| 1900-01-02 21:34:00 | 38.5 |
| 1900-01-02 21:35:00 | 38.5 |
| 1900-01-02 21:36:00 | 34.9 |
| 1900-01-02 21:37:00 | 47.5 |
| 1900-01-02 21:38:00 | 47.5 |
| 1900-01-02 21:39:00 | 37.4 |
| 1900-01-02 21:40:00 | 37.4 |
| 1900-01-02 21:41:00 | 38.5 |
| 1900-01-02 21:42:00 | 38.5 |
| 1900-01-02 21:43:00 | 34.6 |
| 1900-01-02 21:44:00 | 34.6 |
| 1900-01-02 21:45:00 | 34.2 |
| 1900-01-02 21:46:00 | 34.2 |
| 1900-01-02 21:47:00 | 33.1 |
| 1900-01-02 21:48:00 | 33.1 |
| 1900-01-02 21:49:00 | 33.8 |
| 1900-01-02 21:50:00 | 33.8 |
| 1900-01-02 21:51:00 | 34.9 |
| 1900-01-02 21:52:00 | 34.9 |
| 1900-01-02 21:53:00 | 37.8 |
| 1900-01-02 21:54:00 | 37.8 |
| 1900-01-02 21:55:00 | 29.9 |
| 1900-01-02 21:56:00 | 29.9 |
| 1900-01-02 21:57:00 | 51.5 |
| 1900-01-02 21:58:00 | 51.5 |
| 1900-01-02 21:59:00 | 35.6 |
| 1900-01-02 22:00:00 | 35.6 |
| 1900-01-02 22:01:00 | 35.6 |
| 1900-01-02 22:02:00 | 43.6 |
| 1900-01-02 22:03:00 | 43.6 |
| 1900-01-02 22:04:00 | 50.4 |
| 1900-01-02 22:05:00 | 50.4 |
| 1900-01-02 22:06:00 | 33.8 |
| 1900-01-02 22:07:00 | 33.8 |
| 1900-01-02 22:08:00 | 37.1 |
| 1900-01-02 22:09:00 | 37.1 |
| 1900-01-02 22:10:00 | 36 |
| 1900-01-02 22:11:00 | 36 |
| 1900-01-02 22:12:00 | 32 |
| 1900-01-02 22:13:00 | 32 |
| 1900-01-02 22:14:00 | 25.6 |
| 1900-01-02 22:15:00 | 25.6 |
| 1900-01-02 22:16:00 | 20.9 |
| 1900-01-02 22:17:00 | 20.9 |
| 1900-01-02 22:18:00 | 34.2 |
| 1900-01-02 22:19:00 | 34.2 |
| 1900-01-02 22:20:00 | 38.5 |
| 1900-01-02 22:21:00 | 38.5 |
| 1900-01-02 22:22:00 | 16.6 |
| 1900-01-02 22:23:00 | 16.6 |
| 1900-01-02 22:24:00 | 34.9 |
| 1900-01-02 22:25:00 | 34.9 |
| 1900-01-02 22:26:00 | 24.5 |
| 1900-01-02 22:27:00 | 24.5 |
| 1900-01-02 22:28:00 | 28.4 |
| 1900-01-02 22:29:00 | 28.4 |
| 1900-01-02 22:30:00 | 24.5 |
| 1900-01-02 22:31:00 | 36.7 |
| 1900-01-02 22:32:00 | 36.7 |
| 1900-01-02 22:33:00 | 23 |
| 1900-01-02 22:34:00 | 23 |
| 1900-01-02 22:35:00 | 27.7 |
| 1900-01-02 22:36:00 | 27.7 |
| 1900-01-02 22:37:00 | 22.7 |
| 1900-01-02 22:38:00 | 22.7 |
| 1900-01-02 22:39:00 | 30.6 |
| 1900-01-02 22:40:00 | 30.6 |
| 1900-01-02 22:41:00 | 20.5 |
| 1900-01-02 22:42:00 | 20.5 |
| 1900-01-02 22:43:00 | 30.6 |
| 1900-01-02 22:44:00 | 30.6 |
| 1900-01-02 22:45:00 | 18 |
| 1900-01-02 22:46:00 | 18 |
| 1900-01-02 22:47:00 | 28.8 |
| 1900-01-02 22:48:00 | 28.8 |
| 1900-01-02 22:49:00 | 30.6 |
| 1900-01-02 22:50:00 | 30.6 |
| 1900-01-02 22:51:00 | 28.1 |
| 1900-01-02 22:52:00 | 28.1 |
| 1900-01-02 22:53:00 | 28.1 |
| 1900-01-02 22:54:00 | 28.1 |
| 1900-01-02 22:55:00 | 27.7 |
| 1900-01-02 22:56:00 | 27.7 |
| 1900-01-02 22:57:00 | 27.7 |
| 1900-01-02 22:58:00 | 24.5 |
| 1900-01-02 22:59:00 | 24.5 |
| 1900-01-02 23:00:00 | 31.7 |
| 1900-01-02 23:01:00 | 31.7 |
| 1900-01-02 23:02:00 | 22 |
| 1900-01-02 23:03:00 | 22 |
| 1900-01-02 23:04:00 | 32 |
| 1900-01-02 23:05:00 | 32 |
| 1900-01-02 23:06:00 | 31 |
| 1900-01-02 23:07:00 | 31 |
| 1900-01-02 23:08:00 | 22.7 |
| 1900-01-02 23:09:00 | 22.7 |
| 1900-01-02 23:10:00 | 21.6 |
| 1900-01-02 23:11:00 | 21.6 |
| 1900-01-02 23:12:00 | 31 |
| 1900-01-02 23:13:00 | 31 |
| 1900-01-02 23:14:00 | 31.7 |
| 1900-01-02 23:15:00 | 31.7 |
| 1900-01-02 23:16:00 | 34.9 |
| 1900-01-02 23:17:00 | 34.9 |
| 1900-01-02 23:18:00 | 15.1 |
| 1900-01-02 23:19:00 | 15.1 |
| 1900-01-02 23:20:00 | 21.6 |
| 1900-01-02 23:21:00 | 21.6 |
| 1900-01-02 23:22:00 | 23 |
| 1900-01-02 23:23:00 | 23 |
| 1900-01-02 23:24:00 | 34.2 |
| 1900-01-02 23:25:00 | 34.2 |
| 1900-01-02 23:26:00 | 22.3 |
| 1900-01-02 23:27:00 | 22.3 |
| 1900-01-02 23:28:00 | 19.8 |
| 1900-01-02 23:29:00 | 29.9 |
| 1900-01-02 23:30:00 | 29.9 |
| 1900-01-02 23:31:00 | 26.6 |
| 1900-01-02 23:32:00 | 26.6 |
| 1900-01-02 23:33:00 | 21.6 |
| 1900-01-02 23:34:00 | 21.6 |
| 1900-01-02 23:35:00 | 19.1 |
| 1900-01-02 23:36:00 | 19.1 |
| 1900-01-02 23:37:00 | 16.6 |
| 1900-01-02 23:38:00 | 16.6 |
| 1900-01-02 23:39:00 | 21.2 |
| 1900-01-02 23:40:00 | 21.2 |
| 1900-01-02 23:41:00 | 25.2 |
| 1900-01-02 23:42:00 | 25.2 |
| 1900-01-02 23:43:00 | 16.9 |
| 1900-01-02 23:44:00 | 16.9 |
| 1900-01-02 23:45:00 | 20.2 |
| 1900-01-02 23:46:00 | 20.2 |
| 1900-01-02 23:47:00 | 25.9 |
| 1900-01-02 23:48:00 | 25.9 |
| 1900-01-02 23:49:00 | 16.6 |
| 1900-01-02 23:50:00 | 16.6 |
| 1900-01-02 23:51:00 | 16.6 |
| 1900-01-02 23:52:00 | 23.4 |
| 1900-01-02 23:53:00 | 23.4 |
| 1900-01-02 23:54:00 | 31.7 |
| 1900-01-02 23:55:00 | 31.7 |
| 1900-01-02 23:56:00 | 25.6 |
| 1900-01-02 23:57:00 | 25.6 |
| 1900-01-02 23:58:00 | 25.9 |
| 1900-01-02 23:59:00 | 25.9 |
| 1900-01-03 | 17.6 |
| 1900-01-03 00:01:00 | 17.6 |
| 1900-01-03 00:02:00 | 20.9 |
| 1900-01-03 00:03:00 | 20.9 |
| 1900-01-03 00:04:00 | 31.3 |
| 1900-01-03 00:05:00 | 31.3 |
| 1900-01-03 00:06:00 | 26.3 |
| 1900-01-03 00:07:00 | 26.3 |
| 1900-01-03 00:08:00 | 33.8 |
| 1900-01-03 00:09:00 | 33.8 |
| 1900-01-03 00:10:00 | 33.8 |
| 1900-01-03 00:11:00 | 33.8 |
| 1900-01-03 00:12:00 | 30.6 |
| 1900-01-03 00:13:00 | 30.6 |
| 1900-01-03 00:14:00 | 24.5 |
| 1900-01-03 00:15:00 | 24.5 |
| 1900-01-03 00:16:00 | 37.8 |
| 1900-01-03 00:17:00 | 37.8 |
| 1900-01-03 00:18:00 | 31 |
| 1900-01-03 00:19:00 | 31 |
| 1900-01-03 00:20:00 | 77.8 |
| 1900-01-03 00:21:00 | 77.8 |
| 1900-01-03 00:22:00 | 58 |
| 1900-01-03 00:23:00 | 52.9 |
| 1900-01-03 00:24:00 | 52.9 |
| 1900-01-03 00:25:00 | 33.1 |
| 1900-01-03 00:26:00 | 33.1 |
| 1900-01-03 00:27:00 | 50 |
| 1900-01-03 00:28:00 | 50 |
| 1900-01-03 00:29:00 | 31.7 |
| 1900-01-03 00:30:00 | 31.7 |
| 1900-01-03 00:31:00 | 33.1 |
| 1900-01-03 00:32:00 | 33.1 |
| 1900-01-03 00:33:00 | 39.6 |
| 1900-01-03 00:34:00 | 39.6 |
| 1900-01-03 00:35:00 | 29.9 |
| 1900-01-03 00:36:00 | 29.9 |
| 1900-01-03 00:37:00 | 26.3 |
| 1900-01-03 00:38:00 | 26.3 |
| 1900-01-03 00:39:00 | 39.6 |
| 1900-01-03 00:40:00 | 39.6 |
| 1900-01-03 00:41:00 | 38.2 |
| 1900-01-03 00:42:00 | 38.2 |
| 1900-01-03 00:43:00 | 30.6 |
| 1900-01-03 00:44:00 | 30.6 |
| 1900-01-03 00:45:00 | 37.1 |
| 1900-01-03 00:46:00 | 37.1 |
| 1900-01-03 00:47:00 | 37.1 |
| 1900-01-03 00:48:00 | 29.2 |
| 1900-01-03 00:49:00 | 29.2 |
| 1900-01-03 00:50:00 | 25.2 |
| 1900-01-03 00:51:00 | 25.2 |
| 1900-01-03 00:52:00 | 21.2 |
| 1900-01-03 00:53:00 | 21.2 |
| 1900-01-03 00:54:00 | 34.6 |
| 1900-01-03 00:55:00 | 34.6 |
| 1900-01-03 00:56:00 | 35.3 |
| 1900-01-03 00:57:00 | 35.3 |
| 1900-01-03 00:58:00 | 37.8 |
| 1900-01-03 00:59:00 | 37.8 |
| 1900-01-03 01:00:00 | 28.1 |
| 1900-01-03 01:01:00 | 28.1 |
| 1900-01-03 01:02:00 | 23 |
| 1900-01-03 01:03:00 | 23 |
| 1900-01-03 01:04:00 | 34.6 |
| 1900-01-03 01:05:00 | 34.6 |
| 1900-01-03 01:06:00 | 22.7 |
| 1900-01-03 01:07:00 | 22.7 |
| 1900-01-03 01:08:00 | 26.6 |
| 1900-01-03 01:09:00 | 26.6 |
| 1900-01-03 01:10:00 | 12.6 |
| 1900-01-03 01:11:00 | 12.6 |
| 1900-01-03 01:12:00 | 32 |
| 1900-01-03 01:13:00 | 32 |
| 1900-01-03 01:14:00 | 28.8 |
| 1900-01-03 01:15:00 | 28.8 |
| 1900-01-03 01:16:00 | 22 |
| 1900-01-03 01:17:00 | 22 |
| 1900-01-03 01:18:00 | 21.2 |
| 1900-01-03 01:19:00 | 33.8 |
| 1900-01-03 01:20:00 | 33.8 |
| 1900-01-03 01:21:00 | 19.1 |
| 1900-01-03 01:22:00 | 19.1 |
| 1900-01-03 01:23:00 | 23.8 |
| 1900-01-03 01:24:00 | 23.8 |
| 1900-01-03 01:25:00 | 25.6 |
| 1900-01-03 01:26:00 | 25.6 |
| 1900-01-03 01:27:00 | 19.4 |
| 1900-01-03 01:28:00 | 19.4 |
| 1900-01-03 01:29:00 | 32 |
| 1900-01-03 01:30:00 | 32 |
| 1900-01-03 01:31:00 | 32.4 |
| 1900-01-03 01:32:00 | 32.4 |
| 1900-01-03 01:33:00 | 29.9 |
| 1900-01-03 01:34:00 | 29.9 |
| 1900-01-03 01:35:00 | 23 |
| 1900-01-03 01:36:00 | 23 |
| 1900-01-03 01:37:00 | 23.4 |
| 1900-01-03 01:38:00 | 23.4 |
| 1900-01-03 01:39:00 | 25.2 |
| 1900-01-03 01:40:00 | 25.2 |
| 1900-01-03 01:41:00 | 23.4 |
| 1900-01-03 01:42:00 | 23.4 |
| 1900-01-03 01:43:00 | 23.4 |
| 1900-01-03 01:44:00 | 25.6 |
| 1900-01-03 01:45:00 | 25.6 |
| 1900-01-03 01:46:00 | 22.3 |
| 1900-01-03 01:47:00 | 22.3 |
| 1900-01-03 01:48:00 | 23.4 |
| 1900-01-03 01:49:00 | 23.4 |
| 1900-01-03 01:50:00 | 14.8 |
| 1900-01-03 01:51:00 | 14.8 |
| 1900-01-03 01:52:00 | 33.5 |
| 1900-01-03 01:53:00 | 33.5 |
| 1900-01-03 01:54:00 | 21.6 |
| 1900-01-03 01:55:00 | 21.6 |
| 1900-01-03 01:56:00 | 19.8 |
| 1900-01-03 01:57:00 | 19.8 |
| 1900-01-03 01:58:00 | 37.8 |
| 1900-01-03 01:59:00 | 37.8 |
| 1900-01-03 02:00:00 | 33.1 |
| 1900-01-03 02:01:00 | 33.1 |
| 1900-01-03 02:02:00 | 27.4 |
| 1900-01-03 02:03:00 | 27.4 |
| 1900-01-03 02:04:00 | 15.5 |
| 1900-01-03 02:05:00 | 15.5 |
| 1900-01-03 02:06:00 | 25.6 |
| 1900-01-03 02:07:00 | 25.6 |
| 1900-01-03 02:08:00 | 18.7 |
| 1900-01-03 02:09:00 | 18.7 |
| 1900-01-03 02:10:00 | 26.3 |
| 1900-01-03 02:11:00 | 26.3 |
| 1900-01-03 02:12:00 | 25.9 |
| 1900-01-03 02:13:00 | 16.2 |
| 1900-01-03 02:14:00 | 16.2 |
| 1900-01-03 02:15:00 | 13.7 |
| 1900-01-03 02:16:00 | 13.7 |
| 1900-01-03 02:17:00 | 18.7 |
| 1900-01-03 02:18:00 | 18.7 |
| 1900-01-03 02:19:00 | 23 |
| 1900-01-03 02:20:00 | 23 |
| 1900-01-03 02:21:00 | 19.1 |
| 1900-01-03 02:22:00 | 19.1 |
| 1900-01-03 02:23:00 | 19.4 |
| 1900-01-03 02:24:00 | 19.4 |
| 1900-01-03 02:25:00 | 19.1 |
| 1900-01-03 02:26:00 | 19.1 |
| 1900-01-03 02:27:00 | 22 |
| 1900-01-03 02:28:00 | 22 |
| 1900-01-03 02:29:00 | 20.9 |
| 1900-01-03 02:30:00 | 20.9 |
| 1900-01-03 02:31:00 | 20.5 |
| 1900-01-03 02:32:00 | 20.5 |
| 1900-01-03 02:33:00 | 24.5 |
| 1900-01-03 02:34:00 | 24.5 |
| 1900-01-03 02:35:00 | 16.2 |
| 1900-01-03 02:36:00 | 16.2 |
| 1900-01-03 02:37:00 | 16.2 |
| 1900-01-03 02:38:00 | 24.5 |
| 1900-01-03 02:39:00 | 24.5 |
| 1900-01-03 02:40:00 | 20.5 |
| 1900-01-03 02:41:00 | 20.5 |
| 1900-01-03 02:42:00 | 13.7 |
| 1900-01-03 02:43:00 | 13.7 |
| 1900-01-03 02:44:00 | 24.5 |
| 1900-01-03 02:45:00 | 24.5 |
| 1900-01-03 02:46:00 | 20.9 |
| 1900-01-03 02:47:00 | 20.9 |
| 1900-01-03 02:48:00 | 20.9 |
| 1900-01-03 02:49:00 | 20.9 |
| 1900-01-03 02:50:00 | 29.2 |
| 1900-01-03 02:51:00 | 29.2 |
| 1900-01-03 02:52:00 | 19.4 |
| 1900-01-03 02:53:00 | 19.4 |
| 1900-01-03 02:54:00 | 20.5 |
| 1900-01-03 02:55:00 | 20.5 |
| 1900-01-03 02:56:00 | 19.4 |
| 1900-01-03 02:57:00 | 19.4 |
| 1900-01-03 02:58:00 | 28.4 |
| 1900-01-03 02:59:00 | 28.4 |
| 1900-01-03 03:00:00 | 14.4 |
| 1900-01-03 03:01:00 | 14.4 |
| 1900-01-03 03:02:00 | 24.5 |
| 1900-01-03 03:03:00 | 24.5 |
| 1900-01-03 03:04:00 | 15.5 |
| 1900-01-03 03:05:00 | 15.5 |
| 1900-01-03 03:06:00 | 16.6 |
| 1900-01-03 03:07:00 | 24.5 |
| 1900-01-03 03:08:00 | 24.5 |
| 1900-01-03 03:09:00 | 25.6 |
| 1900-01-03 03:10:00 | 25.6 |
| 1900-01-03 03:11:00 | 12.6 |
| 1900-01-03 03:12:00 | 12.6 |
| 1900-01-03 03:13:00 | 18.7 |
| 1900-01-03 03:14:00 | 18.7 |
| 1900-01-03 03:15:00 | 18.4 |
| 1900-01-03 03:16:00 | 18.4 |
| 1900-01-03 03:17:00 | 21.2 |
| 1900-01-03 03:18:00 | 21.2 |
| 1900-01-03 03:19:00 | 21.6 |
| 1900-01-03 03:20:00 | 21.6 |
| 1900-01-03 03:21:00 | 33.8 |
| 1900-01-03 03:22:00 | 33.8 |
| 1900-01-03 03:23:00 | 13 |
| 1900-01-03 03:24:00 | 13 |
| 1900-01-03 03:25:00 | 30.2 |
| 1900-01-03 03:26:00 | 30.2 |
| 1900-01-03 03:27:00 | 18 |
| 1900-01-03 03:28:00 | 18 |
| 1900-01-03 03:29:00 | 19.1 |
| 1900-01-03 03:30:00 | 19.1 |
| 1900-01-03 03:31:00 | 13.3 |
| 1900-01-03 03:32:00 | 13.3 |
| 1900-01-03 03:33:00 | 13.3 |
| 1900-01-03 03:34:00 | 19.4 |
| 1900-01-03 03:35:00 | 19.4 |
| 1900-01-03 03:36:00 | 21.2 |
| 1900-01-03 03:37:00 | 21.2 |
| 1900-01-03 03:38:00 | 22.7 |
| 1900-01-03 03:39:00 | 22.7 |
| 1900-01-03 03:40:00 | 13.7 |
| 1900-01-03 03:41:00 | 13.7 |
| 1900-01-03 03:42:00 | 12.6 |
| 1900-01-03 03:43:00 | 12.6 |
| 1900-01-03 03:44:00 | 21.2 |
| 1900-01-03 03:45:00 | 21.2 |
| 1900-01-03 03:46:00 | 11.9 |
| 1900-01-03 03:47:00 | 11.9 |
| 1900-01-03 03:48:00 | 12.2 |
| 1900-01-03 03:49:00 | 12.2 |
| 1900-01-03 03:50:00 | 11.2 |
| 1900-01-03 03:51:00 | 11.2 |
| 1900-01-03 03:52:00 | 23.4 |
| 1900-01-03 03:53:00 | 23.4 |
| 1900-01-03 03:54:00 | 32 |
| 1900-01-03 03:55:00 | 32 |
| 1900-01-03 03:56:00 | 20.5 |
| 1900-01-03 03:57:00 | 20.5 |
| 1900-01-03 03:58:00 | 20.2 |
| 1900-01-03 03:59:00 | 20.2 |
| 1900-01-03 04:00:00 | 26.6 |
| 1900-01-03 04:01:00 | 25.9 |
| 1900-01-03 04:02:00 | 35.6 |
| 1900-01-03 04:03:00 | 35.6 |
| 1900-01-03 04:04:00 | 43.6 |
| 1900-01-03 04:05:00 | 43.6 |
| 1900-01-03 04:06:00 | 49.3 |
| 1900-01-03 04:07:00 | 49.3 |
| 1900-01-03 04:08:00 | 33.5 |
| 1900-01-03 04:09:00 | 33.5 |
| 1900-01-03 04:10:00 | 50.4 |
| 1900-01-03 04:11:00 | 50.4 |
| 1900-01-03 04:12:00 | 33.5 |
| 1900-01-03 04:13:00 | 33.5 |
| 1900-01-03 04:14:00 | 29.9 |
| 1900-01-03 04:15:00 | 29.9 |
| 1900-01-03 04:16:00 | 42.8 |
| 1900-01-03 04:17:00 | 42.8 |
| 1900-01-03 04:18:00 | 35.6 |
| 1900-01-03 04:19:00 | 35.6 |
| 1900-01-03 04:20:00 | 32 |
| 1900-01-03 04:21:00 | 32 |
| 1900-01-03 04:22:00 | 54.7 |
| 1900-01-03 04:23:00 | 54.7 |
| 1900-01-03 04:24:00 | 33.8 |
| 1900-01-03 04:25:00 | 33.8 |
| 1900-01-03 04:26:00 | 33.8 |
| 1900-01-03 04:27:00 | 37.8 |
| 1900-01-03 04:28:00 | 37.8 |
| 1900-01-03 04:29:00 | 33.1 |
| 1900-01-03 04:30:00 | 33.1 |
| 1900-01-03 04:31:00 | 32 |
| 1900-01-03 04:32:00 | 32 |
| 1900-01-03 04:33:00 | 24.5 |
| 1900-01-03 04:34:00 | 24.5 |
| 1900-01-03 04:35:00 | 22 |
| 1900-01-03 04:36:00 | 22 |
| 1900-01-03 04:37:00 | 15.5 |
| 1900-01-03 04:38:00 | 15.5 |
| 1900-01-03 04:39:00 | 14 |
| 1900-01-03 04:40:00 | 14 |
| 1900-01-03 04:41:00 | 21.6 |
| 1900-01-03 04:42:00 | 21.6 |
| 1900-01-03 04:43:00 | 15.1 |
| 1900-01-03 04:44:00 | 15.1 |
| 1900-01-03 04:45:00 | 23 |
| 1900-01-03 04:46:00 | 23 |
| 1900-01-03 04:47:00 | 23 |
| 1900-01-03 04:48:00 | 17.6 |
| 1900-01-03 04:49:00 | 17.6 |
| 1900-01-03 04:50:00 | 18.7 |
| 1900-01-03 04:51:00 | 18.7 |
| 1900-01-03 04:52:00 | 27 |
| 1900-01-03 04:53:00 | 27 |
| 1900-01-03 04:54:00 | 36.7 |
| 1900-01-03 04:55:00 | 36.7 |
| 1900-01-03 04:56:00 | 30.6 |
| 1900-01-03 04:57:00 | 30.6 |
| 1900-01-03 04:58:00 | 23.4 |
| 1900-01-03 04:59:00 | 25.9 |
| 1900-01-03 05:00:00 | 25.9 |
| 1900-01-03 05:01:00 | 41.4 |
| 1900-01-03 05:02:00 | 41.4 |
| 1900-01-03 05:03:00 | 40.3 |
| 1900-01-03 05:04:00 | 40.3 |
| 1900-01-03 05:05:00 | 46.1 |
| 1900-01-03 05:06:00 | 46.1 |
| 1900-01-03 05:07:00 | 30.6 |
| 1900-01-03 05:08:00 | 30.6 |
| 1900-01-03 05:09:00 | 27.7 |
| 1900-01-03 05:10:00 | 27.7 |
| 1900-01-03 05:11:00 | 33.8 |
| 1900-01-03 05:12:00 | 33.8 |
| 1900-01-03 05:13:00 | 31 |
| 1900-01-03 05:14:00 | 31 |
| 1900-01-03 05:15:00 | 34.9 |
| 1900-01-03 05:16:00 | 34.9 |
| 1900-01-03 05:17:00 | 29.9 |
| 1900-01-03 05:18:00 | 29.9 |
| 1900-01-03 05:19:00 | 25.9 |
| 1900-01-03 05:20:00 | 25.9 |
| 1900-01-03 05:21:00 | 18 |
| 1900-01-03 05:22:00 | 18 |
| 1900-01-03 05:23:00 | 23 |
| 1900-01-03 05:24:00 | 23 |
| 1900-01-03 05:25:00 | 23 |
| 1900-01-03 05:26:00 | 28.4 |
| 1900-01-03 05:27:00 | 28.4 |
| 1900-01-03 05:28:00 | 32 |
| 1900-01-03 05:29:00 | 32 |
| 1900-01-03 05:30:00 | 26.6 |
| 1900-01-03 05:31:00 | 26.6 |
| 1900-01-03 05:32:00 | 25.2 |
| 1900-01-03 05:33:00 | 25.2 |
| 1900-01-03 05:34:00 | 22.7 |
| 1900-01-03 05:35:00 | 22.7 |
| 1900-01-03 05:36:00 | 17.6 |
| 1900-01-03 05:37:00 | 17.6 |
| 1900-01-03 05:38:00 | 20.5 |
| 1900-01-03 05:39:00 | 20.5 |
| 1900-01-03 05:40:00 | 22.3 |
| 1900-01-03 05:41:00 | 22.3 |
| 1900-01-03 05:42:00 | 16.6 |
| 1900-01-03 05:43:00 | 16.6 |
| 1900-01-03 05:44:00 | 18 |
| 1900-01-03 05:45:00 | 18 |
| 1900-01-03 05:46:00 | 31.7 |
| 1900-01-03 05:47:00 | 31.7 |
| 1900-01-03 05:48:00 | 29.9 |
| 1900-01-03 05:49:00 | 29.9 |
| 1900-01-03 05:50:00 | 20.2 |
| 1900-01-03 05:51:00 | 20.2 |
| 1900-01-03 05:52:00 | 18.7 |
| 1900-01-03 05:53:00 | 18.7 |
| 1900-01-03 05:54:00 | 21.2 |
| 1900-01-03 05:55:00 | 21.2 |
| 1900-01-03 05:56:00 | 16.2 |
| 1900-01-03 05:57:00 | 14.8 |
| 1900-01-03 05:58:00 | 14.8 |
| 1900-01-03 05:59:00 | 33.1 |
| 1900-01-03 06:00:00 | 33.1 |
| 1900-01-03 06:01:00 | 22.7 |
| 1900-01-03 06:02:00 | 22.7 |
| 1900-01-03 06:03:00 | 21.2 |
| 1900-01-03 06:04:00 | 21.2 |
| 1900-01-03 06:05:00 | 34.6 |
| 1900-01-03 06:06:00 | 34.6 |
| 1900-01-03 06:07:00 | 22.7 |
| 1900-01-03 06:08:00 | 22.7 |
| 1900-01-03 06:09:00 | 20.9 |
| 1900-01-03 06:10:00 | 20.9 |
| 1900-01-03 06:11:00 | 18.7 |
| 1900-01-03 06:12:00 | 18.7 |
| 1900-01-03 06:13:00 | 26.3 |
| 1900-01-03 06:14:00 | 26.3 |
| 1900-01-03 06:15:00 | 26.6 |
| 1900-01-03 06:16:00 | 26.6 |
| 1900-01-03 06:17:00 | 28.8 |
| 1900-01-03 06:18:00 | 28.8 |
| 1900-01-03 06:19:00 | 21.2 |
| 1900-01-03 06:20:00 | 21.2 |
| 1900-01-03 06:21:00 | 42.8 |
| 1900-01-03 06:22:00 | 42.8 |
| 1900-01-03 06:23:00 | 42.8 |
| 1900-01-03 06:24:00 | 37.1 |
| 1900-01-03 06:25:00 | 37.1 |
| 1900-01-03 06:26:00 | 37.8 |
| 1900-01-03 06:27:00 | 37.8 |
| 1900-01-03 06:28:00 | 41.8 |
| 1900-01-03 06:29:00 | 41.8 |
| 1900-01-03 06:30:00 | 50.8 |
| 1900-01-03 06:31:00 | 50.8 |
| 1900-01-03 06:32:00 | 39.6 |
| 1900-01-03 06:33:00 | 39.6 |
| 1900-01-03 06:34:00 | 32 |
| 1900-01-03 06:35:00 | 32 |
| 1900-01-03 06:36:00 | 48.2 |
| 1900-01-03 06:37:00 | 48.2 |
| 1900-01-03 06:38:00 | 32.4 |
| 1900-01-03 06:39:00 | 32.4 |
| 1900-01-03 06:40:00 | 21.2 |
| 1900-01-03 06:41:00 | 21.2 |
| 1900-01-03 06:42:00 | 27 |
| 1900-01-03 06:43:00 | 27 |
| 1900-01-03 06:44:00 | 31.7 |
| 1900-01-03 06:45:00 | 31.7 |
| 1900-01-03 06:46:00 | 23 |
| 1900-01-03 06:47:00 | 23 |
| 1900-01-03 06:48:00 | 18.7 |
| 1900-01-03 06:49:00 | 18.7 |
| 1900-01-03 06:50:00 | 31.7 |
| 1900-01-03 06:51:00 | 31.7 |
| 1900-01-03 06:52:00 | 25.9 |
| 1900-01-03 06:53:00 | 31.7 |
| 1900-01-03 06:54:00 | 31.7 |
| 1900-01-03 06:55:00 | 18.7 |
| 1900-01-03 06:56:00 | 18.7 |
| 1900-01-03 06:57:00 | 40.3 |
| 1900-01-03 06:58:00 | 40.3 |
| 1900-01-03 06:59:00 | 27.4 |
| 1900-01-03 07:00:00 | 27.4 |
| 1900-01-03 07:01:00 | 33.8 |
| 1900-01-03 07:02:00 | 33.8 |
| 1900-01-03 07:03:00 | 32 |
| 1900-01-03 07:04:00 | 32 |
| 1900-01-03 07:05:00 | 21.6 |
| 1900-01-03 07:06:00 | 21.6 |
| 1900-01-03 07:07:00 | 35.6 |
| 1900-01-03 07:08:00 | 35.6 |
| 1900-01-03 07:09:00 | 21.2 |
| 1900-01-03 07:10:00 | 21.2 |
| 1900-01-03 07:11:00 | 35.6 |
| 1900-01-03 07:12:00 | 35.6 |
| 1900-01-03 07:13:00 | 32.8 |
| 1900-01-03 07:14:00 | 32.8 |
| 1900-01-03 07:15:00 | 32.4 |
| 1900-01-03 07:16:00 | 32.4 |
| 1900-01-03 07:17:00 | 32.4 |
| 1900-01-03 07:18:00 | 34.9 |
| 1900-01-03 07:19:00 | 34.9 |
| 1900-01-03 07:20:00 | 37.4 |
| 1900-01-03 07:21:00 | 37.4 |
| 1900-01-03 07:22:00 | 27.4 |
| 1900-01-03 07:23:00 | 27.4 |
| 1900-01-03 07:24:00 | 27.7 |
| 1900-01-03 07:25:00 | 27.7 |
| 1900-01-03 07:26:00 | 25.9 |
| 1900-01-03 07:27:00 | 25.9 |
| 1900-01-03 07:28:00 | 22 |
| 1900-01-03 07:29:00 | 22 |
| 1900-01-03 07:30:00 | 26.3 |
| 1900-01-03 07:31:00 | 26.3 |
| 1900-01-03 07:32:00 | 29.5 |
| 1900-01-03 07:33:00 | 29.5 |
| 1900-01-03 07:34:00 | 22.7 |
| 1900-01-03 07:35:00 | 22.7 |
| 1900-01-03 07:36:00 | 27.7 |
| 1900-01-03 07:37:00 | 27.7 |
| 1900-01-03 07:38:00 | 34.9 |
| 1900-01-03 07:39:00 | 34.9 |
| 1900-01-03 07:40:00 | 34.6 |
| 1900-01-03 07:41:00 | 34.6 |
| 1900-01-03 07:42:00 | 34.9 |
| 1900-01-03 07:43:00 | 34.9 |
| 1900-01-03 07:44:00 | 31.7 |
| 1900-01-03 07:45:00 | 31.7 |
| 1900-01-03 07:46:00 | 27.4 |
| 1900-01-03 07:47:00 | 29.5 |
| 1900-01-03 07:48:00 | 29.5 |
| 1900-01-03 07:49:00 | 23 |
| 1900-01-03 07:50:00 | 23 |
| 1900-01-03 07:51:00 | 33.1 |
| 1900-01-03 07:52:00 | 33.1 |
| 1900-01-03 07:53:00 | 40.7 |
| 1900-01-03 07:54:00 | 40.7 |
| 1900-01-03 07:55:00 | 23 |
| 1900-01-03 07:56:00 | 23 |
| 1900-01-03 07:57:00 | 46.1 |
| 1900-01-03 07:58:00 | 46.1 |
| 1900-01-03 07:59:00 | 41.8 |
| 1900-01-03 08:00:00 | 41.8 |
| 1900-01-03 08:01:00 | 40.3 |
| 1900-01-03 08:02:00 | 40.3 |
| 1900-01-03 08:03:00 | 36 |
| 1900-01-03 08:04:00 | 36 |
| 1900-01-03 08:05:00 | 30.6 |
| 1900-01-03 08:06:00 | 30.6 |
| 1900-01-03 08:07:00 | 58.3 |
| 1900-01-03 08:08:00 | 58.3 |
| 1900-01-03 08:09:00 | 47.5 |
| 1900-01-03 08:10:00 | 47.5 |
| 1900-01-03 08:11:00 | 40.3 |
| 1900-01-03 08:12:00 | 40.3 |
| 1900-01-03 08:13:00 | 40.3 |
| 1900-01-03 08:14:00 | 26.3 |
| 1900-01-03 08:15:00 | 26.3 |
| 1900-01-03 08:16:00 | 22.7 |
| 1900-01-03 08:17:00 | 22.7 |
| 1900-01-03 08:18:00 | 27 |
| 1900-01-03 08:19:00 | 27 |
| 1900-01-03 08:20:00 | 34.2 |
| 1900-01-03 08:21:00 | 34.2 |
| 1900-01-03 08:22:00 | 22.7 |
| 1900-01-03 08:23:00 | 22.7 |
| 1900-01-03 08:24:00 | 25.6 |
| 1900-01-03 08:25:00 | 25.6 |
| 1900-01-03 08:26:00 | 31.7 |
| 1900-01-03 08:27:00 | 31.7 |
| 1900-01-03 08:28:00 | 32.4 |
| 1900-01-03 08:29:00 | 32.4 |
| 1900-01-03 08:30:00 | 31 |
| 1900-01-03 08:31:00 | 31 |
| 1900-01-03 08:32:00 | 33.8 |
| 1900-01-03 08:33:00 | 33.8 |
| 1900-01-03 08:34:00 | 29.5 |
| 1900-01-03 08:35:00 | 29.5 |
| 1900-01-03 08:36:00 | 19.1 |
| 1900-01-03 08:37:00 | 19.1 |
| 1900-01-03 08:38:00 | 29.2 |
| 1900-01-03 08:39:00 | 29.2 |
| 1900-01-03 08:40:00 | 32.4 |
| 1900-01-03 08:41:00 | 32.4 |
| 1900-01-03 08:42:00 | 27 |
| 1900-01-03 08:43:00 | 27 |
| 1900-01-03 08:44:00 | 30.2 |
| 1900-01-03 08:45:00 | 30.6 |
| 1900-01-03 08:46:00 | 30.6 |
| 1900-01-03 08:47:00 | 22.3 |
| 1900-01-03 08:48:00 | 22.3 |
| 1900-01-03 08:49:00 | 32.4 |
| 1900-01-03 08:50:00 | 32.4 |
| 1900-01-03 08:51:00 | 26.3 |
| 1900-01-03 08:52:00 | 26.3 |
| 1900-01-03 08:53:00 | 32.4 |
| 1900-01-03 08:54:00 | 32.4 |
| 1900-01-03 08:55:00 | 23.4 |
| 1900-01-03 08:56:00 | 23.4 |
| 1900-01-03 08:57:00 | 25.9 |
| 1900-01-03 08:58:00 | 25.9 |
| 1900-01-03 08:59:00 | 20.9 |
| 1900-01-03 09:00:00 | 20.9 |
| 1900-01-03 09:01:00 | 28.8 |
| 1900-01-03 09:02:00 | 28.8 |
| 1900-01-03 09:03:00 | 31 |
| 1900-01-03 09:04:00 | 31 |
| 1900-01-03 09:05:00 | 25.9 |
| 1900-01-03 09:06:00 | 25.9 |
| 1900-01-03 09:07:00 | 36 |
| 1900-01-03 09:08:00 | 36 |
| 1900-01-03 09:09:00 | 33.8 |
| 1900-01-03 09:10:00 | 33.8 |
| 1900-01-03 09:11:00 | 33.8 |
| 1900-01-03 09:12:00 | 36 |
| 1900-01-03 09:13:00 | 36 |
| 1900-01-03 09:14:00 | 51.8 |
| 1900-01-03 09:15:00 | 51.8 |
| 1900-01-03 09:16:00 | 44.6 |
| 1900-01-03 09:17:00 | 44.6 |
| 1900-01-03 09:18:00 | 54 |
| 1900-01-03 09:19:00 | 54 |
| 1900-01-03 09:20:00 | 22.3 |
| 1900-01-03 09:21:00 | 22.3 |
| 1900-01-03 09:22:00 | 55.8 |
| 1900-01-03 09:23:00 | 55.8 |
| 1900-01-03 09:24:00 | 31.3 |
| 1900-01-03 09:25:00 | 31.3 |
| 1900-01-03 09:26:00 | 29.5 |
| 1900-01-03 09:27:00 | 29.5 |
| 1900-01-03 09:28:00 | 31.3 |
| 1900-01-03 09:29:00 | 31.3 |
| 1900-01-03 09:30:00 | 41 |
| 1900-01-03 09:31:00 | 41 |
| 1900-01-03 09:32:00 | 32.4 |
| 1900-01-03 09:33:00 | 32.4 |
| 1900-01-03 09:34:00 | 44.3 |
| 1900-01-03 09:35:00 | 44.3 |
| 1900-01-03 09:36:00 | 25.9 |
| 1900-01-03 09:37:00 | 25.9 |
| 1900-01-03 09:38:00 | 29.2 |
| 1900-01-03 09:39:00 | 29.2 |
| 1900-01-03 09:40:00 | 32 |
| 1900-01-03 09:41:00 | 32 |
| 1900-01-03 09:42:00 | 36.7 |
| 1900-01-03 09:43:00 | 30.6 |
| 1900-01-03 09:44:00 | 30.6 |
| 1900-01-03 09:45:00 | 24.8 |
| 1900-01-03 09:46:00 | 24.8 |
| 1900-01-03 09:47:00 | 47.2 |
| 1900-01-03 09:48:00 | 47.2 |
| 1900-01-03 09:49:00 | 28.8 |
| 1900-01-03 09:50:00 | 28.8 |
| 1900-01-03 09:51:00 | 32.4 |
| 1900-01-03 09:52:00 | 32.4 |
| 1900-01-03 09:53:00 | 44.3 |
| 1900-01-03 09:54:00 | 44.3 |
| 1900-01-03 09:55:00 | 38.9 |
| 1900-01-03 09:56:00 | 38.9 |
| 1900-01-03 09:57:00 | 39.2 |
| 1900-01-03 09:58:00 | 39.2 |
| 1900-01-03 09:59:00 | 30.6 |
| 1900-01-03 10:00:00 | 30.6 |
| 1900-01-03 10:01:00 | 40.7 |
| 1900-01-03 10:02:00 | 40.7 |
| 1900-01-03 10:03:00 | 30.6 |
| 1900-01-03 10:04:00 | 30.6 |
| 1900-01-03 10:05:00 | 30.6 |
| 1900-01-03 10:06:00 | 36.7 |
| 1900-01-03 10:07:00 | 36.7 |
| 1900-01-03 10:08:00 | 55.4 |
| 1900-01-03 10:09:00 | 55.4 |
| 1900-01-03 10:10:00 | 47.5 |
| 1900-01-03 10:11:00 | 47.5 |
| 1900-01-03 10:12:00 | 31.3 |
| 1900-01-03 10:13:00 | 31.3 |
| 1900-01-03 10:14:00 | 31.7 |
| 1900-01-03 10:15:00 | 31.7 |
| 1900-01-03 10:16:00 | 25.6 |
| 1900-01-03 10:17:00 | 25.6 |
| 1900-01-03 10:18:00 | 33.1 |
| 1900-01-03 10:19:00 | 33.1 |
| 1900-01-03 10:20:00 | 33.8 |
| 1900-01-03 10:21:00 | 33.8 |
| 1900-01-03 10:22:00 | 25.2 |
| 1900-01-03 10:23:00 | 25.2 |
| 1900-01-03 10:24:00 | 29.9 |
| 1900-01-03 10:25:00 | 29.9 |
| 1900-01-03 10:26:00 | 35.3 |
| 1900-01-03 10:27:00 | 35.3 |
| 1900-01-03 10:28:00 | 28.1 |
| 1900-01-03 10:29:00 | 28.1 |
| 1900-01-03 10:30:00 | 44.3 |
| 1900-01-03 10:31:00 | 44.3 |
| 1900-01-03 10:32:00 | 26.3 |
| 1900-01-03 10:33:00 | 26.3 |
| 1900-01-03 10:34:00 | 18.7 |
| 1900-01-03 10:35:00 | 18.7 |
| 1900-01-03 10:36:00 | 29.2 |
| 1900-01-03 10:37:00 | 31.3 |
| 1900-01-03 10:38:00 | 31.3 |
| 1900-01-03 10:39:00 | 55.4 |
| 1900-01-03 10:40:00 | 55.4 |
| 1900-01-03 10:41:00 | 31 |
| 1900-01-03 10:42:00 | 31 |
| 1900-01-03 10:43:00 | 49.3 |
| 1900-01-03 10:44:00 | 49.3 |
| 1900-01-03 10:45:00 | 32.4 |
| 1900-01-03 10:46:00 | 32.4 |
| 1900-01-03 10:47:00 | 40.3 |
| 1900-01-03 10:48:00 | 40.3 |
| 1900-01-03 10:49:00 | 34.6 |
| 1900-01-03 10:50:00 | 34.6 |
| 1900-01-03 10:51:00 | 40 |
| 1900-01-03 10:52:00 | 40 |
| 1900-01-03 10:53:00 | 32 |
| 1900-01-03 10:54:00 | 32 |
| 1900-01-03 10:55:00 | 26.6 |
| 1900-01-03 10:56:00 | 26.6 |
| 1900-01-03 10:57:00 | 39.6 |
| 1900-01-03 10:58:00 | 39.6 |
| 1900-01-03 10:59:00 | 52.9 |
| 1900-01-03 11:00:00 | 52.9 |
| 1900-01-03 11:01:00 | 52.9 |
| 1900-01-03 11:02:00 | 42.5 |
| 1900-01-03 11:03:00 | 42.5 |
| 1900-01-03 11:04:00 | 61.9 |
| 1900-01-03 11:05:00 | 61.9 |
| 1900-01-03 11:06:00 | 63.7 |
| 1900-01-03 11:07:00 | 63.7 |
| 1900-01-03 11:08:00 | 53.6 |
| 1900-01-03 11:09:00 | 53.6 |
| 1900-01-03 11:10:00 | 24.5 |
| 1900-01-03 11:11:00 | 24.5 |
| 1900-01-03 11:12:00 | 36.4 |
| 1900-01-03 11:13:00 | 36.4 |
| 1900-01-03 11:14:00 | 27.4 |
| 1900-01-03 11:15:00 | 27.4 |
| 1900-01-03 11:16:00 | 31.7 |
| 1900-01-03 11:17:00 | 31.7 |
| 1900-01-03 11:18:00 | 33.8 |
| 1900-01-03 11:19:00 | 33.8 |
| 1900-01-03 11:20:00 | 27 |
| 1900-01-03 11:21:00 | 27 |
| 1900-01-03 11:22:00 | 43.6 |
| 1900-01-03 11:23:00 | 43.6 |
| 1900-01-03 11:24:00 | 42.1 |
| 1900-01-03 11:25:00 | 42.1 |
| 1900-01-03 11:26:00 | 47.9 |
| 1900-01-03 11:27:00 | 47.9 |
| 1900-01-03 11:28:00 | 38.9 |
| 1900-01-03 11:29:00 | 38.9 |
| 1900-01-03 11:30:00 | 44.6 |
| 1900-01-03 11:31:00 | 44.6 |
| 1900-01-03 11:32:00 | 29.5 |
| 1900-01-03 11:33:00 | 25.6 |
| 1900-01-03 11:34:00 | 25.6 |
| 1900-01-03 11:35:00 | 47.9 |
| 1900-01-03 11:36:00 | 47.9 |
| 1900-01-03 11:37:00 | 33.1 |
| 1900-01-03 11:38:00 | 33.1 |
| 1900-01-03 11:39:00 | 54.7 |
| 1900-01-03 11:40:00 | 54.7 |
| 1900-01-03 11:41:00 | 39.6 |
| 1900-01-03 11:42:00 | 39.6 |
| 1900-01-03 11:43:00 | 39.6 |
| 1900-01-03 11:44:00 | 39.6 |
| 1900-01-03 11:45:00 | 31.7 |
| 1900-01-03 11:46:00 | 31.7 |
| 1900-01-03 11:47:00 | 51.8 |
| 1900-01-03 11:48:00 | 51.8 |
| 1900-01-03 11:49:00 | 49 |
| 1900-01-03 11:50:00 | 49 |
| 1900-01-03 11:51:00 | 57.6 |
| 1900-01-03 11:52:00 | 57.6 |
| 1900-01-03 11:53:00 | 28.8 |
| 1900-01-03 11:54:00 | 28.8 |
| 1900-01-03 11:55:00 | 28.8 |
| 1900-01-03 11:56:00 | 29.2 |
| 1900-01-03 11:57:00 | 29.2 |
| 1900-01-03 11:58:00 | 20.9 |
| 1900-01-03 11:59:00 | 20.9 |
| 1900-01-03 12:00:00 | 34.2 |
| 1900-01-03 12:01:00 | 34.2 |
| 1900-01-03 12:02:00 | 37.1 |
| 1900-01-03 12:03:00 | 37.1 |
| 1900-01-03 12:04:00 | 37.1 |
| 1900-01-03 12:05:00 | 37.1 |
| 1900-01-03 12:06:00 | 40.3 |
| 1900-01-03 12:07:00 | 40.3 |
| 1900-01-03 12:08:00 | 29.2 |
| 1900-01-03 12:09:00 | 29.2 |
| 1900-01-03 12:10:00 | 32 |
| 1900-01-03 12:11:00 | 32 |
| 1900-01-03 12:12:00 | 30.6 |
| 1900-01-03 12:13:00 | 30.6 |
| 1900-01-03 12:14:00 | 24.8 |
| 1900-01-03 12:15:00 | 24.8 |
| 1900-01-03 12:16:00 | 34.2 |
| 1900-01-03 12:17:00 | 34.2 |
| 1900-01-03 12:18:00 | 28.1 |
| 1900-01-03 12:19:00 | 28.1 |
| 1900-01-03 12:20:00 | 25.6 |
| 1900-01-03 12:21:00 | 25.6 |
| 1900-01-03 12:22:00 | 26.6 |
| 1900-01-03 12:23:00 | 26.6 |
| 1900-01-03 12:24:00 | 29.2 |
| 1900-01-03 12:25:00 | 29.2 |
| 1900-01-03 12:26:00 | 43.9 |
| 1900-01-03 12:27:00 | 34.9 |
| 1900-01-03 12:28:00 | 34.9 |
| 1900-01-03 12:29:00 | 21.6 |
| 1900-01-03 12:30:00 | 21.6 |
| 1900-01-03 12:31:00 | 47.5 |
| 1900-01-03 12:32:00 | 47.5 |
| 1900-01-03 12:33:00 | 30.6 |
| 1900-01-03 12:34:00 | 30.6 |
| 1900-01-03 12:35:00 | 42.5 |
| 1900-01-03 12:36:00 | 42.5 |
| 1900-01-03 12:37:00 | 40 |
| 1900-01-03 12:38:00 | 40 |
| 1900-01-03 12:39:00 | 28.4 |
| 1900-01-03 12:40:00 | 28.4 |
| 1900-01-03 12:41:00 | 25.9 |
| 1900-01-03 12:42:00 | 25.9 |
| 1900-01-03 12:43:00 | 17.3 |
| 1900-01-03 12:44:00 | 17.3 |
| 1900-01-03 12:45:00 | 24.5 |
| 1900-01-03 12:46:00 | 24.5 |
| 1900-01-03 12:47:00 | 28.8 |
| 1900-01-03 12:48:00 | 28.8 |
| 1900-01-03 12:49:00 | 30.2 |
| 1900-01-03 12:50:00 | 30.2 |
| 1900-01-03 12:51:00 | 30.2 |
| 1900-01-03 12:52:00 | 38.5 |
| 1900-01-03 12:53:00 | 38.5 |
| 1900-01-03 12:54:00 | 40 |
| 1900-01-03 12:55:00 | 40 |
| 1900-01-03 12:56:00 | 40.3 |
| 1900-01-03 12:57:00 | 40.3 |
| 1900-01-03 12:58:00 | 18.4 |
| 1900-01-03 12:59:00 | 18.4 |
| 1900-01-03 13:00:00 | 29.2 |
| 1900-01-03 13:01:00 | 29.2 |
| 1900-01-03 13:02:00 | 41.8 |
| 1900-01-03 13:03:00 | 41.8 |
| 1900-01-03 13:04:00 | 46.8 |
| 1900-01-03 13:05:00 | 46.8 |
| 1900-01-03 13:06:00 | 38.5 |
| 1900-01-03 13:07:00 | 38.5 |
| 1900-01-03 13:08:00 | 33.5 |
| 1900-01-03 13:09:00 | 33.5 |
| 1900-01-03 13:10:00 | 54.7 |
| 1900-01-03 13:11:00 | 54.7 |
| 1900-01-03 13:12:00 | 45 |
| 1900-01-03 13:13:00 | 45 |
| 1900-01-03 13:14:00 | 57.2 |
| 1900-01-03 13:15:00 | 57.2 |
| 1900-01-03 13:16:00 | 52.2 |
| 1900-01-03 13:17:00 | 52.2 |
| 1900-01-03 13:18:00 | 32.4 |
| 1900-01-03 13:19:00 | 32.4 |
| 1900-01-03 13:20:00 | 30.6 |
| 1900-01-03 13:21:00 | 35.6 |
| 1900-01-03 13:22:00 | 35.6 |
| 1900-01-03 13:23:00 | 27 |
| 1900-01-03 13:24:00 | 27 |
| 1900-01-03 13:25:00 | 27 |
| 1900-01-03 13:26:00 | 27 |
| 1900-01-03 13:27:00 | 39.6 |
| 1900-01-03 13:28:00 | 39.6 |
| 1900-01-03 13:29:00 | 42.5 |
| 1900-01-03 13:30:00 | 42.5 |
| 1900-01-03 13:31:00 | 23.8 |
| 1900-01-03 13:32:00 | 23.8 |
| 1900-01-03 13:33:00 | 16.2 |
| 1900-01-03 13:34:00 | 16.2 |
| 1900-01-03 13:35:00 | 37.8 |
| 1900-01-03 13:36:00 | 37.8 |
| 1900-01-03 13:37:00 | 30.2 |
| 1900-01-03 13:38:00 | 30.2 |
| 1900-01-03 13:39:00 | 40.7 |
| 1900-01-03 13:40:00 | 40.7 |
| 1900-01-03 13:41:00 | 53.3 |
| 1900-01-03 13:42:00 | 53.3 |
| 1900-01-03 13:43:00 | 26.6 |
| 1900-01-03 13:44:00 | 26.6 |
| 1900-01-03 13:45:00 | 26.6 |
| 1900-01-03 13:46:00 | 42.1 |
| 1900-01-03 13:47:00 | 42.1 |
| 1900-01-03 13:48:00 | 44.6 |
| 1900-01-03 13:49:00 | 44.6 |
| 1900-01-03 13:50:00 | 24.8 |
| 1900-01-03 13:51:00 | 24.8 |
| 1900-01-03 13:52:00 | 33.5 |
| 1900-01-03 13:53:00 | 33.5 |
| 1900-01-03 13:54:00 | 49 |
| 1900-01-03 13:55:00 | 49 |
| 1900-01-03 13:56:00 | 33.8 |
| 1900-01-03 13:57:00 | 33.8 |
| 1900-01-03 13:58:00 | 41.8 |
| 1900-01-03 13:59:00 | 41.8 |
| 1900-01-03 14:00:00 | 31 |
| 1900-01-03 14:01:00 | 31 |
| 1900-01-03 14:02:00 | 36.7 |
| 1900-01-03 14:03:00 | 36.7 |
| 1900-01-03 14:04:00 | 32.4 |
| 1900-01-03 14:05:00 | 32.4 |
| 1900-01-03 14:06:00 | 38.2 |
| 1900-01-03 14:07:00 | 38.2 |
| 1900-01-03 14:08:00 | 47.5 |
| 1900-01-03 14:09:00 | 47.5 |
| 1900-01-03 14:10:00 | 33.8 |
| 1900-01-03 14:11:00 | 33.8 |
| 1900-01-03 14:12:00 | 33.8 |
| 1900-01-03 14:13:00 | 33.8 |
| 1900-01-03 14:14:00 | 41.4 |
| 1900-01-03 14:15:00 | 36 |
| 1900-01-03 14:16:00 | 36 |
| 1900-01-03 14:17:00 | 27.4 |
| 1900-01-03 14:18:00 | 27.4 |
| 1900-01-03 14:19:00 | 42.8 |
| 1900-01-03 14:20:00 | 42.8 |
| 1900-01-03 14:21:00 | 36 |
| 1900-01-03 14:22:00 | 36 |
| 1900-01-03 14:23:00 | 50.4 |
| 1900-01-03 14:24:00 | 50.4 |
| 1900-01-03 14:25:00 | 55.8 |
| 1900-01-03 14:26:00 | 55.8 |
| 1900-01-03 14:27:00 | 33.5 |
| 1900-01-03 14:28:00 | 33.5 |
| 1900-01-03 14:29:00 | 26.6 |
| 1900-01-03 14:30:00 | 26.6 |
| 1900-01-03 14:31:00 | 30.6 |
| 1900-01-03 14:32:00 | 30.6 |
| 1900-01-03 14:33:00 | 41.4 |
| 1900-01-03 14:34:00 | 41.4 |
| 1900-01-03 14:35:00 | 37.1 |
| 1900-01-03 14:36:00 | 37.1 |
| 1900-01-03 14:37:00 | 34.9 |
| 1900-01-03 14:38:00 | 34.9 |
| 1900-01-03 14:39:00 | 34.9 |
| 1900-01-03 14:40:00 | 25.9 |
| 1900-01-03 14:41:00 | 25.9 |
| 1900-01-03 14:42:00 | 25.9 |
| 1900-01-03 14:43:00 | 25.9 |
| 1900-01-03 14:44:00 | 29.2 |
| 1900-01-03 14:45:00 | 29.2 |
| 1900-01-03 14:46:00 | 32 |
| 1900-01-03 14:47:00 | 32 |
| 1900-01-03 14:48:00 | 39.6 |
| 1900-01-03 14:49:00 | 39.6 |
| 1900-01-03 14:50:00 | 37.1 |
| 1900-01-03 14:51:00 | 37.1 |
| 1900-01-03 14:52:00 | 23 |
| 1900-01-03 14:53:00 | 23 |
| 1900-01-03 14:54:00 | 15.1 |
| 1900-01-03 14:55:00 | 15.1 |
| 1900-01-03 14:56:00 | 15.5 |
| 1900-01-03 14:57:00 | 15.5 |
| 1900-01-03 14:58:00 | 18.7 |
| 1900-01-03 14:59:00 | 18.7 |
| 1900-01-03 15:00:00 | 15.1 |
| 1900-01-03 15:01:00 | 15.1 |
| 1900-01-03 15:02:00 | 24.5 |
| 1900-01-03 15:03:00 | 24.5 |
| 1900-01-03 15:04:00 | 29.2 |
| 1900-01-03 15:05:00 | 29.2 |
| 1900-01-03 15:06:00 | 20.2 |
| 1900-01-03 15:07:00 | 20.2 |
| 1900-01-03 15:08:00 | 25.2 |
| 1900-01-03 15:09:00 | 25.2 |
| 1900-01-03 15:10:00 | 15.5 |
| 1900-01-03 15:11:00 | 24.5 |
| 1900-01-03 15:12:00 | 24.5 |
| 1900-01-03 15:13:00 | 16.2 |
| 1900-01-03 15:14:00 | 16.2 |
| 1900-01-03 15:15:00 | 16.9 |
| 1900-01-03 15:16:00 | 16.9 |
| 1900-01-03 15:17:00 | 20.9 |
| 1900-01-03 15:18:00 | 20.9 |
| 1900-01-03 15:19:00 | 47.5 |
| 1900-01-03 15:20:00 | 47.5 |
| 1900-01-03 15:21:00 | 50 |
| 1900-01-03 15:22:00 | 50 |
| 1900-01-03 15:23:00 | 40.7 |
| 1900-01-03 15:24:00 | 40.7 |
| 1900-01-03 15:25:00 | 37.1 |
| 1900-01-03 15:26:00 | 37.1 |
| 1900-01-03 15:27:00 | 29.2 |
| 1900-01-03 15:28:00 | 29.2 |
| 1900-01-03 15:29:00 | 19.8 |
| 1900-01-03 15:30:00 | 19.8 |
| 1900-01-03 15:31:00 | 12.2 |
| 1900-01-03 15:32:00 | 12.2 |
| 1900-01-03 15:33:00 | 12.2 |
| 1900-01-03 15:34:00 | 28.4 |
| 1900-01-03 15:35:00 | 28.4 |
| 1900-01-03 15:36:00 | 20.5 |
| 1900-01-03 15:37:00 | 20.5 |
| 1900-01-03 15:38:00 | 16.2 |
| 1900-01-03 15:39:00 | 16.2 |
| 1900-01-03 15:40:00 | 11.5 |
| 1900-01-03 15:41:00 | 11.5 |
| 1900-01-03 15:42:00 | 15.5 |
| 1900-01-03 15:43:00 | 15.5 |
| 1900-01-03 15:44:00 | 18 |
| 1900-01-03 15:45:00 | 18 |
| 1900-01-03 15:46:00 | 12.2 |
| 1900-01-03 15:47:00 | 12.2 |
| 1900-01-03 15:48:00 | 16.6 |
| 1900-01-03 15:49:00 | 16.6 |
| 1900-01-03 15:50:00 | 25.2 |
| 1900-01-03 15:51:00 | 25.2 |
| 1900-01-03 15:52:00 | 36.4 |
| 1900-01-03 15:53:00 | 36.4 |
| 1900-01-03 15:54:00 | 16.9 |
| 1900-01-03 15:55:00 | 16.9 |
| 1900-01-03 15:56:00 | 47.9 |
| 1900-01-03 15:57:00 | 47.9 |
| 1900-01-03 15:58:00 | 43.6 |
| 1900-01-03 15:59:00 | 43.6 |
| 1900-01-03 16:00:00 | 38.5 |
| 1900-01-03 16:01:00 | 38.5 |
| 1900-01-03 16:02:00 | 54.4 |
| 1900-01-03 16:03:00 | 54.4 |
| 1900-01-03 16:04:00 | 42.5 |
| 1900-01-03 16:05:00 | 32 |
| 1900-01-03 16:06:00 | 32 |
| 1900-01-03 16:07:00 | 24.5 |
| 1900-01-03 16:08:00 | 24.5 |
| 1900-01-03 16:09:00 | 55.4 |
| 1900-01-03 16:10:00 | 55.4 |
| 1900-01-03 16:11:00 | 38.2 |
| 1900-01-03 16:12:00 | 38.2 |
| 1900-01-03 16:13:00 | 44.3 |
| 1900-01-03 16:14:00 | 44.3 |
| 1900-01-03 16:15:00 | 44.3 |
| 1900-01-03 16:16:00 | 44.3 |
| 1900-01-03 16:17:00 | 44.3 |
| 1900-01-03 16:18:00 | 44.3 |
| 1900-01-03 16:19:00 | 44.3 |
| 1900-01-03 16:20:00 | 44.3 |
| 1900-01-03 16:21:00 | 44.3 |
| 1900-01-03 16:22:00 | 44.3 |
| 1900-01-03 16:23:00 | 44.3 |
| 1900-01-03 16:24:00 | 44.3 |
| 1900-01-03 16:25:00 | 44.3 |
| 1900-01-03 16:26:00 | 44.3 |
| 1900-01-03 16:27:00 | 44.3 |
| 1900-01-03 16:28:00 | 44.3 |
| 1900-01-03 16:29:00 | 44.3 |
| 1900-01-03 16:30:00 | 44.3 |
| 1900-01-03 16:31:00 | 44.3 |
| 1900-01-03 16:32:00 | 44.3 |
| 1900-01-03 16:33:00 | 44.3 |
| 1900-01-03 16:34:00 | 44.3 |
| 1900-01-03 16:35:00 | 44.3 |
| 1900-01-03 16:36:00 | 44.3 |
| 1900-01-03 16:37:00 | 44.3 |
| 1900-01-03 16:38:00 | 44.3 |
| 1900-01-03 16:39:00 | 44.3 |
| 1900-01-03 16:40:00 | 44.3 |
| 1900-01-03 16:41:00 | 44.3 |
| 1900-01-03 16:42:00 | 44.3 |
| 1900-01-03 16:43:00 | 44.3 |
| 1900-01-03 16:44:00 | 44.3 |
| 1900-01-03 16:45:00 | 44.3 |
| 1900-01-03 16:46:00 | 44.3 |
| 1900-01-03 16:47:00 | 44.3 |
| 1900-01-03 16:48:00 | 44.3 |
| 1900-01-03 16:49:00 | 44.3 |
| 1900-01-03 16:50:00 | 44.3 |
| 1900-01-03 16:51:00 | 44.3 |
| 1900-01-03 16:52:00 | 44.3 |
| 1900-01-03 16:53:00 | 44.3 |
| 1900-01-03 16:54:00 | 44.3 |
| 1900-01-03 16:55:00 | 44.3 |
| 1900-01-03 16:56:00 | 44.3 |
| 1900-01-03 16:57:00 | 44.3 |
| 1900-01-03 16:58:00 | 44.3 |
| 1900-01-03 16:59:00 | 44.3 |
| 1900-01-03 17:00:00 | 44.3 |
| 1900-01-03 17:01:00 | 44.3 |
| 1900-01-03 17:02:00 | 44.3 |
| 1900-01-03 17:03:00 | 44.3 |
| 1900-01-03 17:04:00 | 44.3 |
| 1900-01-03 17:05:00 | 44.3 |
| 1900-01-03 17:06:00 | 44.3 |
| 1900-01-03 17:07:00 | 44.3 |
| 1900-01-03 17:08:00 | 44.3 |
| 1900-01-03 17:09:00 | 44.3 |
| 1900-01-03 17:10:00 | 44.3 |
| 1900-01-03 17:11:00 | 44.3 |
| 1900-01-03 17:12:00 | 44.3 |
| 1900-01-03 17:13:00 | 44.3 |
| 1900-01-03 17:14:00 | 44.3 |
| 1900-01-03 17:15:00 | 44.3 |
| 1900-01-03 17:16:00 | 24.5 |
| 1900-01-03 17:17:00 | 24.5 |
| 1900-01-03 17:18:00 | 12.6 |
| 1900-01-03 17:19:00 | 12.6 |
| 1900-01-03 17:20:00 | 19.4 |
| 1900-01-03 17:21:00 | 19.4 |
| 1900-01-03 17:22:00 | 16.9 |
| 1900-01-03 17:23:00 | 16.9 |
| 1900-01-03 17:24:00 | 11.5 |
| 1900-01-03 17:25:00 | 11.5 |
| 1900-01-03 17:26:00 | 15.8 |
| 1900-01-03 17:27:00 | 20.9 |
| 1900-01-03 17:28:00 | 20.9 |
| 1900-01-03 17:29:00 | 15.1 |
| 1900-01-03 17:30:00 | 15.1 |
| 1900-01-03 17:31:00 | 25.2 |
| 1900-01-03 17:32:00 | 25.2 |
| 1900-01-03 17:33:00 | 26.3 |
| 1900-01-03 17:34:00 | 26.3 |
| 1900-01-03 17:35:00 | 29.5 |
| 1900-01-03 17:36:00 | 29.5 |
| 1900-01-03 17:37:00 | 18.4 |
| 1900-01-03 17:38:00 | 18.4 |
| 1900-01-03 17:39:00 | 27.7 |
| 1900-01-03 17:40:00 | 27.7 |
| 1900-01-03 17:41:00 | 26.6 |
| 1900-01-03 17:42:00 | 26.6 |
| 1900-01-03 17:43:00 | 29.2 |
| 1900-01-03 17:44:00 | 29.2 |
| 1900-01-03 17:45:00 | 17.6 |
| 1900-01-03 17:46:00 | 17.6 |
| 1900-01-03 17:47:00 | 34.9 |
| 1900-01-03 17:48:00 | 34.9 |
| 1900-01-03 17:49:00 | 43.9 |
| 1900-01-03 17:50:00 | 43.9 |
| 1900-01-03 17:51:00 | 43.9 |
| 1900-01-03 17:52:00 | 37.4 |
| 1900-01-03 17:53:00 | 37.4 |
| 1900-01-03 17:54:00 | 25.6 |
| 1900-01-03 17:55:00 | 25.6 |
| 1900-01-03 17:56:00 | 52.6 |
| 1900-01-03 17:57:00 | 52.6 |
| 1900-01-03 17:58:00 | 41.8 |
| 1900-01-03 17:59:00 | 41.8 |
| 1900-01-03 18:00:00 | 37.1 |
| 1900-01-03 18:01:00 | 37.1 |
| 1900-01-03 18:02:00 | 29.5 |
| 1900-01-03 18:03:00 | 29.5 |
| 1900-01-03 18:04:00 | 19.4 |
| 1900-01-03 18:05:00 | 19.4 |
| 1900-01-03 18:06:00 | 19.8 |
| 1900-01-03 18:07:00 | 19.8 |
| 1900-01-03 18:08:00 | 18 |
| 1900-01-03 18:09:00 | 18 |
| 1900-01-03 18:10:00 | 16.9 |
| 1900-01-03 18:11:00 | 16.9 |
| 1900-01-03 18:12:00 | 20.9 |
| 1900-01-03 18:13:00 | 20.9 |
| 1900-01-03 18:14:00 | 13 |
| 1900-01-03 18:15:00 | 13 |
| 1900-01-03 18:16:00 | 13 |
| 1900-01-03 18:17:00 | 13 |
| 1900-01-03 18:18:00 | 13 |
| 1900-01-03 18:19:00 | 13 |
| 1900-01-03 18:20:00 | 13 |
| 1900-01-03 18:21:00 | 13 |
| 1900-01-03 18:22:00 | 13 |
| 1900-01-03 18:23:00 | 13 |
| 1900-01-03 18:24:00 | 13 |
| 1900-01-03 18:25:00 | 13 |
| 1900-01-03 18:26:00 | 24.5 |
| 1900-01-03 18:27:00 | 25.2 |
| 1900-01-03 18:28:00 | 25.2 |
| 1900-01-03 18:29:00 | 25.2 |
| 1900-01-03 18:30:00 | 22.7 |
| 1900-01-03 18:31:00 | 22.7 |
| 1900-01-03 18:32:00 | 18.7 |
| 1900-01-03 18:33:00 | 18.7 |
| 1900-01-03 18:34:00 | 28.1 |
| 1900-01-03 18:35:00 | 28.1 |
| 1900-01-03 18:36:00 | 25.2 |
| 1900-01-03 18:37:00 | 25.2 |
| 1900-01-03 18:38:00 | 18.7 |
| 1900-01-03 18:39:00 | 18.7 |
| 1900-01-03 18:40:00 | 19.8 |
| 1900-01-03 18:41:00 | 19.8 |
| 1900-01-03 18:42:00 | 16.6 |
| 1900-01-03 18:43:00 | 16.6 |
| 1900-01-03 18:44:00 | 12.2 |
| 1900-01-03 18:45:00 | 12.2 |
| 1900-01-03 18:46:00 | 17.6 |
| 1900-01-03 18:47:00 | 17.6 |
| 1900-01-03 18:48:00 | 15.8 |
| 1900-01-03 18:49:00 | 15.8 |
| 1900-01-03 18:50:00 | 11.5 |
| 1900-01-03 18:51:00 | 11.5 |
| 1900-01-03 18:52:00 | 17.6 |
| 1900-01-03 18:53:00 | 17.6 |
| 1900-01-03 18:54:00 | 18 |
| 1900-01-03 18:55:00 | 18 |
| 1900-01-03 18:56:00 | 11.2 |
| 1900-01-03 18:57:00 | 11.2 |
| 1900-01-03 18:58:00 | 15.1 |
| 1900-01-03 18:59:00 | 15.1 |